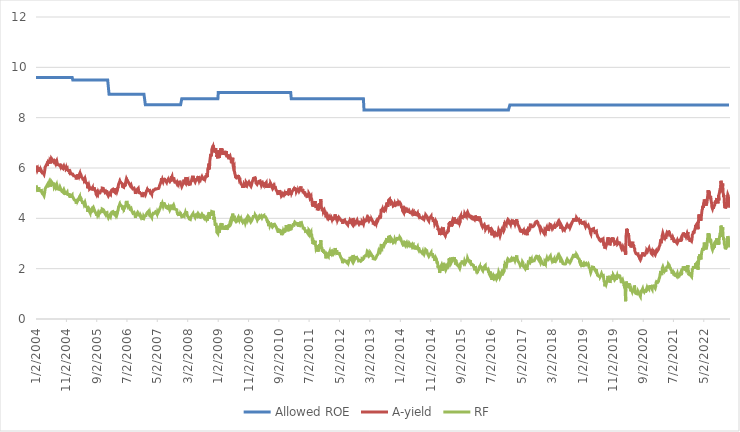
| Category | Allowed ROE | A-yield | RF |
|---|---|---|---|
| 1/2/04 | 9.6 | 6.096 | 5.309 |
| 1/5/04 | 9.6 | 6.115 | 5.33 |
| 1/6/04 | 9.6 | 6.053 | 5.27 |
| 1/7/04 | 9.6 | 6.03 | 5.258 |
| 1/8/04 | 9.6 | 6.066 | 5.287 |
| 1/9/04 | 9.6 | 5.976 | 5.2 |
| 1/12/04 | 9.6 | 5.974 | 5.194 |
| 1/13/04 | 9.6 | 5.954 | 5.166 |
| 1/14/04 | 9.6 | 5.903 | 5.14 |
| 1/15/04 | 9.6 | 5.89 | 5.121 |
| 1/16/04 | 9.6 | 5.939 | 5.148 |
| 1/19/04 | 9.6 | 5.949 | 5.153 |
| 1/20/04 | 9.6 | 5.943 | 5.155 |
| 1/21/04 | 9.6 | 5.906 | 5.117 |
| 1/22/04 | 9.6 | 5.849 | 5.056 |
| 1/23/04 | 9.6 | 5.945 | 5.149 |
| 1/26/04 | 9.6 | 5.986 | 5.186 |
| 1/27/04 | 9.6 | 5.961 | 5.16 |
| 1/28/04 | 9.6 | 6.03 | 5.234 |
| 1/29/04 | 9.6 | 6.031 | 5.229 |
| 1/30/04 | 9.6 | 5.971 | 5.172 |
| 2/2/04 | 9.6 | 5.996 | 5.189 |
| 2/3/04 | 9.6 | 5.988 | 5.175 |
| 2/4/04 | 9.6 | 5.97 | 5.173 |
| 2/5/04 | 9.6 | 5.977 | 5.179 |
| 2/6/04 | 9.6 | 5.908 | 5.105 |
| 2/9/04 | 9.6 | 5.897 | 5.094 |
| 2/10/04 | 9.6 | 5.929 | 5.125 |
| 2/11/04 | 9.6 | 5.883 | 5.082 |
| 2/12/04 | 9.6 | 5.909 | 5.103 |
| 2/13/04 | 9.6 | 5.896 | 5.088 |
| 2/16/04 | 9.6 | 5.896 | 5.088 |
| 2/17/04 | 9.6 | 5.896 | 5.088 |
| 2/18/04 | 9.6 | 5.921 | 5.11 |
| 2/19/04 | 9.6 | 5.941 | 5.121 |
| 2/20/04 | 9.6 | 5.966 | 5.156 |
| 2/23/04 | 9.6 | 5.938 | 5.132 |
| 2/24/04 | 9.6 | 5.909 | 5.106 |
| 2/25/04 | 9.6 | 5.893 | 5.092 |
| 2/26/04 | 9.6 | 5.906 | 5.102 |
| 2/27/04 | 9.6 | 5.862 | 5.06 |
| 3/1/04 | 9.6 | 5.814 | 5.023 |
| 3/2/04 | 9.6 | 5.846 | 5.025 |
| 3/3/04 | 9.6 | 5.86 | 5.047 |
| 3/4/04 | 9.6 | 5.856 | 5.046 |
| 3/5/04 | 9.6 | 5.8 | 4.984 |
| 3/8/04 | 9.6 | 5.779 | 4.96 |
| 3/9/04 | 9.6 | 5.769 | 4.956 |
| 3/10/04 | 9.6 | 5.785 | 4.966 |
| 3/11/04 | 9.6 | 5.798 | 4.977 |
| 3/12/04 | 9.6 | 5.817 | 4.99 |
| 3/15/04 | 9.6 | 5.814 | 4.966 |
| 3/16/04 | 9.6 | 5.789 | 4.941 |
| 3/17/04 | 9.6 | 5.753 | 4.912 |
| 3/18/04 | 9.6 | 5.771 | 4.918 |
| 3/19/04 | 9.6 | 5.784 | 4.926 |
| 3/22/04 | 9.6 | 5.746 | 4.897 |
| 3/23/04 | 9.6 | 5.744 | 4.898 |
| 3/24/04 | 9.6 | 5.74 | 4.895 |
| 3/25/04 | 9.6 | 5.75 | 4.898 |
| 3/26/04 | 9.6 | 5.83 | 4.978 |
| 3/29/04 | 9.6 | 5.897 | 5.035 |
| 3/30/04 | 9.6 | 5.896 | 5.04 |
| 3/31/04 | 9.6 | 5.9 | 5.035 |
| 4/1/04 | 9.6 | 5.909 | 5.05 |
| 4/2/04 | 9.6 | 6.032 | 5.174 |
| 4/5/04 | 9.6 | 6.058 | 5.207 |
| 4/6/04 | 9.6 | 6.047 | 5.198 |
| 4/7/04 | 9.6 | 6.01 | 5.161 |
| 4/8/04 | 9.6 | 6.014 | 5.163 |
| 4/12/04 | 9.6 | 6.048 | 5.191 |
| 4/13/04 | 9.6 | 6.111 | 5.255 |
| 4/14/04 | 9.6 | 6.128 | 5.279 |
| 4/15/04 | 9.6 | 6.135 | 5.276 |
| 4/16/04 | 9.6 | 6.09 | 5.232 |
| 4/19/04 | 9.6 | 6.121 | 5.264 |
| 4/20/04 | 9.6 | 6.165 | 5.304 |
| 4/21/04 | 9.6 | 6.133 | 5.276 |
| 4/22/04 | 9.6 | 6.09 | 5.236 |
| 4/23/04 | 9.6 | 6.128 | 5.274 |
| 4/26/04 | 9.6 | 6.133 | 5.276 |
| 4/27/04 | 9.6 | 6.116 | 5.264 |
| 4/28/04 | 9.6 | 6.207 | 5.301 |
| 4/29/04 | 9.6 | 6.247 | 5.329 |
| 4/30/04 | 9.6 | 6.168 | 5.25 |
| 5/3/04 | 9.6 | 6.143 | 5.22 |
| 5/4/04 | 9.6 | 6.185 | 5.257 |
| 5/5/04 | 9.6 | 6.199 | 5.273 |
| 5/6/04 | 9.6 | 6.194 | 5.267 |
| 5/7/04 | 9.6 | 6.313 | 5.367 |
| 5/10/04 | 9.6 | 6.259 | 5.353 |
| 5/11/04 | 9.6 | 6.254 | 5.342 |
| 5/12/04 | 9.6 | 6.324 | 5.422 |
| 5/13/04 | 9.6 | 6.343 | 5.446 |
| 5/14/04 | 9.6 | 6.296 | 5.395 |
| 5/17/04 | 9.6 | 6.225 | 5.325 |
| 5/18/04 | 9.6 | 6.25 | 5.353 |
| 5/19/04 | 9.6 | 6.287 | 5.392 |
| 5/20/04 | 9.6 | 6.267 | 5.36 |
| 5/21/04 | 9.6 | 6.299 | 5.38 |
| 5/25/04 | 9.6 | 6.314 | 5.392 |
| 5/26/04 | 9.6 | 6.238 | 5.323 |
| 5/27/04 | 9.6 | 6.182 | 5.261 |
| 5/28/04 | 9.6 | 6.232 | 5.3 |
| 5/31/04 | 9.6 | 6.24 | 5.306 |
| 6/1/04 | 9.6 | 6.26 | 5.33 |
| 6/2/04 | 9.6 | 6.322 | 5.392 |
| 6/3/04 | 9.6 | 6.317 | 5.388 |
| 6/4/04 | 9.6 | 6.381 | 5.461 |
| 6/7/04 | 9.6 | 6.381 | 5.46 |
| 6/8/04 | 9.6 | 6.352 | 5.434 |
| 6/9/04 | 9.6 | 6.349 | 5.441 |
| 6/10/04 | 9.6 | 6.363 | 5.443 |
| 6/11/04 | 9.6 | 6.394 | 5.473 |
| 6/14/04 | 9.6 | 6.419 | 5.493 |
| 6/15/04 | 9.6 | 6.323 | 5.4 |
| 6/16/04 | 9.6 | 6.333 | 5.428 |
| 6/17/04 | 9.6 | 6.326 | 5.419 |
| 6/18/04 | 9.6 | 6.354 | 5.419 |
| 6/21/04 | 9.6 | 6.337 | 5.424 |
| 6/22/04 | 9.6 | 6.337 | 5.431 |
| 6/23/04 | 9.6 | 6.288 | 5.381 |
| 6/24/04 | 9.6 | 6.266 | 5.35 |
| 6/25/04 | 9.6 | 6.29 | 5.361 |
| 6/28/04 | 9.6 | 6.343 | 5.416 |
| 6/29/04 | 9.6 | 6.33 | 5.397 |
| 6/30/04 | 9.6 | 6.264 | 5.335 |
| 7/2/04 | 9.6 | 6.196 | 5.261 |
| 7/5/04 | 9.6 | 6.204 | 5.271 |
| 7/6/04 | 9.6 | 6.23 | 5.294 |
| 7/7/04 | 9.6 | 6.249 | 5.303 |
| 7/8/04 | 9.6 | 6.238 | 5.29 |
| 7/9/04 | 9.6 | 6.226 | 5.277 |
| 7/12/04 | 9.6 | 6.219 | 5.273 |
| 7/13/04 | 9.6 | 6.236 | 5.29 |
| 7/14/04 | 9.6 | 6.236 | 5.292 |
| 7/15/04 | 9.6 | 6.24 | 5.289 |
| 7/16/04 | 9.6 | 6.171 | 5.223 |
| 7/19/04 | 9.6 | 6.166 | 5.225 |
| 7/20/04 | 9.6 | 6.206 | 5.267 |
| 7/21/04 | 9.6 | 6.242 | 5.294 |
| 7/22/04 | 9.6 | 6.226 | 5.276 |
| 7/23/04 | 9.6 | 6.212 | 5.261 |
| 7/26/04 | 9.6 | 6.21 | 5.262 |
| 7/27/04 | 9.6 | 6.288 | 5.337 |
| 7/28/04 | 9.6 | 6.287 | 5.33 |
| 7/29/04 | 9.6 | 6.275 | 5.327 |
| 7/30/04 | 9.6 | 6.23 | 5.28 |
| 8/3/04 | 9.6 | 6.17 | 5.218 |
| 8/4/04 | 9.6 | 6.162 | 5.219 |
| 8/5/04 | 9.6 | 6.172 | 5.219 |
| 8/6/04 | 9.6 | 6.079 | 5.12 |
| 8/9/04 | 9.6 | 6.13 | 5.168 |
| 8/10/04 | 9.6 | 6.163 | 5.206 |
| 8/11/04 | 9.6 | 6.158 | 5.172 |
| 8/12/04 | 9.6 | 6.12 | 5.154 |
| 8/13/04 | 9.6 | 6.105 | 5.138 |
| 8/16/04 | 9.6 | 6.143 | 5.17 |
| 8/17/04 | 9.6 | 6.107 | 5.142 |
| 8/18/04 | 9.6 | 6.142 | 5.18 |
| 8/19/04 | 9.6 | 6.122 | 5.154 |
| 8/20/04 | 9.6 | 6.115 | 5.152 |
| 8/23/04 | 9.6 | 6.168 | 5.201 |
| 8/24/04 | 9.6 | 6.172 | 5.211 |
| 8/25/04 | 9.6 | 6.134 | 5.182 |
| 8/26/04 | 9.6 | 6.121 | 5.167 |
| 8/27/04 | 9.6 | 6.117 | 5.16 |
| 8/30/04 | 9.6 | 6.099 | 5.141 |
| 8/31/04 | 9.6 | 6.078 | 5.117 |
| 9/1/04 | 9.6 | 6.064 | 5.11 |
| 9/2/04 | 9.6 | 6.093 | 5.138 |
| 9/3/04 | 9.6 | 6.156 | 5.19 |
| 9/7/04 | 9.6 | 6.149 | 5.182 |
| 9/8/04 | 9.6 | 6.091 | 5.141 |
| 9/9/04 | 9.6 | 6.108 | 5.157 |
| 9/10/04 | 9.6 | 6.087 | 5.133 |
| 9/13/04 | 9.6 | 6.081 | 5.13 |
| 9/14/04 | 9.6 | 6.068 | 5.126 |
| 9/15/04 | 9.6 | 6.066 | 5.13 |
| 9/16/04 | 9.6 | 6.012 | 5.077 |
| 9/17/04 | 9.6 | 6.02 | 5.091 |
| 9/20/04 | 9.6 | 5.993 | 5.053 |
| 9/21/04 | 9.6 | 6.001 | 5.061 |
| 9/22/04 | 9.6 | 5.997 | 5.05 |
| 9/23/04 | 9.6 | 6.014 | 5.058 |
| 9/24/04 | 9.6 | 6.004 | 5.054 |
| 9/27/04 | 9.6 | 5.978 | 5.037 |
| 9/28/04 | 9.6 | 5.962 | 5.026 |
| 9/29/04 | 9.6 | 6.002 | 5.067 |
| 9/30/04 | 9.6 | 6.044 | 5.102 |
| 10/1/04 | 9.6 | 6.078 | 5.137 |
| 10/4/04 | 9.6 | 6.066 | 5.133 |
| 10/5/04 | 9.6 | 6.055 | 5.119 |
| 10/6/04 | 9.6 | 6.087 | 5.146 |
| 10/7/04 | 9.6 | 6.121 | 5.174 |
| 10/8/04 | 9.6 | 6.06 | 5.112 |
| 10/12/04 | 9.6 | 6.021 | 5.081 |
| 10/13/04 | 9.6 | 6.017 | 5.077 |
| 10/14/04 | 9.6 | 5.985 | 5.042 |
| 10/15/04 | 9.6 | 6.01 | 5.062 |
| 10/18/04 | 9.6 | 5.991 | 5.042 |
| 10/19/04 | 9.6 | 5.98 | 5.023 |
| 10/20/04 | 9.6 | 5.94 | 4.989 |
| 10/21/04 | 9.6 | 5.938 | 4.983 |
| 10/22/04 | 9.6 | 5.937 | 4.965 |
| 10/25/04 | 9.6 | 5.935 | 4.956 |
| 10/26/04 | 9.6 | 5.947 | 4.967 |
| 10/27/04 | 9.6 | 6.005 | 5.017 |
| 10/28/04 | 9.6 | 5.986 | 4.991 |
| 10/29/04 | 9.6 | 5.947 | 4.965 |
| 11/1/04 | 9.6 | 5.973 | 4.986 |
| 11/2/04 | 9.6 | 5.96 | 4.975 |
| 11/3/04 | 9.6 | 5.931 | 4.962 |
| 11/4/04 | 9.6 | 5.926 | 4.965 |
| 11/5/04 | 9.6 | 5.977 | 5.018 |
| 11/8/04 | 9.6 | 5.981 | 5.02 |
| 11/9/04 | 9.6 | 5.993 | 5.035 |
| 11/10/04 | 9.6 | 5.989 | 5.025 |
| 11/12/04 | 9.6 | 5.911 | 4.957 |
| 11/15/04 | 9.6 | 5.927 | 4.976 |
| 11/16/04 | 9.6 | 5.953 | 4.992 |
| 11/17/04 | 9.6 | 5.888 | 4.941 |
| 11/18/04 | 9.6 | 5.883 | 4.945 |
| 11/19/04 | 9.6 | 5.938 | 4.991 |
| 11/22/04 | 9.6 | 5.936 | 4.979 |
| 11/23/04 | 9.6 | 5.896 | 4.948 |
| 11/24/04 | 9.6 | 5.861 | 4.918 |
| 11/25/04 | 9.6 | 5.841 | 4.896 |
| 11/26/04 | 9.6 | 5.874 | 4.918 |
| 11/29/04 | 9.6 | 5.936 | 4.981 |
| 11/30/04 | 9.6 | 5.952 | 4.993 |
| 12/1/04 | 9.6 | 5.902 | 4.965 |
| 12/2/04 | 9.6 | 5.925 | 4.98 |
| 12/3/04 | 9.6 | 5.851 | 4.897 |
| 12/6/04 | 9.6 | 5.807 | 4.876 |
| 12/7/04 | 9.6 | 5.808 | 4.874 |
| 12/8/04 | 9.6 | 5.757 | 4.834 |
| 12/9/04 | 9.6 | 5.814 | 4.886 |
| 12/10/04 | 9.6 | 5.804 | 4.872 |
| 12/13/04 | 9.6 | 5.775 | 4.854 |
| 12/14/04 | 9.6 | 5.721 | 4.82 |
| 12/15/04 | 9.6 | 5.685 | 4.795 |
| 12/16/04 | 9.6 | 5.74 | 4.844 |
| 12/17/04 | 9.6 | 5.772 | 4.873 |
| 12/20/04 | 9.6 | 5.746 | 4.863 |
| 12/21/04 | 9.6 | 5.728 | 4.855 |
| 12/22/04 | 9.6 | 5.768 | 4.892 |
| 12/23/04 | 9.6 | 5.743 | 4.872 |
| 12/24/04 | 9.6 | 5.753 | 4.872 |
| 12/29/04 | 9.6 | 5.804 | 4.926 |
| 12/30/04 | 9.6 | 5.773 | 4.88 |
| 12/31/04 | 9.6 | 5.735 | 4.841 |
| 1/4/05 | 9.5 | 5.759 | 4.864 |
| 1/5/05 | 9.5 | 5.747 | 4.847 |
| 1/6/05 | 9.5 | 5.737 | 4.839 |
| 1/7/05 | 9.5 | 5.773 | 4.862 |
| 1/10/05 | 9.5 | 5.792 | 4.877 |
| 1/11/05 | 9.5 | 5.749 | 4.846 |
| 1/12/05 | 9.5 | 5.726 | 4.831 |
| 1/13/05 | 9.5 | 5.688 | 4.778 |
| 1/14/05 | 9.5 | 5.684 | 4.784 |
| 1/17/05 | 9.5 | 5.686 | 4.763 |
| 1/18/05 | 9.5 | 5.695 | 4.758 |
| 1/19/05 | 9.5 | 5.67 | 4.738 |
| 1/20/05 | 9.5 | 5.695 | 4.749 |
| 1/21/05 | 9.5 | 5.692 | 4.738 |
| 1/24/05 | 9.5 | 5.686 | 4.728 |
| 1/25/05 | 9.5 | 5.7 | 4.744 |
| 1/26/05 | 9.5 | 5.696 | 4.737 |
| 1/27/05 | 9.5 | 5.689 | 4.739 |
| 1/28/05 | 9.5 | 5.669 | 4.708 |
| 1/31/05 | 9.5 | 5.676 | 4.714 |
| 2/1/05 | 9.5 | 5.682 | 4.721 |
| 2/2/05 | 9.5 | 5.697 | 4.732 |
| 2/3/05 | 9.5 | 5.714 | 4.752 |
| 2/4/05 | 9.5 | 5.638 | 4.671 |
| 2/7/05 | 9.5 | 5.594 | 4.63 |
| 2/8/05 | 9.5 | 5.576 | 4.613 |
| 2/9/05 | 9.5 | 5.546 | 4.583 |
| 2/10/05 | 9.5 | 5.589 | 4.629 |
| 2/11/05 | 9.5 | 5.604 | 4.637 |
| 2/14/05 | 9.5 | 5.577 | 4.612 |
| 2/15/05 | 9.5 | 5.574 | 4.624 |
| 2/16/05 | 9.5 | 5.602 | 4.646 |
| 2/17/05 | 9.5 | 5.626 | 4.66 |
| 2/18/05 | 9.5 | 5.678 | 4.715 |
| 2/21/05 | 9.5 | 5.68 | 4.722 |
| 2/22/05 | 9.5 | 5.686 | 4.732 |
| 2/23/05 | 9.5 | 5.697 | 4.753 |
| 2/24/05 | 9.5 | 5.748 | 4.771 |
| 2/25/05 | 9.5 | 5.682 | 4.721 |
| 2/28/05 | 9.5 | 5.695 | 4.751 |
| 3/1/05 | 9.5 | 5.697 | 4.751 |
| 3/2/05 | 9.5 | 5.698 | 4.761 |
| 3/3/05 | 9.5 | 5.683 | 4.746 |
| 3/4/05 | 9.5 | 5.639 | 4.703 |
| 3/7/05 | 9.5 | 5.623 | 4.684 |
| 3/8/05 | 9.5 | 5.644 | 4.706 |
| 3/9/05 | 9.5 | 5.728 | 4.793 |
| 3/10/05 | 9.5 | 5.727 | 4.79 |
| 3/11/05 | 9.5 | 5.765 | 4.827 |
| 3/14/05 | 9.5 | 5.752 | 4.816 |
| 3/15/05 | 9.5 | 5.783 | 4.848 |
| 3/16/05 | 9.5 | 5.75 | 4.809 |
| 3/17/05 | 9.5 | 5.725 | 4.78 |
| 3/18/05 | 9.5 | 5.705 | 4.773 |
| 3/21/05 | 9.5 | 5.716 | 4.79 |
| 3/22/05 | 9.5 | 5.773 | 4.835 |
| 3/23/05 | 9.5 | 5.773 | 4.825 |
| 3/24/05 | 9.5 | 5.759 | 4.823 |
| 3/28/05 | 9.5 | 5.775 | 4.841 |
| 3/29/05 | 9.5 | 5.738 | 4.809 |
| 3/30/05 | 9.5 | 5.704 | 4.78 |
| 3/31/05 | 9.5 | 5.651 | 4.714 |
| 4/1/05 | 9.5 | 5.632 | 4.688 |
| 4/4/05 | 9.5 | 5.639 | 4.697 |
| 4/5/05 | 9.5 | 5.665 | 4.722 |
| 4/6/05 | 9.5 | 5.646 | 4.707 |
| 4/7/05 | 9.5 | 5.674 | 4.735 |
| 4/8/05 | 9.5 | 5.658 | 4.714 |
| 4/11/05 | 9.5 | 5.6 | 4.661 |
| 4/12/05 | 9.5 | 5.561 | 4.621 |
| 4/13/05 | 9.5 | 5.584 | 4.645 |
| 4/14/05 | 9.5 | 5.595 | 4.653 |
| 4/15/05 | 9.5 | 5.56 | 4.616 |
| 4/18/05 | 9.5 | 5.579 | 4.628 |
| 4/19/05 | 9.5 | 5.547 | 4.593 |
| 4/20/05 | 9.5 | 5.55 | 4.593 |
| 4/21/05 | 9.5 | 5.591 | 4.628 |
| 4/22/05 | 9.5 | 5.575 | 4.61 |
| 4/25/05 | 9.5 | 5.575 | 4.606 |
| 4/26/05 | 9.5 | 5.572 | 4.604 |
| 4/27/05 | 9.5 | 5.559 | 4.59 |
| 4/28/05 | 9.5 | 5.527 | 4.558 |
| 4/29/05 | 9.5 | 5.548 | 4.578 |
| 5/2/05 | 9.5 | 5.543 | 4.569 |
| 5/3/05 | 9.5 | 5.51 | 4.557 |
| 5/4/05 | 9.5 | 5.526 | 4.575 |
| 5/5/05 | 9.5 | 5.524 | 4.576 |
| 5/6/05 | 9.5 | 5.593 | 4.634 |
| 5/9/05 | 9.5 | 5.573 | 4.617 |
| 5/10/05 | 9.5 | 5.533 | 4.573 |
| 5/11/05 | 9.5 | 5.492 | 4.54 |
| 5/12/05 | 9.5 | 5.483 | 4.522 |
| 5/13/05 | 9.5 | 5.429 | 4.476 |
| 5/16/05 | 9.5 | 5.447 | 4.484 |
| 5/17/05 | 9.5 | 5.43 | 4.477 |
| 5/18/05 | 9.5 | 5.405 | 4.458 |
| 5/19/05 | 9.5 | 5.454 | 4.5 |
| 5/20/05 | 9.5 | 5.454 | 4.505 |
| 5/24/05 | 9.5 | 5.403 | 4.452 |
| 5/25/05 | 9.5 | 5.41 | 4.463 |
| 5/26/05 | 9.5 | 5.405 | 4.456 |
| 5/27/05 | 9.5 | 5.364 | 4.42 |
| 5/30/05 | 9.5 | 5.351 | 4.41 |
| 5/31/05 | 9.5 | 5.31 | 4.369 |
| 6/1/05 | 9.5 | 5.204 | 4.273 |
| 6/2/05 | 9.5 | 5.221 | 4.29 |
| 6/3/05 | 9.5 | 5.272 | 4.339 |
| 6/6/05 | 9.5 | 5.252 | 4.318 |
| 6/7/05 | 9.5 | 5.194 | 4.27 |
| 6/8/05 | 9.5 | 5.207 | 4.286 |
| 6/9/05 | 9.5 | 5.207 | 4.29 |
| 6/10/05 | 9.5 | 5.27 | 4.354 |
| 6/13/05 | 9.5 | 5.292 | 4.369 |
| 6/14/05 | 9.5 | 5.315 | 4.394 |
| 6/15/05 | 9.5 | 5.313 | 4.393 |
| 6/16/05 | 9.5 | 5.285 | 4.363 |
| 6/17/05 | 9.5 | 5.268 | 4.357 |
| 6/20/05 | 9.5 | 5.255 | 4.353 |
| 6/21/05 | 9.5 | 5.21 | 4.309 |
| 6/22/05 | 9.5 | 5.162 | 4.262 |
| 6/23/05 | 9.5 | 5.152 | 4.25 |
| 6/24/05 | 9.5 | 5.126 | 4.228 |
| 6/27/05 | 9.5 | 5.123 | 4.219 |
| 6/28/05 | 9.5 | 5.16 | 4.254 |
| 6/29/05 | 9.5 | 5.2 | 4.289 |
| 6/30/05 | 9.5 | 5.129 | 4.214 |
| 7/4/05 | 9.5 | 5.204 | 4.306 |
| 7/5/05 | 9.5 | 5.241 | 4.344 |
| 7/6/05 | 9.5 | 5.227 | 4.326 |
| 7/7/05 | 9.5 | 5.201 | 4.319 |
| 7/8/05 | 9.5 | 5.214 | 4.319 |
| 7/11/05 | 9.5 | 5.202 | 4.336 |
| 7/12/05 | 9.5 | 5.226 | 4.359 |
| 7/13/05 | 9.5 | 5.212 | 4.353 |
| 7/14/05 | 9.5 | 5.196 | 4.333 |
| 7/15/05 | 9.5 | 5.17 | 4.314 |
| 7/18/05 | 9.5 | 5.2 | 4.343 |
| 7/19/05 | 9.5 | 5.178 | 4.318 |
| 7/20/05 | 9.5 | 5.173 | 4.318 |
| 7/21/05 | 9.5 | 5.213 | 4.357 |
| 7/22/05 | 9.5 | 5.157 | 4.297 |
| 7/25/05 | 9.5 | 5.153 | 4.285 |
| 7/26/05 | 9.5 | 5.157 | 4.304 |
| 7/27/05 | 9.5 | 5.16 | 4.313 |
| 7/28/05 | 9.5 | 5.136 | 4.27 |
| 7/29/05 | 9.5 | 5.127 | 4.274 |
| 8/2/05 | 9.5 | 5.162 | 4.332 |
| 8/3/05 | 9.5 | 5.173 | 4.32 |
| 8/4/05 | 9.5 | 5.169 | 4.316 |
| 8/5/05 | 9.5 | 5.229 | 4.372 |
| 8/8/05 | 9.5 | 5.236 | 4.378 |
| 8/9/05 | 9.5 | 5.228 | 4.372 |
| 8/10/05 | 9.5 | 5.242 | 4.4 |
| 8/11/05 | 9.5 | 5.21 | 4.363 |
| 8/12/05 | 9.5 | 5.133 | 4.302 |
| 8/15/05 | 9.5 | 5.15 | 4.318 |
| 8/16/05 | 9.5 | 5.094 | 4.254 |
| 8/17/05 | 9.5 | 5.126 | 4.29 |
| 8/18/05 | 9.5 | 5.088 | 4.25 |
| 8/19/05 | 9.5 | 5.066 | 4.238 |
| 8/22/05 | 9.5 | 5.066 | 4.245 |
| 8/23/05 | 9.5 | 5.051 | 4.23 |
| 8/24/05 | 9.5 | 5.026 | 4.203 |
| 8/25/05 | 9.5 | 4.971 | 4.169 |
| 8/26/05 | 9.5 | 4.962 | 4.167 |
| 8/29/05 | 9.5 | 4.946 | 4.154 |
| 8/30/05 | 9.5 | 4.942 | 4.137 |
| 8/31/05 | 9.5 | 4.928 | 4.122 |
| 9/1/05 | 9.5 | 4.918 | 4.105 |
| 9/2/05 | 9.5 | 4.931 | 4.105 |
| 9/6/05 | 9.5 | 4.955 | 4.138 |
| 9/7/05 | 9.5 | 5.015 | 4.198 |
| 9/8/05 | 9.5 | 5.015 | 4.187 |
| 9/9/05 | 9.5 | 4.982 | 4.156 |
| 9/12/05 | 9.5 | 4.99 | 4.185 |
| 9/13/05 | 9.5 | 4.965 | 4.16 |
| 9/14/05 | 9.5 | 4.98 | 4.173 |
| 9/15/05 | 9.5 | 4.998 | 4.193 |
| 9/16/05 | 9.5 | 5.024 | 4.229 |
| 9/19/05 | 9.5 | 5.02 | 4.212 |
| 9/20/05 | 9.5 | 5.003 | 4.21 |
| 9/21/05 | 9.5 | 4.968 | 4.175 |
| 9/22/05 | 9.5 | 4.974 | 4.175 |
| 9/23/05 | 9.5 | 5.015 | 4.216 |
| 9/26/05 | 9.5 | 5.046 | 4.244 |
| 9/27/05 | 9.5 | 5.029 | 4.23 |
| 9/28/05 | 9.5 | 5.01 | 4.217 |
| 9/29/05 | 9.5 | 5.034 | 4.24 |
| 9/30/05 | 9.5 | 5.024 | 4.221 |
| 10/3/05 | 9.5 | 5.037 | 4.242 |
| 10/4/05 | 9.5 | 5.012 | 4.212 |
| 10/5/05 | 9.5 | 4.988 | 4.192 |
| 10/6/05 | 9.5 | 5.003 | 4.199 |
| 10/7/05 | 9.5 | 4.993 | 4.192 |
| 10/11/05 | 9.5 | 5.034 | 4.229 |
| 10/12/05 | 9.5 | 5.097 | 4.291 |
| 10/13/05 | 9.5 | 5.113 | 4.306 |
| 10/14/05 | 9.5 | 5.111 | 4.3 |
| 10/17/05 | 9.5 | 5.119 | 4.307 |
| 10/18/05 | 9.5 | 5.117 | 4.304 |
| 10/19/05 | 9.5 | 5.132 | 4.327 |
| 10/20/05 | 9.5 | 5.121 | 4.305 |
| 10/21/05 | 9.5 | 5.08 | 4.265 |
| 10/24/05 | 9.5 | 5.092 | 4.276 |
| 10/25/05 | 9.5 | 5.141 | 4.322 |
| 10/26/05 | 9.5 | 5.202 | 4.369 |
| 10/27/05 | 9.5 | 5.196 | 4.359 |
| 10/28/05 | 9.5 | 5.193 | 4.351 |
| 10/31/05 | 9.5 | 5.19 | 4.348 |
| 11/1/05 | 9.5 | 5.194 | 4.352 |
| 11/2/05 | 9.5 | 5.188 | 4.356 |
| 11/3/05 | 9.5 | 5.208 | 4.362 |
| 11/4/05 | 9.5 | 5.211 | 4.365 |
| 11/7/05 | 9.5 | 5.189 | 4.342 |
| 11/8/05 | 9.5 | 5.144 | 4.303 |
| 11/9/05 | 9.5 | 5.181 | 4.337 |
| 11/10/05 | 9.5 | 5.161 | 4.314 |
| 11/14/05 | 9.5 | 5.174 | 4.327 |
| 11/15/05 | 9.5 | 5.135 | 4.287 |
| 11/16/05 | 9.5 | 5.085 | 4.238 |
| 11/17/05 | 9.5 | 5.078 | 4.232 |
| 11/18/05 | 9.5 | 5.096 | 4.248 |
| 11/21/05 | 9.5 | 5.08 | 4.233 |
| 11/22/05 | 9.5 | 5.049 | 4.198 |
| 11/23/05 | 9.5 | 5.032 | 4.18 |
| 11/24/05 | 9.5 | 5.029 | 4.178 |
| 11/25/05 | 9.5 | 5.023 | 4.17 |
| 11/28/05 | 9.5 | 5.022 | 4.158 |
| 11/29/05 | 9.5 | 5.048 | 4.184 |
| 11/30/05 | 9.5 | 5.044 | 4.185 |
| 12/1/05 | 9.5 | 5.043 | 4.179 |
| 12/2/05 | 9.5 | 5.079 | 4.213 |
| 12/5/05 | 9.5 | 5.106 | 4.24 |
| 12/6/05 | 9.5 | 5.048 | 4.185 |
| 12/7/05 | 9.5 | 5.062 | 4.2 |
| 12/8/05 | 9.5 | 5.034 | 4.175 |
| 12/9/05 | 9.5 | 5.098 | 4.224 |
| 12/12/05 | 9.5 | 5.117 | 4.243 |
| 12/13/05 | 9.5 | 5.105 | 4.23 |
| 12/14/05 | 9.5 | 5.062 | 4.186 |
| 12/15/05 | 9.5 | 5.049 | 4.173 |
| 12/16/05 | 9.5 | 4.998 | 4.122 |
| 12/19/05 | 9.5 | 4.992 | 4.11 |
| 12/20/05 | 9.5 | 5.003 | 4.123 |
| 12/21/05 | 9.5 | 4.993 | 4.118 |
| 12/22/05 | 9.5 | 4.968 | 4.09 |
| 12/23/05 | 9.5 | 4.949 | 4.073 |
| 12/28/05 | 9.5 | 4.897 | 4.02 |
| 12/29/05 | 9.5 | 4.925 | 4.043 |
| 12/30/05 | 9.5 | 4.925 | 4.045 |
| 1/3/06 | 8.93 | 4.944 | 4.068 |
| 1/4/06 | 8.93 | 4.937 | 4.056 |
| 1/5/06 | 8.93 | 4.956 | 4.075 |
| 1/6/06 | 8.93 | 4.982 | 4.097 |
| 1/9/06 | 8.93 | 4.989 | 4.114 |
| 1/10/06 | 8.93 | 5.024 | 4.15 |
| 1/11/06 | 8.93 | 5.024 | 4.15 |
| 1/12/06 | 8.93 | 5.022 | 4.14 |
| 1/13/06 | 8.93 | 4.99 | 4.104 |
| 1/16/06 | 8.93 | 4.983 | 4.093 |
| 1/17/06 | 8.93 | 4.954 | 4.064 |
| 1/18/06 | 8.93 | 4.949 | 4.061 |
| 1/19/06 | 8.93 | 4.992 | 4.104 |
| 1/20/06 | 8.93 | 4.996 | 4.108 |
| 1/23/06 | 8.93 | 5.025 | 4.137 |
| 1/24/06 | 8.93 | 5.042 | 4.154 |
| 1/25/06 | 8.93 | 5.087 | 4.204 |
| 1/26/06 | 8.93 | 5.114 | 4.23 |
| 1/27/06 | 8.93 | 5.116 | 4.234 |
| 1/30/06 | 8.93 | 5.128 | 4.249 |
| 1/31/06 | 8.93 | 5.124 | 4.244 |
| 2/1/06 | 8.93 | 5.14 | 4.261 |
| 2/2/06 | 8.93 | 5.13 | 4.249 |
| 2/3/06 | 8.93 | 5.099 | 4.218 |
| 2/6/06 | 8.93 | 5.114 | 4.232 |
| 2/7/06 | 8.93 | 5.124 | 4.243 |
| 2/8/06 | 8.93 | 5.128 | 4.252 |
| 2/9/06 | 8.93 | 5.13 | 4.247 |
| 2/10/06 | 8.93 | 5.156 | 4.267 |
| 2/13/06 | 8.93 | 5.148 | 4.261 |
| 2/14/06 | 8.93 | 5.16 | 4.272 |
| 2/15/06 | 8.93 | 5.157 | 4.272 |
| 2/16/06 | 8.93 | 5.134 | 4.245 |
| 2/17/06 | 8.93 | 5.076 | 4.185 |
| 2/20/06 | 8.93 | 5.068 | 4.175 |
| 2/21/06 | 8.93 | 5.083 | 4.193 |
| 2/22/06 | 8.93 | 5.037 | 4.152 |
| 2/23/06 | 8.93 | 5.067 | 4.172 |
| 2/24/06 | 8.93 | 5.065 | 4.175 |
| 2/27/06 | 8.93 | 5.067 | 4.176 |
| 2/28/06 | 8.93 | 5.037 | 4.145 |
| 3/1/06 | 8.93 | 5.074 | 4.175 |
| 3/2/06 | 8.93 | 5.108 | 4.205 |
| 3/3/06 | 8.93 | 5.132 | 4.233 |
| 3/6/06 | 8.93 | 5.194 | 4.293 |
| 3/7/06 | 8.93 | 5.148 | 4.25 |
| 3/8/06 | 8.93 | 5.151 | 4.242 |
| 3/9/06 | 8.93 | 5.161 | 4.245 |
| 3/10/06 | 8.93 | 5.171 | 4.256 |
| 3/13/06 | 8.93 | 5.176 | 4.26 |
| 3/14/06 | 8.93 | 5.119 | 4.201 |
| 3/15/06 | 8.93 | 5.144 | 4.223 |
| 3/16/06 | 8.93 | 5.077 | 4.156 |
| 3/17/06 | 8.93 | 5.101 | 4.178 |
| 3/20/06 | 8.93 | 5.101 | 4.183 |
| 3/21/06 | 8.93 | 5.124 | 4.204 |
| 3/22/06 | 8.93 | 5.106 | 4.191 |
| 3/23/06 | 8.93 | 5.124 | 4.204 |
| 3/24/06 | 8.93 | 5.077 | 4.16 |
| 3/27/06 | 8.93 | 5.099 | 4.179 |
| 3/28/06 | 8.93 | 5.125 | 4.213 |
| 3/29/06 | 8.93 | 5.144 | 4.235 |
| 3/30/06 | 8.93 | 5.192 | 4.277 |
| 3/31/06 | 8.93 | 5.175 | 4.26 |
| 4/3/06 | 8.93 | 5.205 | 4.29 |
| 4/4/06 | 8.93 | 5.229 | 4.317 |
| 4/5/06 | 8.93 | 5.232 | 4.324 |
| 4/6/06 | 8.93 | 5.281 | 4.366 |
| 4/7/06 | 8.93 | 5.347 | 4.441 |
| 4/10/06 | 8.93 | 5.338 | 4.432 |
| 4/11/06 | 8.93 | 5.32 | 4.415 |
| 4/12/06 | 8.93 | 5.353 | 4.443 |
| 4/13/06 | 8.93 | 5.398 | 4.491 |
| 4/17/06 | 8.93 | 5.386 | 4.479 |
| 4/18/06 | 8.93 | 5.376 | 4.468 |
| 4/19/06 | 8.93 | 5.418 | 4.512 |
| 4/20/06 | 8.93 | 5.459 | 4.552 |
| 4/21/06 | 8.93 | 5.437 | 4.527 |
| 4/24/06 | 8.93 | 5.397 | 4.484 |
| 4/25/06 | 8.93 | 5.462 | 4.548 |
| 4/26/06 | 8.93 | 5.473 | 4.568 |
| 4/27/06 | 8.93 | 5.461 | 4.555 |
| 4/28/06 | 8.93 | 5.43 | 4.518 |
| 5/1/06 | 8.93 | 5.451 | 4.551 |
| 5/2/06 | 8.93 | 5.421 | 4.523 |
| 5/3/06 | 8.93 | 5.409 | 4.51 |
| 5/4/06 | 8.93 | 5.406 | 4.502 |
| 5/5/06 | 8.93 | 5.396 | 4.493 |
| 5/8/06 | 8.93 | 5.384 | 4.488 |
| 5/9/06 | 8.93 | 5.41 | 4.513 |
| 5/10/06 | 8.93 | 5.403 | 4.513 |
| 5/11/06 | 8.93 | 5.416 | 4.518 |
| 5/12/06 | 8.93 | 5.41 | 4.517 |
| 5/15/06 | 8.93 | 5.371 | 4.476 |
| 5/16/06 | 8.93 | 5.324 | 4.433 |
| 5/17/06 | 8.93 | 5.319 | 4.45 |
| 5/18/06 | 8.93 | 5.261 | 4.386 |
| 5/19/06 | 8.93 | 5.277 | 4.386 |
| 5/23/06 | 8.93 | 5.272 | 4.368 |
| 5/24/06 | 8.93 | 5.232 | 4.353 |
| 5/25/06 | 8.93 | 5.225 | 4.348 |
| 5/26/06 | 8.93 | 5.243 | 4.359 |
| 5/29/06 | 8.93 | 5.237 | 4.354 |
| 5/30/06 | 8.93 | 5.288 | 4.405 |
| 5/31/06 | 8.93 | 5.374 | 4.497 |
| 6/1/06 | 8.93 | 5.326 | 4.44 |
| 6/2/06 | 8.93 | 5.26 | 4.375 |
| 6/5/06 | 8.93 | 5.266 | 4.38 |
| 6/6/06 | 8.93 | 5.243 | 4.36 |
| 6/7/06 | 8.93 | 5.264 | 4.384 |
| 6/8/06 | 8.93 | 5.279 | 4.393 |
| 6/9/06 | 8.93 | 5.322 | 4.424 |
| 6/12/06 | 8.93 | 5.306 | 4.415 |
| 6/13/06 | 8.93 | 5.276 | 4.385 |
| 6/14/06 | 8.93 | 5.309 | 4.416 |
| 6/15/06 | 8.93 | 5.355 | 4.453 |
| 6/16/06 | 8.93 | 5.345 | 4.443 |
| 6/19/06 | 8.93 | 5.37 | 4.463 |
| 6/20/06 | 8.93 | 5.426 | 4.524 |
| 6/21/06 | 8.93 | 5.462 | 4.561 |
| 6/22/06 | 8.93 | 5.506 | 4.598 |
| 6/23/06 | 8.93 | 5.546 | 4.638 |
| 6/26/06 | 8.93 | 5.571 | 4.663 |
| 6/27/06 | 8.93 | 5.545 | 4.636 |
| 6/28/06 | 8.93 | 5.581 | 4.663 |
| 6/29/06 | 8.93 | 5.552 | 4.631 |
| 6/30/06 | 8.93 | 5.535 | 4.614 |
| 7/4/06 | 8.93 | 5.564 | 4.642 |
| 7/5/06 | 8.93 | 5.566 | 4.651 |
| 7/6/06 | 8.93 | 5.543 | 4.623 |
| 7/7/06 | 8.93 | 5.469 | 4.54 |
| 7/10/06 | 8.93 | 5.443 | 4.517 |
| 7/11/06 | 8.93 | 5.416 | 4.49 |
| 7/12/06 | 8.93 | 5.458 | 4.52 |
| 7/13/06 | 8.93 | 5.448 | 4.518 |
| 7/14/06 | 8.93 | 5.444 | 4.512 |
| 7/17/06 | 8.93 | 5.44 | 4.505 |
| 7/18/06 | 8.93 | 5.48 | 4.551 |
| 7/19/06 | 8.93 | 5.424 | 4.496 |
| 7/20/06 | 8.93 | 5.425 | 4.489 |
| 7/21/06 | 8.93 | 5.393 | 4.459 |
| 7/24/06 | 8.93 | 5.385 | 4.448 |
| 7/25/06 | 8.93 | 5.397 | 4.473 |
| 7/26/06 | 8.93 | 5.379 | 4.452 |
| 7/27/06 | 8.93 | 5.374 | 4.441 |
| 7/28/06 | 8.93 | 5.346 | 4.41 |
| 7/31/06 | 8.93 | 5.313 | 4.377 |
| 8/1/06 | 8.93 | 5.311 | 4.379 |
| 8/2/06 | 8.93 | 5.314 | 4.393 |
| 8/3/06 | 8.93 | 5.319 | 4.392 |
| 8/4/06 | 8.93 | 5.296 | 4.367 |
| 8/8/06 | 8.93 | 5.278 | 4.352 |
| 8/9/06 | 8.93 | 5.277 | 4.359 |
| 8/10/06 | 8.93 | 5.306 | 4.381 |
| 8/11/06 | 8.93 | 5.336 | 4.407 |
| 8/14/06 | 8.93 | 5.351 | 4.426 |
| 8/15/06 | 8.93 | 5.304 | 4.376 |
| 8/16/06 | 8.93 | 5.266 | 4.338 |
| 8/17/06 | 8.93 | 5.261 | 4.326 |
| 8/18/06 | 8.93 | 5.23 | 4.295 |
| 8/21/06 | 8.93 | 5.213 | 4.277 |
| 8/22/06 | 8.93 | 5.201 | 4.263 |
| 8/23/06 | 8.93 | 5.195 | 4.265 |
| 8/24/06 | 8.93 | 5.196 | 4.264 |
| 8/25/06 | 8.93 | 5.18 | 4.252 |
| 8/28/06 | 8.93 | 5.178 | 4.249 |
| 8/29/06 | 8.93 | 5.17 | 4.241 |
| 8/30/06 | 8.93 | 5.159 | 4.205 |
| 8/31/06 | 8.93 | 5.147 | 4.193 |
| 9/1/06 | 8.93 | 5.133 | 4.169 |
| 9/5/06 | 8.93 | 5.183 | 4.223 |
| 9/6/06 | 8.93 | 5.193 | 4.238 |
| 9/7/06 | 8.93 | 5.182 | 4.224 |
| 9/8/06 | 8.93 | 5.161 | 4.198 |
| 9/11/06 | 8.93 | 5.198 | 4.235 |
| 9/12/06 | 8.93 | 5.164 | 4.201 |
| 9/13/06 | 8.93 | 5.168 | 4.209 |
| 9/14/06 | 8.93 | 5.177 | 4.215 |
| 9/15/06 | 8.93 | 5.155 | 4.193 |
| 9/18/06 | 8.93 | 5.161 | 4.201 |
| 9/19/06 | 8.93 | 5.115 | 4.165 |
| 9/20/06 | 8.93 | 5.119 | 4.167 |
| 9/21/06 | 8.93 | 5.066 | 4.11 |
| 9/22/06 | 8.93 | 5.04 | 4.087 |
| 9/25/06 | 8.93 | 4.97 | 4.015 |
| 9/26/06 | 8.93 | 5.005 | 4.05 |
| 9/27/06 | 8.93 | 5.024 | 4.069 |
| 9/28/06 | 8.93 | 5.034 | 4.081 |
| 9/29/06 | 8.93 | 5.036 | 4.085 |
| 10/2/06 | 8.93 | 5.022 | 4.068 |
| 10/3/06 | 8.93 | 5.015 | 4.069 |
| 10/4/06 | 8.93 | 4.993 | 4.052 |
| 10/5/06 | 8.93 | 5.035 | 4.092 |
| 10/6/06 | 8.93 | 5.096 | 4.157 |
| 10/10/06 | 8.93 | 5.122 | 4.182 |
| 10/11/06 | 8.93 | 5.143 | 4.197 |
| 10/12/06 | 8.93 | 5.152 | 4.206 |
| 10/13/06 | 8.93 | 5.174 | 4.232 |
| 10/16/06 | 8.93 | 5.167 | 4.227 |
| 10/17/06 | 8.93 | 5.168 | 4.238 |
| 10/18/06 | 8.93 | 5.153 | 4.224 |
| 10/19/06 | 8.93 | 5.171 | 4.245 |
| 10/20/06 | 8.93 | 5.174 | 4.246 |
| 10/23/06 | 8.93 | 5.196 | 4.268 |
| 10/24/06 | 8.93 | 5.183 | 4.267 |
| 10/25/06 | 8.93 | 5.147 | 4.242 |
| 10/26/06 | 8.93 | 5.075 | 4.179 |
| 10/27/06 | 8.93 | 5.042 | 4.142 |
| 10/30/06 | 8.93 | 5.033 | 4.136 |
| 10/31/06 | 8.93 | 4.981 | 4.085 |
| 11/1/06 | 8.93 | 4.954 | 4.066 |
| 11/2/06 | 8.93 | 4.985 | 4.095 |
| 11/3/06 | 8.93 | 5.066 | 4.173 |
| 11/6/06 | 8.93 | 5.06 | 4.164 |
| 11/7/06 | 8.93 | 5.007 | 4.115 |
| 11/8/06 | 8.93 | 4.999 | 4.107 |
| 11/9/06 | 8.93 | 4.997 | 4.105 |
| 11/10/06 | 8.93 | 4.977 | 4.08 |
| 11/14/06 | 8.93 | 4.969 | 4.064 |
| 11/15/06 | 8.93 | 4.992 | 4.093 |
| 11/16/06 | 8.93 | 5.006 | 4.108 |
| 11/17/06 | 8.93 | 4.98 | 4.081 |
| 11/20/06 | 8.93 | 4.984 | 4.087 |
| 11/21/06 | 8.93 | 4.974 | 4.077 |
| 11/22/06 | 8.93 | 4.958 | 4.061 |
| 11/23/06 | 8.93 | 4.963 | 4.067 |
| 11/24/06 | 8.93 | 4.945 | 4.048 |
| 11/27/06 | 8.93 | 4.939 | 4.038 |
| 11/28/06 | 8.93 | 4.898 | 4.002 |
| 11/29/06 | 8.93 | 4.922 | 4.02 |
| 11/30/06 | 8.93 | 4.896 | 3.992 |
| 12/1/06 | 8.93 | 4.863 | 3.963 |
| 12/4/06 | 8.93 | 4.873 | 3.972 |
| 12/5/06 | 8.93 | 4.874 | 3.975 |
| 12/6/06 | 8.93 | 4.887 | 3.986 |
| 12/7/06 | 8.93 | 4.889 | 3.981 |
| 12/8/06 | 8.93 | 4.92 | 4.015 |
| 12/11/06 | 8.93 | 4.894 | 3.988 |
| 12/12/06 | 8.93 | 4.879 | 3.973 |
| 12/13/06 | 8.93 | 4.94 | 4.037 |
| 12/14/06 | 8.93 | 4.958 | 4.053 |
| 12/15/06 | 8.93 | 4.986 | 4.081 |
| 12/18/06 | 8.93 | 5.013 | 4.109 |
| 12/19/06 | 8.93 | 4.999 | 4.095 |
| 12/20/06 | 8.93 | 4.991 | 4.085 |
| 12/21/06 | 8.93 | 4.948 | 4.036 |
| 12/22/06 | 8.93 | 4.969 | 4.062 |
| 12/27/06 | 8.93 | 4.971 | 4.099 |
| 12/28/06 | 8.93 | 5.032 | 4.133 |
| 12/29/06 | 8.93 | 5.035 | 4.138 |
| 1/2/07 | 8.51 | 5.013 | 4.116 |
| 1/3/07 | 8.51 | 5 | 4.103 |
| 1/4/07 | 8.51 | 4.958 | 4.06 |
| 1/5/07 | 8.51 | 4.989 | 4.093 |
| 1/8/07 | 8.51 | 5.005 | 4.107 |
| 1/9/07 | 8.51 | 5.009 | 4.109 |
| 1/10/07 | 8.51 | 5.029 | 4.13 |
| 1/11/07 | 8.51 | 5.06 | 4.16 |
| 1/12/07 | 8.51 | 5.082 | 4.182 |
| 1/15/07 | 8.51 | 5.093 | 4.186 |
| 1/16/07 | 8.51 | 5.093 | 4.191 |
| 1/17/07 | 8.51 | 5.108 | 4.21 |
| 1/18/07 | 8.51 | 5.113 | 4.178 |
| 1/19/07 | 8.51 | 5.055 | 4.183 |
| 1/22/07 | 8.51 | 5.075 | 4.176 |
| 1/23/07 | 8.51 | 5.105 | 4.205 |
| 1/24/07 | 8.51 | 5.118 | 4.218 |
| 1/25/07 | 8.51 | 5.148 | 4.247 |
| 1/26/07 | 8.51 | 5.144 | 4.24 |
| 1/29/07 | 8.51 | 5.163 | 4.263 |
| 1/30/07 | 8.51 | 5.172 | 4.272 |
| 1/31/07 | 8.51 | 5.116 | 4.219 |
| 2/1/07 | 8.51 | 5.123 | 4.233 |
| 2/2/07 | 8.51 | 5.121 | 4.222 |
| 2/5/07 | 8.51 | 5.108 | 4.206 |
| 2/6/07 | 8.51 | 5.087 | 4.174 |
| 2/7/07 | 8.51 | 5.068 | 4.16 |
| 2/8/07 | 8.51 | 5.066 | 4.157 |
| 2/9/07 | 8.51 | 5.113 | 4.206 |
| 2/12/07 | 8.51 | 5.143 | 4.235 |
| 2/13/07 | 8.51 | 5.168 | 4.258 |
| 2/14/07 | 8.51 | 5.092 | 4.187 |
| 2/15/07 | 8.51 | 5.071 | 4.162 |
| 2/16/07 | 8.51 | 5.056 | 4.148 |
| 2/19/07 | 8.51 | 5.048 | 4.142 |
| 2/20/07 | 8.51 | 5.03 | 4.126 |
| 2/21/07 | 8.51 | 5.039 | 4.14 |
| 2/22/07 | 8.51 | 5.077 | 4.173 |
| 2/23/07 | 8.51 | 5.053 | 4.147 |
| 2/26/07 | 8.51 | 5.011 | 4.104 |
| 2/27/07 | 8.51 | 4.957 | 4.049 |
| 2/28/07 | 8.51 | 5.001 | 4.093 |
| 3/1/07 | 8.51 | 4.997 | 4.094 |
| 3/2/07 | 8.51 | 4.986 | 4.08 |
| 3/5/07 | 8.51 | 4.985 | 4.076 |
| 3/6/07 | 8.51 | 4.99 | 4.081 |
| 3/7/07 | 8.51 | 4.952 | 4.042 |
| 3/8/07 | 8.51 | 4.974 | 4.064 |
| 3/9/07 | 8.51 | 5.022 | 4.113 |
| 3/12/07 | 8.51 | 5.005 | 4.096 |
| 3/13/07 | 8.51 | 4.991 | 4.079 |
| 3/14/07 | 8.51 | 5.026 | 4.108 |
| 3/15/07 | 8.51 | 5.031 | 4.108 |
| 3/16/07 | 8.51 | 5.046 | 4.119 |
| 3/19/07 | 8.51 | 5.073 | 4.148 |
| 3/20/07 | 8.51 | 5.09 | 4.164 |
| 3/21/07 | 8.51 | 5.093 | 4.175 |
| 3/22/07 | 8.51 | 5.122 | 4.205 |
| 3/23/07 | 8.51 | 5.125 | 4.206 |
| 3/26/07 | 8.51 | 5.129 | 4.21 |
| 3/27/07 | 8.51 | 5.121 | 4.196 |
| 3/28/07 | 8.51 | 5.128 | 4.209 |
| 3/29/07 | 8.51 | 5.139 | 4.213 |
| 3/30/07 | 8.51 | 5.126 | 4.2 |
| 4/2/07 | 8.51 | 5.127 | 4.203 |
| 4/3/07 | 8.51 | 5.142 | 4.219 |
| 4/4/07 | 8.51 | 5.113 | 4.189 |
| 4/5/07 | 8.51 | 5.133 | 4.206 |
| 4/9/07 | 8.51 | 5.156 | 4.241 |
| 4/10/07 | 8.51 | 5.144 | 4.219 |
| 4/11/07 | 8.51 | 5.162 | 4.226 |
| 4/12/07 | 8.51 | 5.172 | 4.236 |
| 4/13/07 | 8.51 | 5.192 | 4.254 |
| 4/16/07 | 8.51 | 5.194 | 4.255 |
| 4/17/07 | 8.51 | 5.158 | 4.222 |
| 4/18/07 | 8.51 | 5.155 | 4.224 |
| 4/19/07 | 8.51 | 5.162 | 4.227 |
| 4/20/07 | 8.51 | 5.195 | 4.256 |
| 4/23/07 | 8.51 | 5.166 | 4.224 |
| 4/24/07 | 8.51 | 5.133 | 4.197 |
| 4/25/07 | 8.51 | 5.133 | 4.198 |
| 4/26/07 | 8.51 | 5.179 | 4.24 |
| 4/27/07 | 8.51 | 5.204 | 4.267 |
| 4/30/07 | 8.51 | 5.131 | 4.194 |
| 5/1/07 | 8.51 | 5.142 | 4.201 |
| 5/2/07 | 8.51 | 5.167 | 4.226 |
| 5/3/07 | 8.51 | 5.199 | 4.253 |
| 5/4/07 | 8.51 | 5.181 | 4.235 |
| 5/7/07 | 8.51 | 5.164 | 4.215 |
| 5/8/07 | 8.51 | 5.162 | 4.21 |
| 5/9/07 | 8.51 | 5.167 | 4.22 |
| 5/10/07 | 8.51 | 5.161 | 4.213 |
| 5/11/07 | 8.51 | 5.152 | 4.208 |
| 5/14/07 | 8.51 | 5.194 | 4.245 |
| 5/15/07 | 8.51 | 5.188 | 4.243 |
| 5/16/07 | 8.51 | 5.183 | 4.242 |
| 5/17/07 | 8.51 | 5.224 | 4.281 |
| 5/18/07 | 8.51 | 5.225 | 4.283 |
| 5/22/07 | 8.51 | 5.252 | 4.303 |
| 5/23/07 | 8.51 | 5.295 | 4.348 |
| 5/24/07 | 8.51 | 5.312 | 4.367 |
| 5/25/07 | 8.51 | 5.321 | 4.376 |
| 5/28/07 | 8.51 | 5.338 | 4.392 |
| 5/29/07 | 8.51 | 5.364 | 4.42 |
| 5/30/07 | 8.51 | 5.33 | 4.394 |
| 5/31/07 | 8.51 | 5.328 | 4.387 |
| 6/1/07 | 8.51 | 5.33 | 4.391 |
| 6/4/07 | 8.51 | 5.298 | 4.358 |
| 6/5/07 | 8.51 | 5.329 | 4.388 |
| 6/6/07 | 8.51 | 5.327 | 4.387 |
| 6/7/07 | 8.51 | 5.447 | 4.498 |
| 6/8/07 | 8.51 | 5.48 | 4.525 |
| 6/11/07 | 8.51 | 5.495 | 4.561 |
| 6/12/07 | 8.51 | 5.597 | 4.651 |
| 6/13/07 | 8.51 | 5.526 | 4.6 |
| 6/14/07 | 8.51 | 5.534 | 4.599 |
| 6/15/07 | 8.51 | 5.462 | 4.527 |
| 6/18/07 | 8.51 | 5.481 | 4.549 |
| 6/19/07 | 8.51 | 5.466 | 4.53 |
| 6/20/07 | 8.51 | 5.484 | 4.55 |
| 6/21/07 | 8.51 | 5.542 | 4.597 |
| 6/22/07 | 8.51 | 5.525 | 4.58 |
| 6/25/07 | 8.51 | 5.491 | 4.546 |
| 6/26/07 | 8.51 | 5.51 | 4.555 |
| 6/27/07 | 8.51 | 5.515 | 4.56 |
| 6/28/07 | 8.51 | 5.527 | 4.56 |
| 6/29/07 | 8.51 | 5.451 | 4.489 |
| 7/3/07 | 8.51 | 5.453 | 4.485 |
| 7/4/07 | 8.51 | 5.474 | 4.511 |
| 7/5/07 | 8.51 | 5.53 | 4.568 |
| 7/6/07 | 8.51 | 5.606 | 4.633 |
| 7/9/07 | 8.51 | 5.579 | 4.595 |
| 7/10/07 | 8.51 | 5.49 | 4.51 |
| 7/11/07 | 8.51 | 5.533 | 4.551 |
| 7/12/07 | 8.51 | 5.591 | 4.603 |
| 7/13/07 | 8.51 | 5.569 | 4.576 |
| 7/16/07 | 8.51 | 5.525 | 4.532 |
| 7/17/07 | 8.51 | 5.55 | 4.559 |
| 7/18/07 | 8.51 | 5.507 | 4.54 |
| 7/19/07 | 8.51 | 5.512 | 4.54 |
| 7/20/07 | 8.51 | 5.489 | 4.5 |
| 7/23/07 | 8.51 | 5.5 | 4.503 |
| 7/24/07 | 8.51 | 5.512 | 4.508 |
| 7/25/07 | 8.51 | 5.483 | 4.488 |
| 7/26/07 | 8.51 | 5.458 | 4.453 |
| 7/27/07 | 8.51 | 5.463 | 4.434 |
| 7/30/07 | 8.51 | 5.49 | 4.472 |
| 7/31/07 | 8.51 | 5.475 | 4.461 |
| 8/1/07 | 8.51 | 5.457 | 4.454 |
| 8/2/07 | 8.51 | 5.454 | 4.429 |
| 8/3/07 | 8.51 | 5.424 | 4.401 |
| 8/7/07 | 8.51 | 5.439 | 4.41 |
| 8/8/07 | 8.51 | 5.489 | 4.467 |
| 8/9/07 | 8.51 | 5.497 | 4.469 |
| 8/10/07 | 8.51 | 5.512 | 4.479 |
| 8/13/07 | 8.51 | 5.504 | 4.462 |
| 8/14/07 | 8.51 | 5.464 | 4.437 |
| 8/15/07 | 8.51 | 5.524 | 4.47 |
| 8/16/07 | 8.51 | 5.527 | 4.465 |
| 8/17/07 | 8.51 | 5.545 | 4.471 |
| 8/20/07 | 8.51 | 5.524 | 4.465 |
| 8/21/07 | 8.51 | 5.531 | 4.454 |
| 8/22/07 | 8.51 | 5.558 | 4.482 |
| 8/23/07 | 8.51 | 5.536 | 4.467 |
| 8/24/07 | 8.51 | 5.502 | 4.434 |
| 8/27/07 | 8.51 | 5.47 | 4.396 |
| 8/28/07 | 8.51 | 5.439 | 4.375 |
| 8/29/07 | 8.51 | 5.512 | 4.446 |
| 8/30/07 | 8.51 | 5.508 | 4.424 |
| 8/31/07 | 8.51 | 5.532 | 4.461 |
| 9/4/07 | 8.51 | 5.51 | 4.442 |
| 9/5/07 | 8.51 | 5.463 | 4.397 |
| 9/6/07 | 8.51 | 5.471 | 4.394 |
| 9/7/07 | 8.51 | 5.454 | 4.355 |
| 9/10/07 | 8.51 | 5.457 | 4.343 |
| 9/11/07 | 8.51 | 5.501 | 4.389 |
| 9/12/07 | 8.51 | 5.502 | 4.392 |
| 9/13/07 | 8.51 | 5.514 | 4.403 |
| 9/14/07 | 8.51 | 5.491 | 4.385 |
| 9/17/07 | 8.51 | 5.461 | 4.354 |
| 9/18/07 | 8.51 | 5.496 | 4.377 |
| 9/19/07 | 8.51 | 5.596 | 4.453 |
| 9/20/07 | 8.51 | 5.684 | 4.542 |
| 9/21/07 | 8.51 | 5.616 | 4.47 |
| 9/24/07 | 8.51 | 5.622 | 4.479 |
| 9/25/07 | 8.51 | 5.626 | 4.48 |
| 9/26/07 | 8.51 | 5.66 | 4.505 |
| 9/27/07 | 8.51 | 5.647 | 4.487 |
| 9/28/07 | 8.51 | 5.598 | 4.444 |
| 10/1/07 | 8.51 | 5.574 | 4.422 |
| 10/2/07 | 8.51 | 5.564 | 4.421 |
| 10/3/07 | 8.51 | 5.583 | 4.449 |
| 10/4/07 | 8.51 | 5.532 | 4.408 |
| 10/5/07 | 8.51 | 5.593 | 4.484 |
| 10/9/07 | 8.51 | 5.595 | 4.504 |
| 10/10/07 | 8.51 | 5.572 | 4.48 |
| 10/11/07 | 8.51 | 5.576 | 4.491 |
| 10/12/07 | 8.51 | 5.613 | 4.532 |
| 10/15/07 | 8.51 | 5.608 | 4.522 |
| 10/16/07 | 8.51 | 5.584 | 4.503 |
| 10/17/07 | 8.51 | 5.555 | 4.47 |
| 10/18/07 | 8.51 | 5.538 | 4.438 |
| 10/19/07 | 8.51 | 5.487 | 4.382 |
| 10/22/07 | 8.51 | 5.463 | 4.382 |
| 10/23/07 | 8.51 | 5.461 | 4.391 |
| 10/24/07 | 8.51 | 5.439 | 4.376 |
| 10/25/07 | 8.51 | 5.457 | 4.388 |
| 10/26/07 | 8.51 | 5.435 | 4.367 |
| 10/29/07 | 8.51 | 5.426 | 4.361 |
| 10/30/07 | 8.51 | 5.427 | 4.36 |
| 10/31/07 | 8.51 | 5.445 | 4.379 |
| 11/1/07 | 8.51 | 5.423 | 4.342 |
| 11/2/07 | 8.51 | 5.458 | 4.381 |
| 11/5/07 | 8.51 | 5.452 | 4.362 |
| 11/6/07 | 8.51 | 5.472 | 4.384 |
| 11/7/07 | 8.51 | 5.458 | 4.373 |
| 11/8/07 | 8.51 | 5.467 | 4.378 |
| 11/9/07 | 8.51 | 5.442 | 4.337 |
| 11/13/07 | 8.51 | 5.458 | 4.341 |
| 11/14/07 | 8.51 | 5.429 | 4.316 |
| 11/15/07 | 8.51 | 5.37 | 4.248 |
| 11/16/07 | 8.51 | 5.403 | 4.256 |
| 11/19/07 | 8.51 | 5.389 | 4.224 |
| 11/20/07 | 8.51 | 5.431 | 4.257 |
| 11/21/07 | 8.51 | 5.427 | 4.231 |
| 11/22/07 | 8.51 | 5.432 | 4.223 |
| 11/23/07 | 8.51 | 5.448 | 4.215 |
| 11/26/07 | 8.51 | 5.384 | 4.144 |
| 11/27/07 | 8.51 | 5.444 | 4.206 |
| 11/28/07 | 8.51 | 5.483 | 4.232 |
| 11/29/07 | 8.51 | 5.391 | 4.157 |
| 11/30/07 | 8.51 | 5.404 | 4.167 |
| 12/3/07 | 8.51 | 5.351 | 4.095 |
| 12/4/07 | 8.51 | 5.341 | 4.101 |
| 12/5/07 | 8.51 | 5.405 | 4.153 |
| 12/6/07 | 8.51 | 5.428 | 4.164 |
| 12/7/07 | 8.51 | 5.446 | 4.201 |
| 12/10/07 | 8.51 | 5.466 | 4.221 |
| 12/11/07 | 8.51 | 5.368 | 4.114 |
| 12/12/07 | 8.51 | 5.412 | 4.167 |
| 12/13/07 | 8.51 | 5.493 | 4.255 |
| 12/14/07 | 8.51 | 5.507 | 4.248 |
| 12/17/07 | 8.51 | 5.406 | 4.167 |
| 12/18/07 | 8.51 | 5.365 | 4.144 |
| 12/19/07 | 8.51 | 5.319 | 4.096 |
| 12/20/07 | 8.51 | 5.326 | 4.105 |
| 12/21/07 | 8.51 | 5.401 | 4.168 |
| 12/24/07 | 8.51 | 5.394 | 4.18 |
| 12/27/07 | 8.51 | 5.405 | 4.186 |
| 12/28/07 | 8.51 | 5.33 | 4.121 |
| 12/31/07 | 8.51 | 5.312 | 4.104 |
| 1/2/08 | 8.75 | 5.264 | 4.059 |
| 1/3/08 | 8.75 | 5.28 | 4.083 |
| 1/4/08 | 8.75 | 5.272 | 4.077 |
| 1/7/08 | 8.75 | 5.264 | 4.063 |
| 1/8/08 | 8.75 | 5.254 | 4.057 |
| 1/9/08 | 8.75 | 5.289 | 4.068 |
| 1/10/08 | 8.75 | 5.336 | 4.091 |
| 1/11/08 | 8.75 | 5.351 | 4.066 |
| 1/14/08 | 8.75 | 5.359 | 4.074 |
| 1/15/08 | 8.75 | 5.33 | 4.044 |
| 1/16/08 | 8.75 | 5.367 | 4.083 |
| 1/17/08 | 8.75 | 5.347 | 4.061 |
| 1/18/08 | 8.75 | 5.388 | 4.08 |
| 1/21/08 | 8.75 | 5.362 | 4.064 |
| 1/22/08 | 8.75 | 5.441 | 4.127 |
| 1/23/08 | 8.75 | 5.494 | 4.182 |
| 1/24/08 | 8.75 | 5.536 | 4.212 |
| 1/25/08 | 8.75 | 5.462 | 4.145 |
| 1/28/08 | 8.75 | 5.438 | 4.141 |
| 1/29/08 | 8.75 | 5.47 | 4.174 |
| 1/30/08 | 8.75 | 5.5 | 4.195 |
| 1/31/08 | 8.75 | 5.476 | 4.18 |
| 2/1/08 | 8.75 | 5.438 | 4.137 |
| 2/4/08 | 8.75 | 5.456 | 4.156 |
| 2/5/08 | 8.75 | 5.408 | 4.11 |
| 2/6/08 | 8.75 | 5.453 | 4.15 |
| 2/7/08 | 8.75 | 5.542 | 4.223 |
| 2/8/08 | 8.75 | 5.529 | 4.194 |
| 2/11/08 | 8.75 | 5.503 | 4.165 |
| 2/12/08 | 8.75 | 5.568 | 4.209 |
| 2/13/08 | 8.75 | 5.578 | 4.249 |
| 2/14/08 | 8.75 | 5.63 | 4.27 |
| 2/15/08 | 8.75 | 5.543 | 4.204 |
| 2/18/08 | 8.75 | 5.543 | 4.204 |
| 2/19/08 | 8.75 | 5.628 | 4.276 |
| 2/20/08 | 8.75 | 5.612 | 4.258 |
| 2/21/08 | 8.75 | 5.584 | 4.219 |
| 2/22/08 | 8.75 | 5.595 | 4.232 |
| 2/25/08 | 8.75 | 5.618 | 4.25 |
| 2/26/08 | 8.75 | 5.561 | 4.209 |
| 2/27/08 | 8.75 | 5.513 | 4.184 |
| 2/28/08 | 8.75 | 5.442 | 4.099 |
| 2/29/08 | 8.75 | 5.432 | 4.09 |
| 3/3/08 | 8.75 | 5.444 | 4.084 |
| 3/4/08 | 8.75 | 5.464 | 4.114 |
| 3/5/08 | 8.75 | 5.487 | 4.129 |
| 3/6/08 | 8.75 | 5.442 | 4.084 |
| 3/7/08 | 8.75 | 5.429 | 4.068 |
| 3/10/08 | 8.75 | 5.413 | 4.038 |
| 3/11/08 | 8.75 | 5.445 | 4.063 |
| 3/12/08 | 8.75 | 5.399 | 4.025 |
| 3/13/08 | 8.75 | 5.396 | 4.032 |
| 3/14/08 | 8.75 | 5.382 | 4.017 |
| 3/17/08 | 8.75 | 5.347 | 3.976 |
| 3/18/08 | 8.75 | 5.369 | 3.992 |
| 3/19/08 | 8.75 | 5.326 | 3.943 |
| 3/20/08 | 8.75 | 5.321 | 3.943 |
| 3/24/08 | 8.75 | 5.323 | 3.973 |
| 3/25/08 | 8.75 | 5.325 | 3.947 |
| 3/26/08 | 8.75 | 5.345 | 3.963 |
| 3/27/08 | 8.75 | 5.377 | 3.975 |
| 3/28/08 | 8.75 | 5.357 | 3.953 |
| 3/31/08 | 8.75 | 5.343 | 3.939 |
| 4/1/08 | 8.75 | 5.438 | 4.026 |
| 4/2/08 | 8.75 | 5.451 | 4.049 |
| 4/3/08 | 8.75 | 5.459 | 4.033 |
| 4/4/08 | 8.75 | 5.419 | 4 |
| 4/7/08 | 8.75 | 5.472 | 4.054 |
| 4/8/08 | 8.75 | 5.507 | 4.086 |
| 4/9/08 | 8.75 | 5.465 | 4.049 |
| 4/10/08 | 8.75 | 5.531 | 4.103 |
| 4/11/08 | 8.75 | 5.495 | 4.06 |
| 4/14/08 | 8.75 | 5.556 | 4.083 |
| 4/15/08 | 8.75 | 5.599 | 4.136 |
| 4/16/08 | 8.75 | 5.638 | 4.155 |
| 4/17/08 | 8.75 | 5.642 | 4.148 |
| 4/18/08 | 8.75 | 5.644 | 4.143 |
| 4/21/08 | 8.75 | 5.637 | 4.123 |
| 4/22/08 | 8.75 | 5.623 | 4.124 |
| 4/23/08 | 8.75 | 5.627 | 4.156 |
| 4/24/08 | 8.75 | 5.652 | 4.191 |
| 4/25/08 | 8.75 | 5.678 | 4.215 |
| 4/28/08 | 8.75 | 5.644 | 4.197 |
| 4/29/08 | 8.75 | 5.597 | 4.168 |
| 4/30/08 | 8.75 | 5.514 | 4.085 |
| 5/1/08 | 8.75 | 5.494 | 4.062 |
| 5/2/08 | 8.75 | 5.527 | 4.095 |
| 5/5/08 | 8.75 | 5.516 | 4.108 |
| 5/6/08 | 8.75 | 5.584 | 4.175 |
| 5/7/08 | 8.75 | 5.565 | 4.161 |
| 5/8/08 | 8.75 | 5.533 | 4.137 |
| 5/9/08 | 8.75 | 5.486 | 4.084 |
| 5/12/08 | 8.75 | 5.456 | 4.053 |
| 5/13/08 | 8.75 | 5.471 | 4.071 |
| 5/14/08 | 8.75 | 5.458 | 4.057 |
| 5/15/08 | 8.75 | 5.443 | 4.036 |
| 5/16/08 | 8.75 | 5.45 | 4.041 |
| 5/20/08 | 8.75 | 5.432 | 4.023 |
| 5/21/08 | 8.75 | 5.454 | 4.058 |
| 5/22/08 | 8.75 | 5.526 | 4.117 |
| 5/23/08 | 8.75 | 5.48 | 4.079 |
| 5/26/08 | 8.75 | 5.491 | 4.085 |
| 5/27/08 | 8.75 | 5.511 | 4.103 |
| 5/28/08 | 8.75 | 5.531 | 4.117 |
| 5/29/08 | 8.75 | 5.558 | 4.144 |
| 5/30/08 | 8.75 | 5.546 | 4.129 |
| 6/2/08 | 8.75 | 5.508 | 4.084 |
| 6/3/08 | 8.75 | 5.501 | 4.091 |
| 6/4/08 | 8.75 | 5.515 | 4.106 |
| 6/5/08 | 8.75 | 5.579 | 4.155 |
| 6/6/08 | 8.75 | 5.541 | 4.118 |
| 6/9/08 | 8.75 | 5.527 | 4.119 |
| 6/10/08 | 8.75 | 5.588 | 4.166 |
| 6/11/08 | 8.75 | 5.607 | 4.163 |
| 6/12/08 | 8.75 | 5.635 | 4.202 |
| 6/13/08 | 8.75 | 5.676 | 4.219 |
| 6/16/08 | 8.75 | 5.671 | 4.202 |
| 6/17/08 | 8.75 | 5.622 | 4.186 |
| 6/18/08 | 8.75 | 5.606 | 4.163 |
| 6/19/08 | 8.75 | 5.635 | 4.184 |
| 6/20/08 | 8.75 | 5.612 | 4.152 |
| 6/23/08 | 8.75 | 5.586 | 4.132 |
| 6/24/08 | 8.75 | 5.505 | 4.058 |
| 6/25/08 | 8.75 | 5.505 | 4.058 |
| 6/26/08 | 8.75 | 5.538 | 4.079 |
| 6/27/08 | 8.75 | 5.541 | 4.064 |
| 6/30/08 | 8.75 | 5.571 | 4.081 |
| 7/2/08 | 8.75 | 5.566 | 4.073 |
| 7/3/08 | 8.75 | 5.56 | 4.068 |
| 7/4/08 | 8.75 | 5.544 | 4.055 |
| 7/7/08 | 8.75 | 5.529 | 4.04 |
| 7/8/08 | 8.75 | 5.529 | 4.046 |
| 7/9/08 | 8.75 | 5.546 | 4.056 |
| 7/10/08 | 8.75 | 5.554 | 4.06 |
| 7/11/08 | 8.75 | 5.576 | 4.083 |
| 7/14/08 | 8.75 | 5.561 | 4.054 |
| 7/15/08 | 8.75 | 5.547 | 4.064 |
| 7/16/08 | 8.75 | 5.617 | 4.127 |
| 7/17/08 | 8.75 | 5.64 | 4.144 |
| 7/18/08 | 8.75 | 5.65 | 4.155 |
| 7/21/08 | 8.75 | 5.652 | 4.151 |
| 7/22/08 | 8.75 | 5.663 | 4.167 |
| 7/23/08 | 8.75 | 5.657 | 4.166 |
| 7/24/08 | 8.75 | 5.63 | 4.131 |
| 7/25/08 | 8.75 | 5.642 | 4.161 |
| 7/28/08 | 8.75 | 5.611 | 4.126 |
| 7/29/08 | 8.75 | 5.611 | 4.139 |
| 7/30/08 | 8.75 | 5.63 | 4.168 |
| 7/31/08 | 8.75 | 5.581 | 4.097 |
| 8/1/08 | 8.75 | 5.567 | 4.072 |
| 8/5/08 | 8.75 | 5.585 | 4.103 |
| 8/6/08 | 8.75 | 5.598 | 4.116 |
| 8/7/08 | 8.75 | 5.553 | 4.072 |
| 8/8/08 | 8.75 | 5.542 | 4.053 |
| 8/11/08 | 8.75 | 5.556 | 4.052 |
| 8/12/08 | 8.75 | 5.54 | 4.031 |
| 8/13/08 | 8.75 | 5.548 | 4.032 |
| 8/14/08 | 8.75 | 5.536 | 4.017 |
| 8/15/08 | 8.75 | 5.531 | 4.003 |
| 8/18/08 | 8.75 | 5.514 | 3.988 |
| 8/19/08 | 8.75 | 5.542 | 4.019 |
| 8/20/08 | 8.75 | 5.598 | 4.034 |
| 8/21/08 | 8.75 | 5.632 | 4.045 |
| 8/22/08 | 8.75 | 5.655 | 4.054 |
| 8/25/08 | 8.75 | 5.61 | 4.028 |
| 8/26/08 | 8.75 | 5.606 | 4.008 |
| 8/27/08 | 8.75 | 5.645 | 4.01 |
| 8/28/08 | 8.75 | 5.633 | 4.001 |
| 8/29/08 | 8.75 | 5.666 | 4.017 |
| 9/2/08 | 8.75 | 5.649 | 3.995 |
| 9/3/08 | 8.75 | 5.679 | 3.988 |
| 9/4/08 | 8.75 | 5.666 | 3.954 |
| 9/5/08 | 8.75 | 5.662 | 3.944 |
| 9/8/08 | 8.75 | 5.678 | 3.944 |
| 9/9/08 | 8.75 | 5.672 | 3.933 |
| 9/10/08 | 8.75 | 5.662 | 3.938 |
| 9/11/08 | 8.75 | 5.703 | 3.961 |
| 9/12/08 | 8.75 | 5.795 | 4.052 |
| 9/15/08 | 8.75 | 5.644 | 3.915 |
| 9/16/08 | 8.75 | 5.718 | 3.952 |
| 9/17/08 | 8.75 | 5.75 | 3.948 |
| 9/18/08 | 8.75 | 5.867 | 4.034 |
| 9/19/08 | 8.75 | 5.96 | 4.137 |
| 9/22/08 | 8.75 | 5.932 | 4.105 |
| 9/23/08 | 8.75 | 5.982 | 4.105 |
| 9/24/08 | 8.75 | 5.991 | 4.121 |
| 9/25/08 | 8.75 | 5.995 | 4.125 |
| 9/26/08 | 8.75 | 6.042 | 4.137 |
| 9/29/08 | 8.75 | 5.929 | 4.024 |
| 9/30/08 | 8.75 | 6.177 | 4.233 |
| 10/1/08 | 8.75 | 6.133 | 4.186 |
| 10/2/08 | 8.75 | 6.093 | 4.145 |
| 10/3/08 | 8.75 | 6.055 | 4.096 |
| 10/6/08 | 8.75 | 5.967 | 3.988 |
| 10/7/08 | 8.75 | 6.06 | 4.067 |
| 10/8/08 | 8.75 | 6.139 | 4.134 |
| 10/9/08 | 8.75 | 6.224 | 4.16 |
| 10/10/08 | 8.75 | 6.318 | 4.254 |
| 10/14/08 | 8.75 | 6.417 | 4.277 |
| 10/15/08 | 8.75 | 6.383 | 4.191 |
| 10/16/08 | 8.75 | 6.423 | 4.206 |
| 10/17/08 | 8.75 | 6.51 | 4.233 |
| 10/20/08 | 8.75 | 6.56 | 4.224 |
| 10/21/08 | 8.75 | 6.532 | 4.183 |
| 10/22/08 | 8.75 | 6.474 | 4.098 |
| 10/23/08 | 8.75 | 6.463 | 4.104 |
| 10/24/08 | 8.75 | 6.496 | 4.127 |
| 10/27/08 | 8.75 | 6.527 | 4.126 |
| 10/28/08 | 8.75 | 6.64 | 4.201 |
| 10/29/08 | 8.75 | 6.72 | 4.265 |
| 10/30/08 | 8.75 | 6.717 | 4.243 |
| 10/31/08 | 8.75 | 6.763 | 4.279 |
| 11/3/08 | 8.75 | 6.751 | 4.292 |
| 11/4/08 | 8.75 | 6.736 | 4.25 |
| 11/5/08 | 8.75 | 6.758 | 4.231 |
| 11/6/08 | 8.75 | 6.772 | 4.235 |
| 11/7/08 | 8.75 | 6.771 | 4.229 |
| 11/10/08 | 8.75 | 6.851 | 4.237 |
| 11/12/08 | 8.75 | 6.789 | 4.229 |
| 11/13/08 | 8.75 | 6.894 | 4.3 |
| 11/14/08 | 8.75 | 6.823 | 4.219 |
| 11/17/08 | 8.75 | 6.82 | 4.153 |
| 11/18/08 | 8.75 | 6.804 | 4.132 |
| 11/19/08 | 8.75 | 6.761 | 4.088 |
| 11/20/08 | 8.75 | 6.636 | 3.94 |
| 11/21/08 | 8.75 | 6.792 | 4.046 |
| 11/24/08 | 8.75 | 6.8 | 4.067 |
| 11/25/08 | 8.75 | 6.698 | 3.974 |
| 11/26/08 | 8.75 | 6.717 | 3.94 |
| 11/27/08 | 8.75 | 6.746 | 3.928 |
| 11/28/08 | 8.75 | 6.746 | 3.902 |
| 12/1/08 | 8.75 | 6.618 | 3.758 |
| 12/2/08 | 8.75 | 6.615 | 3.772 |
| 12/3/08 | 8.75 | 6.718 | 3.796 |
| 12/4/08 | 8.75 | 6.712 | 3.744 |
| 12/5/08 | 8.75 | 6.74 | 3.765 |
| 12/8/08 | 8.75 | 6.792 | 3.763 |
| 12/9/08 | 8.75 | 6.723 | 3.745 |
| 12/10/08 | 8.75 | 6.699 | 3.752 |
| 12/11/08 | 8.75 | 6.673 | 3.736 |
| 12/12/08 | 8.75 | 6.684 | 3.762 |
| 12/15/08 | 8.75 | 6.692 | 3.748 |
| 12/16/08 | 8.75 | 6.615 | 3.664 |
| 12/17/08 | 8.75 | 6.491 | 3.544 |
| 12/18/08 | 8.75 | 6.442 | 3.454 |
| 12/19/08 | 8.75 | 6.508 | 3.455 |
| 12/22/08 | 8.75 | 6.497 | 3.471 |
| 12/23/08 | 8.75 | 6.493 | 3.487 |
| 12/24/08 | 8.75 | 6.486 | 3.489 |
| 12/29/08 | 8.75 | 6.386 | 3.394 |
| 12/30/08 | 8.75 | 6.425 | 3.417 |
| 12/31/08 | 8.75 | 6.471 | 3.455 |
| 1/2/09 | 9 | 6.544 | 3.548 |
| 1/5/09 | 9 | 6.636 | 3.636 |
| 1/6/09 | 9 | 6.656 | 3.649 |
| 1/7/09 | 9 | 6.708 | 3.702 |
| 1/8/09 | 9 | 6.678 | 3.672 |
| 1/9/09 | 9 | 6.649 | 3.631 |
| 1/12/09 | 9 | 6.63 | 3.601 |
| 1/13/09 | 9 | 6.58 | 3.564 |
| 1/14/09 | 9 | 6.406 | 3.432 |
| 1/15/09 | 9 | 6.444 | 3.48 |
| 1/16/09 | 9 | 6.527 | 3.547 |
| 1/19/09 | 9 | 6.608 | 3.608 |
| 1/20/09 | 9 | 6.551 | 3.556 |
| 1/21/09 | 9 | 6.632 | 3.619 |
| 1/22/09 | 9 | 6.651 | 3.622 |
| 1/23/09 | 9 | 6.668 | 3.649 |
| 1/26/09 | 9 | 6.753 | 3.716 |
| 1/27/09 | 9 | 6.698 | 3.681 |
| 1/28/09 | 9 | 6.722 | 3.714 |
| 1/29/09 | 9 | 6.791 | 3.803 |
| 1/30/09 | 9 | 6.736 | 3.768 |
| 2/2/09 | 9 | 6.654 | 3.689 |
| 2/3/09 | 9 | 6.692 | 3.754 |
| 2/4/09 | 9 | 6.692 | 3.789 |
| 2/5/09 | 9 | 6.619 | 3.726 |
| 2/6/09 | 9 | 6.705 | 3.768 |
| 2/9/09 | 9 | 6.769 | 3.802 |
| 2/10/09 | 9 | 6.713 | 3.729 |
| 2/11/09 | 9 | 6.681 | 3.69 |
| 2/12/09 | 9 | 6.623 | 3.652 |
| 2/13/09 | 9 | 6.65 | 3.672 |
| 2/17/09 | 9 | 6.529 | 3.561 |
| 2/18/09 | 9 | 6.574 | 3.583 |
| 2/19/09 | 9 | 6.65 | 3.629 |
| 2/20/09 | 9 | 6.574 | 3.594 |
| 2/23/09 | 9 | 6.562 | 3.577 |
| 2/24/09 | 9 | 6.575 | 3.601 |
| 2/25/09 | 9 | 6.664 | 3.689 |
| 2/26/09 | 9 | 6.682 | 3.707 |
| 2/27/09 | 9 | 6.672 | 3.704 |
| 3/2/09 | 9 | 6.572 | 3.618 |
| 3/3/09 | 9 | 6.604 | 3.632 |
| 3/4/09 | 9 | 6.636 | 3.672 |
| 3/5/09 | 9 | 6.524 | 3.566 |
| 3/6/09 | 9 | 6.582 | 3.613 |
| 3/9/09 | 9 | 6.612 | 3.641 |
| 3/10/09 | 9 | 6.682 | 3.703 |
| 3/11/09 | 9 | 6.631 | 3.662 |
| 3/12/09 | 9 | 6.622 | 3.638 |
| 3/13/09 | 9 | 6.578 | 3.597 |
| 3/16/09 | 9 | 6.595 | 3.609 |
| 3/17/09 | 9 | 6.6 | 3.638 |
| 3/18/09 | 9 | 6.514 | 3.538 |
| 3/19/09 | 9 | 6.544 | 3.561 |
| 3/20/09 | 9 | 6.561 | 3.599 |
| 3/23/09 | 9 | 6.563 | 3.612 |
| 3/24/09 | 9 | 6.622 | 3.686 |
| 3/25/09 | 9 | 6.671 | 3.736 |
| 3/26/09 | 9 | 6.506 | 3.647 |
| 3/27/09 | 9 | 6.522 | 3.652 |
| 3/30/09 | 9 | 6.47 | 3.594 |
| 3/31/09 | 9 | 6.429 | 3.561 |
| 4/1/09 | 9 | 6.438 | 3.554 |
| 4/2/09 | 9 | 6.475 | 3.608 |
| 4/3/09 | 9 | 6.498 | 3.666 |
| 4/6/09 | 9 | 6.54 | 3.712 |
| 4/7/09 | 9 | 6.504 | 3.67 |
| 4/8/09 | 9 | 6.467 | 3.629 |
| 4/9/09 | 9 | 6.476 | 3.649 |
| 4/13/09 | 9 | 6.468 | 3.647 |
| 4/14/09 | 9 | 6.433 | 3.637 |
| 4/15/09 | 9 | 6.433 | 3.667 |
| 4/16/09 | 9 | 6.44 | 3.702 |
| 4/17/09 | 9 | 6.474 | 3.754 |
| 4/20/09 | 9 | 6.35 | 3.655 |
| 4/21/09 | 9 | 6.372 | 3.694 |
| 4/22/09 | 9 | 6.429 | 3.731 |
| 4/23/09 | 9 | 6.453 | 3.757 |
| 4/24/09 | 9 | 6.449 | 3.763 |
| 4/27/09 | 9 | 6.436 | 3.758 |
| 4/28/09 | 9 | 6.447 | 3.793 |
| 4/29/09 | 9 | 6.467 | 3.822 |
| 4/30/09 | 9 | 6.476 | 3.841 |
| 5/1/09 | 9 | 6.44 | 3.84 |
| 5/4/09 | 9 | 6.41 | 3.854 |
| 5/5/09 | 9 | 6.389 | 3.841 |
| 5/6/09 | 9 | 6.357 | 3.866 |
| 5/7/09 | 9 | 6.398 | 3.929 |
| 5/8/09 | 9 | 6.407 | 3.927 |
| 5/11/09 | 9 | 6.322 | 3.89 |
| 5/12/09 | 9 | 6.35 | 3.906 |
| 5/13/09 | 9 | 6.227 | 3.865 |
| 5/14/09 | 9 | 6.186 | 3.855 |
| 5/15/09 | 9 | 6.188 | 3.857 |
| 5/19/09 | 9 | 6.239 | 3.9 |
| 5/20/09 | 9 | 6.201 | 3.899 |
| 5/21/09 | 9 | 6.266 | 3.982 |
| 5/22/09 | 9 | 6.238 | 3.971 |
| 5/25/09 | 9 | 6.238 | 3.976 |
| 5/26/09 | 9 | 6.355 | 4.086 |
| 5/27/09 | 9 | 6.41 | 4.187 |
| 5/28/09 | 9 | 6.256 | 4.069 |
| 5/29/09 | 9 | 6.155 | 3.994 |
| 6/1/09 | 9 | 6.184 | 4.042 |
| 6/2/09 | 9 | 6.13 | 4.012 |
| 6/3/09 | 9 | 6.029 | 3.963 |
| 6/4/09 | 9 | 6.054 | 3.997 |
| 6/5/09 | 9 | 6.026 | 3.98 |
| 6/8/09 | 9 | 5.997 | 4.002 |
| 6/9/09 | 9 | 6.026 | 4.03 |
| 6/10/09 | 9 | 6.072 | 4.105 |
| 6/11/09 | 9 | 5.944 | 4.006 |
| 6/12/09 | 9 | 5.875 | 3.946 |
| 6/15/09 | 9 | 5.833 | 3.934 |
| 6/16/09 | 9 | 5.787 | 3.9 |
| 6/17/09 | 9 | 5.772 | 3.903 |
| 6/18/09 | 9 | 5.788 | 3.97 |
| 6/19/09 | 9 | 5.791 | 3.969 |
| 6/22/09 | 9 | 5.724 | 3.907 |
| 6/23/09 | 9 | 5.648 | 3.887 |
| 6/24/09 | 9 | 5.674 | 3.909 |
| 6/25/09 | 9 | 5.671 | 3.904 |
| 6/26/09 | 9 | 5.655 | 3.896 |
| 6/29/09 | 9 | 5.641 | 3.892 |
| 6/30/09 | 9 | 5.612 | 3.862 |
| 7/2/09 | 9 | 5.608 | 3.846 |
| 7/3/09 | 9 | 5.609 | 3.848 |
| 7/6/09 | 9 | 5.617 | 3.865 |
| 7/7/09 | 9 | 5.604 | 3.857 |
| 7/8/09 | 9 | 5.576 | 3.834 |
| 7/9/09 | 9 | 5.62 | 3.873 |
| 7/10/09 | 9 | 5.596 | 3.864 |
| 7/13/09 | 9 | 5.642 | 3.904 |
| 7/14/09 | 9 | 5.725 | 3.986 |
| 7/15/09 | 9 | 5.759 | 4.025 |
| 7/16/09 | 9 | 5.684 | 3.961 |
| 7/17/09 | 9 | 5.712 | 4.013 |
| 7/20/09 | 9 | 5.619 | 3.963 |
| 7/21/09 | 9 | 5.652 | 3.973 |
| 7/22/09 | 9 | 5.667 | 4.012 |
| 7/23/09 | 9 | 5.71 | 4.05 |
| 7/24/09 | 9 | 5.71 | 4.057 |
| 7/27/09 | 9 | 5.725 | 4.071 |
| 7/28/09 | 9 | 5.682 | 4.048 |
| 7/29/09 | 9 | 5.677 | 4.049 |
| 7/30/09 | 9 | 5.673 | 4.051 |
| 7/31/09 | 9 | 5.557 | 3.954 |
| 8/4/09 | 9 | 5.572 | 4.015 |
| 8/5/09 | 9 | 5.607 | 4.062 |
| 8/6/09 | 9 | 5.543 | 4.025 |
| 8/7/09 | 9 | 5.572 | 4.074 |
| 8/10/09 | 9 | 5.542 | 4.037 |
| 8/11/09 | 9 | 5.455 | 3.982 |
| 8/12/09 | 9 | 5.468 | 3.998 |
| 8/13/09 | 9 | 5.449 | 3.979 |
| 8/14/09 | 9 | 5.414 | 3.945 |
| 8/17/09 | 9 | 5.374 | 3.89 |
| 8/18/09 | 9 | 5.342 | 3.902 |
| 8/19/09 | 9 | 5.346 | 3.899 |
| 8/20/09 | 9 | 5.341 | 3.892 |
| 8/21/09 | 9 | 5.39 | 3.952 |
| 8/24/09 | 9 | 5.355 | 3.912 |
| 8/25/09 | 9 | 5.338 | 3.902 |
| 8/26/09 | 9 | 5.337 | 3.901 |
| 8/27/09 | 9 | 5.331 | 3.895 |
| 8/28/09 | 9 | 5.329 | 3.907 |
| 8/31/09 | 9 | 5.31 | 3.891 |
| 9/1/09 | 9 | 5.287 | 3.88 |
| 9/2/09 | 9 | 5.22 | 3.859 |
| 9/3/09 | 9 | 5.245 | 3.874 |
| 9/4/09 | 9 | 5.252 | 3.893 |
| 9/8/09 | 9 | 5.343 | 3.929 |
| 9/9/09 | 9 | 5.357 | 3.944 |
| 9/10/09 | 9 | 5.291 | 3.87 |
| 9/11/09 | 9 | 5.226 | 3.862 |
| 9/14/09 | 9 | 5.264 | 3.9 |
| 9/15/09 | 9 | 5.278 | 3.897 |
| 9/16/09 | 9 | 5.306 | 3.884 |
| 9/17/09 | 9 | 5.308 | 3.875 |
| 9/18/09 | 9 | 5.368 | 3.91 |
| 9/21/09 | 9 | 5.368 | 3.929 |
| 9/22/09 | 9 | 5.373 | 3.937 |
| 9/23/09 | 9 | 5.366 | 3.931 |
| 9/24/09 | 9 | 5.345 | 3.907 |
| 9/25/09 | 9 | 5.324 | 3.884 |
| 9/28/09 | 9 | 5.304 | 3.864 |
| 9/29/09 | 9 | 5.298 | 3.862 |
| 9/30/09 | 9 | 5.279 | 3.843 |
| 10/1/09 | 9 | 5.236 | 3.813 |
| 10/2/09 | 9 | 5.262 | 3.824 |
| 10/5/09 | 9 | 5.246 | 3.807 |
| 10/6/09 | 9 | 5.286 | 3.842 |
| 10/7/09 | 9 | 5.288 | 3.841 |
| 10/8/09 | 9 | 5.337 | 3.893 |
| 10/9/09 | 9 | 5.422 | 3.965 |
| 10/13/09 | 9 | 5.403 | 3.946 |
| 10/14/09 | 9 | 5.42 | 3.982 |
| 10/15/09 | 9 | 5.436 | 4.008 |
| 10/16/09 | 9 | 5.375 | 3.952 |
| 10/19/09 | 9 | 5.395 | 3.971 |
| 10/20/09 | 9 | 5.33 | 3.929 |
| 10/21/09 | 9 | 5.327 | 3.941 |
| 10/22/09 | 9 | 5.343 | 3.948 |
| 10/23/09 | 9 | 5.358 | 3.976 |
| 10/26/09 | 9 | 5.392 | 4.016 |
| 10/27/09 | 9 | 5.378 | 3.987 |
| 10/28/09 | 9 | 5.353 | 3.961 |
| 10/29/09 | 9 | 5.394 | 3.979 |
| 10/30/09 | 9 | 5.353 | 3.924 |
| 11/2/09 | 9 | 5.372 | 3.941 |
| 11/3/09 | 9 | 5.364 | 3.941 |
| 11/4/09 | 9 | 5.386 | 3.996 |
| 11/5/09 | 9 | 5.448 | 4.039 |
| 11/6/09 | 9 | 5.442 | 4.037 |
| 11/9/09 | 9 | 5.418 | 4.022 |
| 11/10/09 | 9 | 5.405 | 4.017 |
| 11/12/09 | 9 | 5.431 | 4.032 |
| 11/13/09 | 9 | 5.394 | 3.994 |
| 11/16/09 | 9 | 5.332 | 3.93 |
| 11/17/09 | 9 | 5.324 | 3.913 |
| 11/18/09 | 9 | 5.353 | 3.951 |
| 11/19/09 | 9 | 5.34 | 3.924 |
| 11/20/09 | 9 | 5.334 | 3.93 |
| 11/23/09 | 9 | 5.365 | 3.93 |
| 11/24/09 | 9 | 5.306 | 3.856 |
| 11/25/09 | 9 | 5.297 | 3.848 |
| 11/26/09 | 9 | 5.269 | 3.82 |
| 11/27/09 | 9 | 5.299 | 3.838 |
| 11/30/09 | 9 | 5.314 | 3.841 |
| 12/1/09 | 9 | 5.339 | 3.868 |
| 12/2/09 | 9 | 5.35 | 3.882 |
| 12/3/09 | 9 | 5.338 | 3.868 |
| 12/4/09 | 9 | 5.382 | 3.917 |
| 12/7/09 | 9 | 5.373 | 3.902 |
| 12/8/09 | 9 | 5.402 | 3.928 |
| 12/9/09 | 9 | 5.457 | 3.961 |
| 12/10/09 | 9 | 5.494 | 3.997 |
| 12/11/09 | 9 | 5.493 | 4.001 |
| 12/14/09 | 9 | 5.503 | 4.01 |
| 12/15/09 | 9 | 5.502 | 4.008 |
| 12/16/09 | 9 | 5.473 | 3.992 |
| 12/17/09 | 9 | 5.476 | 3.971 |
| 12/18/09 | 9 | 5.507 | 4.009 |
| 12/21/09 | 9 | 5.592 | 4.084 |
| 12/22/09 | 9 | 5.598 | 4.128 |
| 12/23/09 | 9 | 5.59 | 4.073 |
| 12/24/09 | 9 | 5.59 | 4.084 |
| 12/29/09 | 9 | 5.605 | 4.101 |
| 12/30/09 | 9 | 5.619 | 4.079 |
| 12/31/09 | 9 | 5.594 | 4.079 |
| 1/4/10 | 9 | 5.61 | 4.098 |
| 1/5/10 | 9 | 5.568 | 4.08 |
| 1/6/10 | 9 | 5.597 | 4.139 |
| 1/7/10 | 9 | 5.616 | 4.153 |
| 1/8/10 | 9 | 5.565 | 4.121 |
| 1/11/10 | 9 | 5.55 | 4.136 |
| 1/12/10 | 9 | 5.503 | 4.097 |
| 1/13/10 | 9 | 5.531 | 4.142 |
| 1/14/10 | 9 | 5.474 | 4.094 |
| 1/15/10 | 9 | 5.407 | 4.056 |
| 1/18/10 | 9 | 5.39 | 4.039 |
| 1/19/10 | 9 | 5.41 | 4.046 |
| 1/20/10 | 9 | 5.406 | 4.015 |
| 1/21/10 | 9 | 5.372 | 4 |
| 1/22/10 | 9 | 5.376 | 3.998 |
| 1/25/10 | 9 | 5.374 | 4.004 |
| 1/26/10 | 9 | 5.351 | 3.973 |
| 1/27/10 | 9 | 5.34 | 3.96 |
| 1/28/10 | 9 | 5.317 | 3.941 |
| 1/29/10 | 9 | 5.337 | 3.948 |
| 2/1/10 | 9 | 5.371 | 3.981 |
| 2/2/10 | 9 | 5.38 | 3.99 |
| 2/3/10 | 9 | 5.419 | 4.042 |
| 2/4/10 | 9 | 5.366 | 3.996 |
| 2/5/10 | 9 | 5.367 | 4.001 |
| 2/8/10 | 9 | 5.394 | 3.991 |
| 2/9/10 | 9 | 5.422 | 4.01 |
| 2/10/10 | 9 | 5.43 | 4.04 |
| 2/11/10 | 9 | 5.464 | 4.06 |
| 2/12/10 | 9 | 5.472 | 4.065 |
| 2/16/10 | 9 | 5.473 | 4.065 |
| 2/17/10 | 9 | 5.478 | 4.083 |
| 2/18/10 | 9 | 5.464 | 4.08 |
| 2/19/10 | 9 | 5.47 | 4.078 |
| 2/22/10 | 9 | 5.483 | 4.09 |
| 2/23/10 | 9 | 5.429 | 4.032 |
| 2/24/10 | 9 | 5.421 | 4.051 |
| 2/25/10 | 9 | 5.414 | 4.028 |
| 2/26/10 | 9 | 5.391 | 4.017 |
| 3/1/10 | 9 | 5.393 | 4.021 |
| 3/2/10 | 9 | 5.378 | 4.002 |
| 3/3/10 | 9 | 5.387 | 4.012 |
| 3/4/10 | 9 | 5.392 | 4.012 |
| 3/5/10 | 9 | 5.443 | 4.061 |
| 3/8/10 | 9 | 5.469 | 4.097 |
| 3/9/10 | 9 | 5.48 | 4.113 |
| 3/10/10 | 9 | 5.491 | 4.125 |
| 3/11/10 | 9 | 5.419 | 4.082 |
| 3/12/10 | 9 | 5.46 | 4.091 |
| 3/15/10 | 9 | 5.401 | 4.067 |
| 3/16/10 | 9 | 5.333 | 4.023 |
| 3/17/10 | 9 | 5.355 | 4.045 |
| 3/18/10 | 9 | 5.33 | 4.022 |
| 3/19/10 | 9 | 5.369 | 4.05 |
| 3/22/10 | 9 | 5.319 | 4.033 |
| 3/23/10 | 9 | 5.332 | 4.031 |
| 3/24/10 | 9 | 5.392 | 4.091 |
| 3/25/10 | 9 | 5.369 | 4.092 |
| 3/26/10 | 9 | 5.359 | 4.089 |
| 3/29/10 | 9 | 5.393 | 4.102 |
| 3/30/10 | 9 | 5.388 | 4.1 |
| 3/31/10 | 9 | 5.367 | 4.067 |
| 4/1/10 | 9 | 5.306 | 4.053 |
| 4/5/10 | 9 | 5.414 | 4.119 |
| 4/6/10 | 9 | 5.404 | 4.117 |
| 4/7/10 | 9 | 5.349 | 4.068 |
| 4/8/10 | 9 | 5.391 | 4.1 |
| 4/9/10 | 9 | 5.343 | 4.065 |
| 4/12/10 | 9 | 5.335 | 4.062 |
| 4/13/10 | 9 | 5.36 | 4.079 |
| 4/14/10 | 9 | 5.36 | 4.107 |
| 4/15/10 | 9 | 5.372 | 4.105 |
| 4/16/10 | 9 | 5.333 | 4.088 |
| 4/19/10 | 9 | 5.361 | 4.067 |
| 4/20/10 | 9 | 5.392 | 4.075 |
| 4/21/10 | 9 | 5.345 | 4.068 |
| 4/22/10 | 9 | 5.344 | 4.084 |
| 4/23/10 | 9 | 5.339 | 4.073 |
| 4/26/10 | 9 | 5.349 | 4.065 |
| 4/27/10 | 9 | 5.317 | 4.017 |
| 4/28/10 | 9 | 5.394 | 4.048 |
| 4/29/10 | 9 | 5.362 | 4.049 |
| 4/30/10 | 9 | 5.285 | 4.011 |
| 5/3/10 | 9 | 5.295 | 4.001 |
| 5/4/10 | 9 | 5.274 | 3.95 |
| 5/5/10 | 9 | 5.254 | 3.935 |
| 5/6/10 | 9 | 5.222 | 3.882 |
| 5/7/10 | 9 | 5.268 | 3.885 |
| 5/10/10 | 9 | 5.354 | 3.935 |
| 5/11/10 | 9 | 5.363 | 3.934 |
| 5/12/10 | 9 | 5.364 | 3.945 |
| 5/13/10 | 9 | 5.3 | 3.867 |
| 5/14/10 | 9 | 5.291 | 3.818 |
| 5/17/10 | 9 | 5.324 | 3.891 |
| 5/18/10 | 9 | 5.235 | 3.818 |
| 5/19/10 | 9 | 5.305 | 3.817 |
| 5/20/10 | 9 | 5.237 | 3.746 |
| 5/21/10 | 9 | 5.288 | 3.768 |
| 5/25/10 | 9 | 5.219 | 3.694 |
| 5/26/10 | 9 | 5.278 | 3.686 |
| 5/27/10 | 9 | 5.374 | 3.755 |
| 5/28/10 | 9 | 5.296 | 3.711 |
| 5/31/10 | 9 | 5.358 | 3.725 |
| 6/1/10 | 9 | 5.314 | 3.698 |
| 6/2/10 | 9 | 5.37 | 3.779 |
| 6/3/10 | 9 | 5.374 | 3.783 |
| 6/4/10 | 9 | 5.3 | 3.717 |
| 6/7/10 | 9 | 5.304 | 3.719 |
| 6/8/10 | 9 | 5.312 | 3.729 |
| 6/9/10 | 9 | 5.348 | 3.761 |
| 6/10/10 | 9 | 5.398 | 3.825 |
| 6/11/10 | 9 | 5.386 | 3.81 |
| 6/14/10 | 9 | 5.424 | 3.839 |
| 6/15/10 | 9 | 5.404 | 3.828 |
| 6/16/10 | 9 | 5.352 | 3.793 |
| 6/17/10 | 9 | 5.322 | 3.747 |
| 6/18/10 | 9 | 5.326 | 3.761 |
| 6/21/10 | 9 | 5.333 | 3.767 |
| 6/22/10 | 9 | 5.279 | 3.709 |
| 6/23/10 | 9 | 5.267 | 3.698 |
| 6/24/10 | 9 | 5.236 | 3.698 |
| 6/25/10 | 9 | 5.198 | 3.686 |
| 6/28/10 | 9 | 5.212 | 3.683 |
| 6/29/10 | 9 | 5.192 | 3.655 |
| 6/30/10 | 9 | 5.184 | 3.647 |
| 7/2/10 | 9 | 5.19 | 3.647 |
| 7/5/10 | 9 | 5.169 | 3.63 |
| 7/6/10 | 9 | 5.182 | 3.64 |
| 7/7/10 | 9 | 5.257 | 3.697 |
| 7/8/10 | 9 | 5.215 | 3.727 |
| 7/9/10 | 9 | 5.244 | 3.752 |
| 7/12/10 | 9 | 5.218 | 3.744 |
| 7/13/10 | 9 | 5.254 | 3.78 |
| 7/14/10 | 9 | 5.254 | 3.788 |
| 7/15/10 | 9 | 5.258 | 3.772 |
| 7/16/10 | 9 | 5.185 | 3.725 |
| 7/19/10 | 9 | 5.202 | 3.737 |
| 7/20/10 | 9 | 5.241 | 3.767 |
| 7/21/10 | 9 | 5.193 | 3.733 |
| 7/22/10 | 9 | 5.278 | 3.771 |
| 7/23/10 | 9 | 5.273 | 3.781 |
| 7/26/10 | 9 | 5.264 | 3.775 |
| 7/27/10 | 9 | 5.298 | 3.798 |
| 7/28/10 | 9 | 5.257 | 3.778 |
| 7/29/10 | 9 | 5.258 | 3.757 |
| 7/30/10 | 9 | 5.19 | 3.698 |
| 8/3/10 | 9 | 5.191 | 3.689 |
| 8/4/10 | 9 | 5.188 | 3.718 |
| 8/5/10 | 9 | 5.129 | 3.67 |
| 8/6/10 | 9 | 5.136 | 3.651 |
| 8/9/10 | 9 | 5.123 | 3.653 |
| 8/10/10 | 9 | 5.11 | 3.636 |
| 8/11/10 | 9 | 5.092 | 3.606 |
| 8/12/10 | 9 | 5.118 | 3.632 |
| 8/13/10 | 9 | 5.074 | 3.602 |
| 8/16/10 | 9 | 5.035 | 3.549 |
| 8/17/10 | 9 | 5.063 | 3.569 |
| 8/18/10 | 9 | 5.04 | 3.546 |
| 8/19/10 | 9 | 5.013 | 3.52 |
| 8/20/10 | 9 | 5.011 | 3.525 |
| 8/23/10 | 9 | 5.009 | 3.532 |
| 8/24/10 | 9 | 5.012 | 3.506 |
| 8/25/10 | 9 | 4.98 | 3.474 |
| 8/26/10 | 9 | 4.931 | 3.432 |
| 8/27/10 | 9 | 5.023 | 3.494 |
| 8/30/10 | 9 | 4.945 | 3.435 |
| 8/31/10 | 9 | 4.983 | 3.433 |
| 9/1/10 | 9 | 5.058 | 3.502 |
| 9/2/10 | 9 | 5.093 | 3.518 |
| 9/3/10 | 9 | 5.113 | 3.569 |
| 9/7/10 | 9 | 4.999 | 3.467 |
| 9/8/10 | 9 | 5.107 | 3.53 |
| 9/9/10 | 9 | 5.075 | 3.552 |
| 9/10/10 | 9 | 5.08 | 3.556 |
| 9/13/10 | 9 | 5.072 | 3.536 |
| 9/14/10 | 9 | 5.09 | 3.529 |
| 9/15/10 | 9 | 5.073 | 3.54 |
| 9/16/10 | 9 | 5.072 | 3.549 |
| 9/17/10 | 9 | 5.039 | 3.506 |
| 9/20/10 | 9 | 5.053 | 3.505 |
| 9/21/10 | 9 | 5.029 | 3.481 |
| 9/22/10 | 9 | 4.962 | 3.433 |
| 9/23/10 | 9 | 4.952 | 3.414 |
| 9/24/10 | 9 | 4.948 | 3.427 |
| 9/27/10 | 9 | 4.878 | 3.386 |
| 9/28/10 | 9 | 4.883 | 3.333 |
| 9/29/10 | 9 | 4.871 | 3.332 |
| 9/30/10 | 9 | 4.861 | 3.357 |
| 10/1/10 | 9 | 4.864 | 3.39 |
| 10/4/10 | 9 | 4.845 | 3.368 |
| 10/5/10 | 9 | 4.906 | 3.386 |
| 10/6/10 | 9 | 4.855 | 3.377 |
| 10/7/10 | 9 | 4.922 | 3.42 |
| 10/8/10 | 9 | 4.887 | 3.403 |
| 10/12/10 | 9 | 4.972 | 3.433 |
| 10/13/10 | 9 | 4.963 | 3.44 |
| 10/14/10 | 9 | 4.982 | 3.453 |
| 10/15/10 | 9 | 5.001 | 3.492 |
| 10/18/10 | 9 | 4.967 | 3.483 |
| 10/19/10 | 9 | 4.962 | 3.449 |
| 10/20/10 | 9 | 4.976 | 3.464 |
| 10/21/10 | 9 | 4.921 | 3.449 |
| 10/22/10 | 9 | 4.93 | 3.442 |
| 10/25/10 | 9 | 4.922 | 3.426 |
| 10/26/10 | 9 | 4.945 | 3.458 |
| 10/27/10 | 9 | 4.975 | 3.5 |
| 10/28/10 | 9 | 4.95 | 3.485 |
| 10/29/10 | 9 | 4.933 | 3.446 |
| 11/1/10 | 9 | 4.97 | 3.474 |
| 11/2/10 | 9 | 4.916 | 3.484 |
| 11/3/10 | 9 | 4.941 | 3.497 |
| 11/4/10 | 9 | 4.916 | 3.476 |
| 11/5/10 | 9 | 4.953 | 3.487 |
| 11/8/10 | 9 | 4.936 | 3.505 |
| 11/9/10 | 9 | 4.97 | 3.573 |
| 11/10/10 | 9 | 4.939 | 3.592 |
| 11/12/10 | 9 | 4.971 | 3.627 |
| 11/15/10 | 9 | 5.082 | 3.727 |
| 11/16/10 | 9 | 5.02 | 3.679 |
| 11/17/10 | 9 | 5.024 | 3.672 |
| 11/18/10 | 9 | 5.042 | 3.666 |
| 11/19/10 | 9 | 5.032 | 3.616 |
| 11/22/10 | 9 | 5.001 | 3.586 |
| 11/23/10 | 9 | 5.044 | 3.597 |
| 11/24/10 | 9 | 5.048 | 3.647 |
| 11/25/10 | 9 | 5.035 | 3.635 |
| 11/26/10 | 9 | 5.019 | 3.572 |
| 11/29/10 | 9 | 4.98 | 3.523 |
| 11/30/10 | 9 | 4.952 | 3.483 |
| 12/1/10 | 9 | 5.029 | 3.578 |
| 12/2/10 | 9 | 5.026 | 3.607 |
| 12/3/10 | 9 | 5.049 | 3.636 |
| 12/6/10 | 9 | 5.016 | 3.602 |
| 12/7/10 | 9 | 5.081 | 3.677 |
| 12/8/10 | 9 | 5.083 | 3.681 |
| 12/9/10 | 9 | 5.101 | 3.689 |
| 12/10/10 | 9 | 5.128 | 3.717 |
| 12/13/10 | 9 | 5.075 | 3.662 |
| 12/14/10 | 9 | 5.182 | 3.758 |
| 12/15/10 | 9 | 5.146 | 3.745 |
| 12/16/10 | 9 | 5.108 | 3.68 |
| 12/17/10 | 9 | 5.038 | 3.607 |
| 12/20/10 | 9 | 5.016 | 3.585 |
| 12/21/10 | 9 | 4.979 | 3.556 |
| 12/22/10 | 9 | 4.992 | 3.567 |
| 12/23/10 | 9 | 4.985 | 3.568 |
| 12/24/10 | 9 | 4.976 | 3.559 |
| 12/29/10 | 9 | 4.961 | 3.544 |
| 12/30/10 | 9 | 4.97 | 3.548 |
| 12/31/10 | 9 | 4.961 | 3.528 |
| 1/4/11 | 8.75 | 4.992 | 3.576 |
| 1/5/11 | 8.75 | 5.054 | 3.662 |
| 1/6/11 | 8.75 | 5.035 | 3.642 |
| 1/7/11 | 8.75 | 5.008 | 3.616 |
| 1/10/11 | 8.75 | 4.994 | 3.601 |
| 1/11/11 | 8.75 | 5.037 | 3.645 |
| 1/12/11 | 8.75 | 5.056 | 3.682 |
| 1/13/11 | 8.75 | 5.054 | 3.668 |
| 1/14/11 | 8.75 | 5.086 | 3.692 |
| 1/17/11 | 8.75 | 5.074 | 3.687 |
| 1/18/11 | 8.75 | 5.1 | 3.708 |
| 1/19/11 | 8.75 | 5.071 | 3.69 |
| 1/20/11 | 8.75 | 5.138 | 3.743 |
| 1/21/11 | 8.75 | 5.12 | 3.745 |
| 1/24/11 | 8.75 | 5.137 | 3.752 |
| 1/25/11 | 8.75 | 5.122 | 3.729 |
| 1/26/11 | 8.75 | 5.145 | 3.757 |
| 1/27/11 | 8.75 | 5.105 | 3.726 |
| 1/28/11 | 8.75 | 5.105 | 3.709 |
| 1/31/11 | 8.75 | 5.125 | 3.729 |
| 2/1/11 | 8.75 | 5.163 | 3.768 |
| 2/2/11 | 8.75 | 5.166 | 3.788 |
| 2/3/11 | 8.75 | 5.188 | 3.804 |
| 2/4/11 | 8.75 | 5.202 | 3.821 |
| 2/7/11 | 8.75 | 5.175 | 3.804 |
| 2/8/11 | 8.75 | 5.238 | 3.848 |
| 2/9/11 | 8.75 | 5.161 | 3.812 |
| 2/10/11 | 8.75 | 5.19 | 3.836 |
| 2/11/11 | 8.75 | 5.173 | 3.829 |
| 2/14/11 | 8.75 | 5.188 | 3.844 |
| 2/15/11 | 8.75 | 5.178 | 3.839 |
| 2/16/11 | 8.75 | 5.196 | 3.856 |
| 2/17/11 | 8.75 | 5.19 | 3.859 |
| 2/18/11 | 8.75 | 5.18 | 3.856 |
| 2/22/11 | 8.75 | 5.116 | 3.787 |
| 2/23/11 | 8.75 | 5.079 | 3.752 |
| 2/24/11 | 8.75 | 5.058 | 3.728 |
| 2/25/11 | 8.75 | 5.038 | 3.704 |
| 2/28/11 | 8.75 | 5.031 | 3.699 |
| 3/1/11 | 8.75 | 5.023 | 3.704 |
| 3/2/11 | 8.75 | 5.074 | 3.748 |
| 3/3/11 | 8.75 | 5.115 | 3.8 |
| 3/4/11 | 8.75 | 5.085 | 3.773 |
| 3/7/11 | 8.75 | 5.134 | 3.795 |
| 3/8/11 | 8.75 | 5.198 | 3.846 |
| 3/9/11 | 8.75 | 5.131 | 3.79 |
| 3/10/11 | 8.75 | 5.1 | 3.741 |
| 3/11/11 | 8.75 | 5.134 | 3.754 |
| 3/14/11 | 8.75 | 5.107 | 3.738 |
| 3/15/11 | 8.75 | 5.095 | 3.719 |
| 3/16/11 | 8.75 | 5.057 | 3.677 |
| 3/17/11 | 8.75 | 5.103 | 3.718 |
| 3/18/11 | 8.75 | 5.084 | 3.711 |
| 3/21/11 | 8.75 | 5.108 | 3.734 |
| 3/22/11 | 8.75 | 5.062 | 3.699 |
| 3/23/11 | 8.75 | 5.077 | 3.699 |
| 3/24/11 | 8.75 | 5.086 | 3.699 |
| 3/25/11 | 8.75 | 5.087 | 3.703 |
| 3/28/11 | 8.75 | 5.106 | 3.708 |
| 3/29/11 | 8.75 | 5.133 | 3.749 |
| 3/30/11 | 8.75 | 5.109 | 3.721 |
| 3/31/11 | 8.75 | 5.158 | 3.756 |
| 4/1/11 | 8.75 | 5.153 | 3.774 |
| 4/4/11 | 8.75 | 5.159 | 3.767 |
| 4/5/11 | 8.75 | 5.152 | 3.77 |
| 4/6/11 | 8.75 | 5.203 | 3.82 |
| 4/7/11 | 8.75 | 5.231 | 3.845 |
| 4/8/11 | 8.75 | 5.242 | 3.844 |
| 4/11/11 | 8.75 | 5.266 | 3.87 |
| 4/12/11 | 8.75 | 5.212 | 3.82 |
| 4/13/11 | 8.75 | 5.196 | 3.787 |
| 4/14/11 | 8.75 | 5.186 | 3.779 |
| 4/15/11 | 8.75 | 5.13 | 3.726 |
| 4/18/11 | 8.75 | 5.096 | 3.688 |
| 4/19/11 | 8.75 | 5.109 | 3.713 |
| 4/20/11 | 8.75 | 5.169 | 3.768 |
| 4/21/11 | 8.75 | 5.146 | 3.738 |
| 4/25/11 | 8.75 | 5.12 | 3.708 |
| 4/26/11 | 8.75 | 5.087 | 3.679 |
| 4/27/11 | 8.75 | 5.155 | 3.741 |
| 4/28/11 | 8.75 | 5.124 | 3.708 |
| 4/29/11 | 8.75 | 5.116 | 3.689 |
| 5/2/11 | 8.75 | 5.115 | 3.689 |
| 5/3/11 | 8.75 | 5.05 | 3.636 |
| 5/4/11 | 8.75 | 5.021 | 3.598 |
| 5/5/11 | 8.75 | 4.997 | 3.565 |
| 5/6/11 | 8.75 | 5.027 | 3.583 |
| 5/9/11 | 8.75 | 5.035 | 3.589 |
| 5/10/11 | 8.75 | 5.081 | 3.645 |
| 5/11/11 | 8.75 | 5.031 | 3.619 |
| 5/12/11 | 8.75 | 5.048 | 3.626 |
| 5/13/11 | 8.75 | 5.016 | 3.589 |
| 5/16/11 | 8.75 | 5.017 | 3.579 |
| 5/17/11 | 8.75 | 4.99 | 3.563 |
| 5/18/11 | 8.75 | 5.045 | 3.609 |
| 5/19/11 | 8.75 | 5.027 | 3.595 |
| 5/20/11 | 8.75 | 5.002 | 3.564 |
| 5/24/11 | 8.75 | 4.994 | 3.525 |
| 5/25/11 | 8.75 | 4.943 | 3.504 |
| 5/26/11 | 8.75 | 4.916 | 3.483 |
| 5/27/11 | 8.75 | 4.924 | 3.501 |
| 5/30/11 | 8.75 | 4.92 | 3.496 |
| 5/31/11 | 8.75 | 4.935 | 3.494 |
| 6/1/11 | 8.75 | 4.884 | 3.457 |
| 6/2/11 | 8.75 | 4.934 | 3.496 |
| 6/3/11 | 8.75 | 4.924 | 3.476 |
| 6/6/11 | 8.75 | 4.947 | 3.495 |
| 6/7/11 | 8.75 | 4.978 | 3.52 |
| 6/8/11 | 8.75 | 4.933 | 3.492 |
| 6/9/11 | 8.75 | 4.976 | 3.518 |
| 6/10/11 | 8.75 | 4.942 | 3.479 |
| 6/13/11 | 8.75 | 4.925 | 3.462 |
| 6/14/11 | 8.75 | 4.962 | 3.509 |
| 6/15/11 | 8.75 | 4.87 | 3.423 |
| 6/16/11 | 8.75 | 4.847 | 3.391 |
| 6/17/11 | 8.75 | 4.854 | 3.398 |
| 6/20/11 | 8.75 | 4.873 | 3.418 |
| 6/21/11 | 8.75 | 4.885 | 3.424 |
| 6/22/11 | 8.75 | 4.874 | 3.418 |
| 6/23/11 | 8.75 | 4.833 | 3.375 |
| 6/24/11 | 8.75 | 4.832 | 3.366 |
| 6/27/11 | 8.75 | 4.886 | 3.419 |
| 6/28/11 | 8.75 | 4.905 | 3.468 |
| 6/29/11 | 8.75 | 4.993 | 3.534 |
| 6/30/11 | 8.75 | 4.992 | 3.547 |
| 7/4/11 | 8.75 | 4.962 | 3.529 |
| 7/5/11 | 8.75 | 4.976 | 3.518 |
| 7/6/11 | 8.75 | 4.944 | 3.502 |
| 7/7/11 | 8.75 | 4.928 | 3.493 |
| 7/8/11 | 8.75 | 4.866 | 3.416 |
| 7/11/11 | 8.75 | 4.804 | 3.363 |
| 7/12/11 | 8.75 | 4.801 | 3.357 |
| 7/13/11 | 8.75 | 4.821 | 3.38 |
| 7/14/11 | 8.75 | 4.841 | 3.401 |
| 7/15/11 | 8.75 | 4.792 | 3.347 |
| 7/18/11 | 8.75 | 4.798 | 3.359 |
| 7/19/11 | 8.75 | 4.783 | 3.348 |
| 7/20/11 | 8.75 | 4.818 | 3.391 |
| 7/21/11 | 8.75 | 4.87 | 3.441 |
| 7/22/11 | 8.75 | 4.821 | 3.39 |
| 7/25/11 | 8.75 | 4.83 | 3.397 |
| 7/26/11 | 8.75 | 4.801 | 3.369 |
| 7/27/11 | 8.75 | 4.774 | 3.352 |
| 7/28/11 | 8.75 | 4.774 | 3.347 |
| 7/29/11 | 8.75 | 4.703 | 3.289 |
| 8/2/11 | 8.75 | 4.594 | 3.168 |
| 8/3/11 | 8.75 | 4.6 | 3.189 |
| 8/4/11 | 8.75 | 4.504 | 3.091 |
| 8/5/11 | 8.75 | 4.664 | 3.221 |
| 8/8/11 | 8.75 | 4.573 | 3.128 |
| 8/9/11 | 8.75 | 4.546 | 3.08 |
| 8/10/11 | 8.75 | 4.465 | 2.982 |
| 8/11/11 | 8.75 | 4.566 | 3.076 |
| 8/12/11 | 8.75 | 4.607 | 3.093 |
| 8/15/11 | 8.75 | 4.653 | 3.137 |
| 8/16/11 | 8.75 | 4.634 | 3.115 |
| 8/17/11 | 8.75 | 4.578 | 3.05 |
| 8/18/11 | 8.75 | 4.493 | 2.959 |
| 8/19/11 | 8.75 | 4.501 | 2.96 |
| 8/22/11 | 8.75 | 4.498 | 2.952 |
| 8/23/11 | 8.75 | 4.554 | 3.018 |
| 8/24/11 | 8.75 | 4.614 | 3.084 |
| 8/25/11 | 8.75 | 4.593 | 3.041 |
| 8/26/11 | 8.75 | 4.565 | 3.011 |
| 8/29/11 | 8.75 | 4.628 | 3.061 |
| 8/30/11 | 8.75 | 4.592 | 3.019 |
| 8/31/11 | 8.75 | 4.689 | 3.106 |
| 9/1/11 | 8.75 | 4.616 | 3.039 |
| 9/2/11 | 8.75 | 4.554 | 2.963 |
| 9/6/11 | 8.75 | 4.51 | 2.917 |
| 9/7/11 | 8.75 | 4.54 | 2.947 |
| 9/8/11 | 8.75 | 4.5 | 2.891 |
| 9/9/11 | 8.75 | 4.411 | 2.809 |
| 9/12/11 | 8.75 | 4.395 | 2.813 |
| 9/13/11 | 8.75 | 4.428 | 2.84 |
| 9/14/11 | 8.75 | 4.436 | 2.852 |
| 9/15/11 | 8.75 | 4.546 | 2.919 |
| 9/16/11 | 8.75 | 4.536 | 2.928 |
| 9/19/11 | 8.75 | 4.458 | 2.869 |
| 9/20/11 | 8.75 | 4.444 | 2.862 |
| 9/21/11 | 8.75 | 4.373 | 2.766 |
| 9/22/11 | 8.75 | 4.319 | 2.681 |
| 9/23/11 | 8.75 | 4.282 | 2.706 |
| 9/26/11 | 8.75 | 4.374 | 2.771 |
| 9/27/11 | 8.75 | 4.432 | 2.825 |
| 9/28/11 | 8.75 | 4.475 | 2.829 |
| 9/29/11 | 8.75 | 4.509 | 2.842 |
| 9/30/11 | 8.75 | 4.414 | 2.772 |
| 10/3/11 | 8.75 | 4.323 | 2.691 |
| 10/4/11 | 8.75 | 4.341 | 2.706 |
| 10/5/11 | 8.75 | 4.371 | 2.734 |
| 10/6/11 | 8.75 | 4.467 | 2.801 |
| 10/7/11 | 8.75 | 4.48 | 2.82 |
| 10/11/11 | 8.75 | 4.534 | 2.872 |
| 10/12/11 | 8.75 | 4.609 | 2.946 |
| 10/13/11 | 8.75 | 4.571 | 2.892 |
| 10/14/11 | 8.75 | 4.604 | 2.972 |
| 10/17/11 | 8.75 | 4.469 | 2.883 |
| 10/18/11 | 8.75 | 4.504 | 2.909 |
| 10/19/11 | 8.75 | 4.538 | 2.939 |
| 10/20/11 | 8.75 | 4.529 | 2.937 |
| 10/21/11 | 8.75 | 4.576 | 2.984 |
| 10/24/11 | 8.75 | 4.586 | 2.994 |
| 10/25/11 | 8.75 | 4.533 | 2.924 |
| 10/26/11 | 8.75 | 4.644 | 3.029 |
| 10/27/11 | 8.75 | 4.769 | 3.138 |
| 10/28/11 | 8.75 | 4.655 | 3.059 |
| 10/31/11 | 8.75 | 4.506 | 2.926 |
| 11/1/11 | 8.75 | 4.389 | 2.793 |
| 11/2/11 | 8.75 | 4.382 | 2.812 |
| 11/3/11 | 8.75 | 4.446 | 2.858 |
| 11/4/11 | 8.75 | 4.418 | 2.827 |
| 11/7/11 | 8.75 | 4.404 | 2.814 |
| 11/8/11 | 8.75 | 4.393 | 2.809 |
| 11/9/11 | 8.75 | 4.326 | 2.723 |
| 11/10/11 | 8.75 | 4.336 | 2.75 |
| 11/14/11 | 8.75 | 4.333 | 2.746 |
| 11/15/11 | 8.75 | 4.317 | 2.754 |
| 11/16/11 | 8.75 | 4.302 | 2.722 |
| 11/17/11 | 8.75 | 4.295 | 2.713 |
| 11/18/11 | 8.75 | 4.317 | 2.741 |
| 11/21/11 | 8.75 | 4.304 | 2.718 |
| 11/22/11 | 8.75 | 4.262 | 2.676 |
| 11/23/11 | 8.75 | 4.228 | 2.629 |
| 11/24/11 | 8.75 | 4.229 | 2.63 |
| 11/25/11 | 8.75 | 4.261 | 2.644 |
| 11/28/11 | 8.75 | 4.296 | 2.673 |
| 11/29/11 | 8.75 | 4.294 | 2.671 |
| 11/30/11 | 8.75 | 4.294 | 2.692 |
| 12/1/11 | 8.75 | 4.327 | 2.696 |
| 12/2/11 | 8.75 | 4.294 | 2.677 |
| 12/5/11 | 8.75 | 4.273 | 2.653 |
| 12/6/11 | 8.75 | 4.298 | 2.683 |
| 12/7/11 | 8.75 | 4.223 | 2.624 |
| 12/8/11 | 8.75 | 4.177 | 2.582 |
| 12/9/11 | 8.75 | 4.239 | 2.658 |
| 12/12/11 | 8.75 | 4.206 | 2.618 |
| 12/13/11 | 8.75 | 4.159 | 2.567 |
| 12/14/11 | 8.75 | 4.136 | 2.537 |
| 12/15/11 | 8.75 | 4.127 | 2.528 |
| 12/16/11 | 8.75 | 4.103 | 2.454 |
| 12/19/11 | 8.75 | 4.037 | 2.413 |
| 12/20/11 | 8.75 | 4.007 | 2.465 |
| 12/21/11 | 8.75 | 4.072 | 2.494 |
| 12/22/11 | 8.75 | 4.054 | 2.498 |
| 12/23/11 | 8.75 | 4.117 | 2.546 |
| 12/28/11 | 8.75 | 4.106 | 2.503 |
| 12/29/11 | 8.75 | 4.053 | 2.497 |
| 12/30/11 | 8.75 | 4.052 | 2.494 |
| 1/3/12 | 8.75 | 4.107 | 2.553 |
| 1/4/12 | 8.75 | 4.125 | 2.574 |
| 1/5/12 | 8.75 | 4.098 | 2.547 |
| 1/6/12 | 8.75 | 4.09 | 2.52 |
| 1/9/12 | 8.75 | 4.04 | 2.52 |
| 1/10/12 | 8.75 | 4.035 | 2.546 |
| 1/11/12 | 8.75 | 4.017 | 2.503 |
| 1/12/12 | 8.75 | 4.008 | 2.55 |
| 1/13/12 | 8.75 | 3.997 | 2.507 |
| 1/16/12 | 8.75 | 3.994 | 2.511 |
| 1/17/12 | 8.75 | 3.979 | 2.502 |
| 1/18/12 | 8.75 | 4.008 | 2.529 |
| 1/19/12 | 8.75 | 4.035 | 2.572 |
| 1/20/12 | 8.75 | 4.006 | 2.627 |
| 1/23/12 | 8.75 | 4.061 | 2.665 |
| 1/24/12 | 8.75 | 4.094 | 2.669 |
| 1/25/12 | 8.75 | 4.052 | 2.651 |
| 1/26/12 | 8.75 | 4.057 | 2.626 |
| 1/27/12 | 8.75 | 4.032 | 2.602 |
| 1/30/12 | 8.75 | 4.029 | 2.548 |
| 1/31/12 | 8.75 | 3.94 | 2.504 |
| 2/1/12 | 8.75 | 3.95 | 2.515 |
| 2/2/12 | 8.75 | 3.987 | 2.553 |
| 2/3/12 | 8.75 | 4.022 | 2.61 |
| 2/6/12 | 8.75 | 4.022 | 2.576 |
| 2/7/12 | 8.75 | 3.972 | 2.622 |
| 2/8/12 | 8.75 | 4.032 | 2.642 |
| 2/9/12 | 8.75 | 4.023 | 2.651 |
| 2/10/12 | 8.75 | 4 | 2.616 |
| 2/13/12 | 8.75 | 4.007 | 2.638 |
| 2/14/12 | 8.75 | 3.967 | 2.6 |
| 2/15/12 | 8.75 | 3.959 | 2.598 |
| 2/16/12 | 8.75 | 3.982 | 2.616 |
| 2/17/12 | 8.75 | 4.02 | 2.631 |
| 2/21/12 | 8.75 | 4.059 | 2.668 |
| 2/22/12 | 8.75 | 4.03 | 2.642 |
| 2/23/12 | 8.75 | 4.029 | 2.643 |
| 2/24/12 | 8.75 | 4.019 | 2.636 |
| 2/27/12 | 8.75 | 4.015 | 2.625 |
| 2/28/12 | 8.75 | 4.016 | 2.596 |
| 2/29/12 | 8.75 | 3.979 | 2.598 |
| 3/1/12 | 8.75 | 3.999 | 2.614 |
| 3/2/12 | 8.75 | 3.972 | 2.58 |
| 3/5/12 | 8.75 | 3.963 | 2.586 |
| 3/6/12 | 8.75 | 3.968 | 2.551 |
| 3/7/12 | 8.75 | 3.96 | 2.572 |
| 3/8/12 | 8.75 | 4.008 | 2.596 |
| 3/9/12 | 8.75 | 3.994 | 2.595 |
| 3/12/12 | 8.75 | 3.978 | 2.579 |
| 3/13/12 | 8.75 | 4.013 | 2.638 |
| 3/14/12 | 8.75 | 4.001 | 2.7 |
| 3/15/12 | 8.75 | 4.104 | 2.734 |
| 3/16/12 | 8.75 | 4.142 | 2.768 |
| 3/19/12 | 8.75 | 4.13 | 2.818 |
| 3/20/12 | 8.75 | 4.156 | 2.806 |
| 3/21/12 | 8.75 | 4.118 | 2.765 |
| 3/22/12 | 8.75 | 4.088 | 2.73 |
| 3/23/12 | 8.75 | 4.082 | 2.717 |
| 3/26/12 | 8.75 | 4.073 | 2.721 |
| 3/27/12 | 8.75 | 4.072 | 2.671 |
| 3/28/12 | 8.75 | 4.02 | 2.667 |
| 3/29/12 | 8.75 | 3.995 | 2.636 |
| 3/30/12 | 8.75 | 4.006 | 2.656 |
| 4/2/12 | 8.75 | 4.013 | 2.665 |
| 4/3/12 | 8.75 | 4.011 | 2.736 |
| 4/4/12 | 8.75 | 4.082 | 2.683 |
| 4/5/12 | 8.75 | 4.032 | 2.679 |
| 4/9/12 | 8.75 | 3.972 | 2.63 |
| 4/10/12 | 8.75 | 3.967 | 2.556 |
| 4/11/12 | 8.75 | 3.922 | 2.584 |
| 4/12/12 | 8.75 | 3.938 | 2.598 |
| 4/13/12 | 8.75 | 3.96 | 2.552 |
| 4/16/12 | 8.75 | 3.916 | 2.573 |
| 4/17/12 | 8.75 | 3.98 | 2.612 |
| 4/18/12 | 8.75 | 3.99 | 2.588 |
| 4/19/12 | 8.75 | 3.991 | 2.593 |
| 4/20/12 | 8.75 | 3.984 | 2.613 |
| 4/23/12 | 8.75 | 4.008 | 2.595 |
| 4/24/12 | 8.75 | 4.045 | 2.625 |
| 4/25/12 | 8.75 | 4.038 | 2.646 |
| 4/26/12 | 8.75 | 4.077 | 2.622 |
| 4/27/12 | 8.75 | 4.062 | 2.633 |
| 4/30/12 | 8.75 | 4.075 | 2.608 |
| 5/1/12 | 8.75 | 4.06 | 2.614 |
| 5/2/12 | 8.75 | 4.061 | 2.594 |
| 5/3/12 | 8.75 | 4.027 | 2.591 |
| 5/4/12 | 8.75 | 4.02 | 2.543 |
| 5/7/12 | 8.75 | 3.98 | 2.542 |
| 5/8/12 | 8.75 | 3.983 | 2.504 |
| 5/9/12 | 8.75 | 3.953 | 2.511 |
| 5/10/12 | 8.75 | 3.967 | 2.497 |
| 5/11/12 | 8.75 | 3.972 | 2.465 |
| 5/14/12 | 8.75 | 3.927 | 2.445 |
| 5/15/12 | 8.75 | 3.901 | 2.458 |
| 5/16/12 | 8.75 | 3.92 | 2.454 |
| 5/17/12 | 8.75 | 3.929 | 2.417 |
| 5/18/12 | 8.75 | 3.91 | 2.429 |
| 5/22/12 | 8.75 | 3.954 | 2.446 |
| 5/23/12 | 8.75 | 3.948 | 2.402 |
| 5/24/12 | 8.75 | 3.915 | 2.399 |
| 5/25/12 | 8.75 | 3.907 | 2.358 |
| 5/28/12 | 8.75 | 3.86 | 2.372 |
| 5/29/12 | 8.75 | 3.929 | 2.389 |
| 5/30/12 | 8.75 | 3.93 | 2.334 |
| 5/31/12 | 8.75 | 3.875 | 2.292 |
| 6/1/12 | 8.75 | 3.849 | 2.219 |
| 6/4/12 | 8.75 | 3.785 | 2.229 |
| 6/5/12 | 8.75 | 3.836 | 2.285 |
| 6/6/12 | 8.75 | 3.893 | 2.35 |
| 6/7/12 | 8.75 | 3.956 | 2.371 |
| 6/8/12 | 8.75 | 3.988 | 2.364 |
| 6/11/12 | 8.75 | 3.912 | 2.335 |
| 6/12/12 | 8.75 | 3.94 | 2.374 |
| 6/13/12 | 8.75 | 3.94 | 2.347 |
| 6/14/12 | 8.75 | 3.917 | 2.377 |
| 6/15/12 | 8.75 | 3.938 | 2.333 |
| 6/18/12 | 8.75 | 3.906 | 2.339 |
| 6/19/12 | 8.75 | 3.926 | 2.362 |
| 6/20/12 | 8.75 | 3.941 | 2.361 |
| 6/21/12 | 8.75 | 3.898 | 2.318 |
| 6/22/12 | 8.75 | 3.936 | 2.358 |
| 6/25/12 | 8.75 | 3.881 | 2.299 |
| 6/26/12 | 8.75 | 3.909 | 2.325 |
| 6/27/12 | 8.75 | 3.908 | 2.324 |
| 6/28/12 | 8.75 | 3.86 | 2.29 |
| 6/29/12 | 8.75 | 3.917 | 2.329 |
| 7/3/12 | 8.75 | 3.91 | 2.328 |
| 7/4/12 | 8.75 | 3.866 | 2.301 |
| 7/5/12 | 8.75 | 3.874 | 2.309 |
| 7/6/12 | 8.75 | 3.855 | 2.295 |
| 7/9/12 | 8.75 | 3.839 | 2.274 |
| 7/10/12 | 8.75 | 3.823 | 2.264 |
| 7/11/12 | 8.75 | 3.845 | 2.279 |
| 7/12/12 | 8.75 | 3.792 | 2.248 |
| 7/13/12 | 8.75 | 3.81 | 2.253 |
| 7/16/12 | 8.75 | 3.785 | 2.245 |
| 7/17/12 | 8.75 | 3.789 | 2.262 |
| 7/18/12 | 8.75 | 3.774 | 2.248 |
| 7/19/12 | 8.75 | 3.799 | 2.275 |
| 7/20/12 | 8.75 | 3.762 | 2.236 |
| 7/23/12 | 8.75 | 3.738 | 2.208 |
| 7/24/12 | 8.75 | 3.74 | 2.198 |
| 7/25/12 | 8.75 | 3.752 | 2.221 |
| 7/26/12 | 8.75 | 3.807 | 2.274 |
| 7/27/12 | 8.75 | 3.865 | 2.33 |
| 7/30/12 | 8.75 | 3.837 | 2.295 |
| 7/31/12 | 8.75 | 3.786 | 2.269 |
| 8/1/12 | 8.75 | 3.806 | 2.295 |
| 8/2/12 | 8.75 | 3.757 | 2.249 |
| 8/3/12 | 8.75 | 3.813 | 2.309 |
| 8/7/12 | 8.75 | 3.889 | 2.37 |
| 8/8/12 | 8.75 | 3.856 | 2.351 |
| 8/9/12 | 8.75 | 3.841 | 2.338 |
| 8/10/12 | 8.75 | 3.821 | 2.319 |
| 8/13/12 | 8.75 | 3.825 | 2.335 |
| 8/14/12 | 8.75 | 3.857 | 2.382 |
| 8/15/12 | 8.75 | 3.931 | 2.469 |
| 8/16/12 | 8.75 | 3.951 | 2.489 |
| 8/17/12 | 8.75 | 3.952 | 2.477 |
| 8/20/12 | 8.75 | 3.959 | 2.48 |
| 8/21/12 | 8.75 | 3.947 | 2.48 |
| 8/22/12 | 8.75 | 3.89 | 2.409 |
| 8/23/12 | 8.75 | 3.876 | 2.402 |
| 8/24/12 | 8.75 | 3.878 | 2.411 |
| 8/27/12 | 8.75 | 3.858 | 2.386 |
| 8/28/12 | 8.75 | 3.823 | 2.364 |
| 8/29/12 | 8.75 | 3.836 | 2.369 |
| 8/30/12 | 8.75 | 3.815 | 2.341 |
| 8/31/12 | 8.75 | 3.792 | 2.336 |
| 9/4/12 | 8.75 | 3.782 | 2.313 |
| 9/5/12 | 8.75 | 3.795 | 2.326 |
| 9/6/12 | 8.75 | 3.874 | 2.398 |
| 9/7/12 | 8.75 | 3.895 | 2.43 |
| 9/10/12 | 8.75 | 3.877 | 2.421 |
| 9/11/12 | 8.75 | 3.91 | 2.444 |
| 9/12/12 | 8.75 | 3.952 | 2.495 |
| 9/13/12 | 8.75 | 3.934 | 2.473 |
| 9/14/12 | 8.75 | 4.014 | 2.539 |
| 9/17/12 | 8.75 | 3.981 | 2.517 |
| 9/18/12 | 8.75 | 3.941 | 2.494 |
| 9/19/12 | 8.75 | 3.905 | 2.456 |
| 9/20/12 | 8.75 | 3.881 | 2.424 |
| 9/21/12 | 8.75 | 3.858 | 2.418 |
| 9/24/12 | 8.75 | 3.828 | 2.39 |
| 9/25/12 | 8.75 | 3.823 | 2.381 |
| 9/26/12 | 8.75 | 3.763 | 2.331 |
| 9/27/12 | 8.75 | 3.776 | 2.348 |
| 9/28/12 | 8.75 | 3.769 | 2.319 |
| 10/1/12 | 8.75 | 3.766 | 2.317 |
| 10/2/12 | 8.75 | 3.763 | 2.321 |
| 10/3/12 | 8.75 | 3.763 | 2.32 |
| 10/4/12 | 8.75 | 3.811 | 2.368 |
| 10/5/12 | 8.75 | 3.837 | 2.404 |
| 10/9/12 | 8.75 | 3.832 | 2.407 |
| 10/10/12 | 8.75 | 3.822 | 2.397 |
| 10/11/12 | 8.75 | 3.828 | 2.4 |
| 10/12/12 | 8.75 | 3.83 | 2.393 |
| 10/15/12 | 8.75 | 3.842 | 2.41 |
| 10/16/12 | 8.75 | 3.884 | 2.442 |
| 10/17/12 | 8.75 | 3.942 | 2.506 |
| 10/18/12 | 8.75 | 3.929 | 2.488 |
| 10/19/12 | 8.75 | 3.877 | 2.432 |
| 10/22/12 | 8.75 | 3.906 | 2.449 |
| 10/23/12 | 8.75 | 3.885 | 2.418 |
| 10/24/12 | 8.75 | 3.891 | 2.427 |
| 10/25/12 | 8.75 | 3.927 | 2.461 |
| 10/26/12 | 8.75 | 3.893 | 2.416 |
| 10/29/12 | 8.75 | 3.873 | 2.4 |
| 10/30/12 | 8.75 | 3.863 | 2.398 |
| 10/31/12 | 8.75 | 3.855 | 2.38 |
| 11/1/12 | 8.75 | 3.868 | 2.38 |
| 11/2/12 | 8.75 | 3.835 | 2.363 |
| 11/5/12 | 8.75 | 3.827 | 2.351 |
| 11/6/12 | 8.75 | 3.872 | 2.385 |
| 11/7/12 | 8.75 | 3.827 | 2.343 |
| 11/8/12 | 8.75 | 3.794 | 2.31 |
| 11/9/12 | 8.75 | 3.806 | 2.309 |
| 11/13/12 | 8.75 | 3.784 | 2.29 |
| 11/14/12 | 8.75 | 3.752 | 2.3 |
| 11/15/12 | 8.75 | 3.766 | 2.31 |
| 11/16/12 | 8.75 | 3.757 | 2.293 |
| 11/19/12 | 8.75 | 3.811 | 2.328 |
| 11/20/12 | 8.75 | 3.826 | 2.347 |
| 11/21/12 | 8.75 | 3.834 | 2.35 |
| 11/22/12 | 8.75 | 3.841 | 2.356 |
| 11/23/12 | 8.75 | 3.838 | 2.361 |
| 11/26/12 | 8.75 | 3.826 | 2.343 |
| 11/27/12 | 8.75 | 3.783 | 2.309 |
| 11/28/12 | 8.75 | 3.775 | 2.302 |
| 11/29/12 | 8.75 | 3.762 | 2.297 |
| 11/30/12 | 8.75 | 3.761 | 2.294 |
| 12/3/12 | 8.75 | 3.763 | 2.303 |
| 12/4/12 | 8.75 | 3.766 | 2.301 |
| 12/5/12 | 8.75 | 3.756 | 2.295 |
| 12/6/12 | 8.75 | 3.767 | 2.302 |
| 12/7/12 | 8.75 | 3.772 | 2.312 |
| 12/10/12 | 8.75 | 3.782 | 2.307 |
| 12/11/12 | 8.75 | 3.806 | 2.336 |
| 12/12/12 | 8.75 | 3.832 | 2.367 |
| 12/13/12 | 8.75 | 3.874 | 2.399 |
| 12/14/12 | 8.75 | 3.858 | 2.381 |
| 12/17/12 | 8.75 | 3.88 | 2.404 |
| 12/18/12 | 8.75 | 3.882 | 2.416 |
| 12/19/12 | 8.75 | 3.882 | 2.419 |
| 12/20/12 | 8.75 | 3.859 | 2.409 |
| 12/21/12 | 8.75 | 3.83 | 2.371 |
| 12/24/12 | 8.75 | 3.819 | 2.377 |
| 12/27/12 | 8.75 | 3.792 | 2.355 |
| 12/28/12 | 8.75 | 3.77 | 2.338 |
| 12/31/12 | 8.75 | 3.807 | 2.365 |
| 1/2/13 | 8.3 | 3.86 | 2.426 |
| 1/3/13 | 8.3 | 3.915 | 2.481 |
| 1/4/13 | 8.3 | 3.905 | 2.484 |
| 1/7/13 | 8.3 | 3.91 | 2.501 |
| 1/8/13 | 8.3 | 3.884 | 2.475 |
| 1/9/13 | 8.3 | 3.872 | 2.475 |
| 1/10/13 | 8.3 | 3.904 | 2.517 |
| 1/11/13 | 8.3 | 3.901 | 2.506 |
| 1/14/13 | 8.3 | 3.898 | 2.505 |
| 1/15/13 | 8.3 | 3.874 | 2.48 |
| 1/16/13 | 8.3 | 3.842 | 2.461 |
| 1/17/13 | 8.3 | 3.908 | 2.512 |
| 1/18/13 | 8.3 | 3.891 | 2.495 |
| 1/21/13 | 8.3 | 3.898 | 2.508 |
| 1/22/13 | 8.3 | 3.891 | 2.499 |
| 1/23/13 | 8.3 | 3.866 | 2.474 |
| 1/24/13 | 8.3 | 3.885 | 2.487 |
| 1/25/13 | 8.3 | 3.939 | 2.537 |
| 1/28/13 | 8.3 | 3.937 | 2.539 |
| 1/29/13 | 8.3 | 3.973 | 2.569 |
| 1/30/13 | 8.3 | 3.966 | 2.572 |
| 1/31/13 | 8.3 | 3.964 | 2.57 |
| 2/1/13 | 8.3 | 4.02 | 2.631 |
| 2/4/13 | 8.3 | 3.988 | 2.597 |
| 2/5/13 | 8.3 | 4.004 | 2.62 |
| 2/6/13 | 8.3 | 3.99 | 2.599 |
| 2/7/13 | 8.3 | 3.994 | 2.6 |
| 2/8/13 | 8.3 | 3.971 | 2.574 |
| 2/11/13 | 8.3 | 3.992 | 2.586 |
| 2/12/13 | 8.3 | 4.009 | 2.612 |
| 2/13/13 | 8.3 | 4.039 | 2.645 |
| 2/14/13 | 8.3 | 4.006 | 2.613 |
| 2/15/13 | 8.3 | 4.034 | 2.629 |
| 2/19/13 | 8.3 | 4.04 | 2.642 |
| 2/20/13 | 8.3 | 4.039 | 2.636 |
| 2/21/13 | 8.3 | 4.009 | 2.607 |
| 2/22/13 | 8.3 | 3.982 | 2.585 |
| 2/25/13 | 8.3 | 3.924 | 2.527 |
| 2/26/13 | 8.3 | 3.933 | 2.527 |
| 2/27/13 | 8.3 | 3.926 | 2.53 |
| 2/28/13 | 8.3 | 3.928 | 2.524 |
| 3/1/13 | 8.3 | 3.903 | 2.495 |
| 3/4/13 | 8.3 | 3.916 | 2.506 |
| 3/5/13 | 8.3 | 3.92 | 2.51 |
| 3/6/13 | 8.3 | 3.952 | 2.548 |
| 3/7/13 | 8.3 | 3.993 | 2.58 |
| 3/8/13 | 8.3 | 4.028 | 2.622 |
| 3/11/13 | 8.3 | 4.03 | 2.631 |
| 3/12/13 | 8.3 | 4.005 | 2.609 |
| 3/13/13 | 8.3 | 3.993 | 2.605 |
| 3/14/13 | 8.3 | 4.026 | 2.625 |
| 3/15/13 | 8.3 | 3.98 | 2.595 |
| 3/18/13 | 8.3 | 3.95 | 2.56 |
| 3/19/13 | 8.3 | 3.906 | 2.519 |
| 3/20/13 | 8.3 | 3.952 | 2.558 |
| 3/21/13 | 8.3 | 3.917 | 2.522 |
| 3/22/13 | 8.3 | 3.938 | 2.529 |
| 3/25/13 | 8.3 | 3.92 | 2.531 |
| 3/26/13 | 8.3 | 3.927 | 2.537 |
| 3/27/13 | 8.3 | 3.894 | 2.49 |
| 3/28/13 | 8.3 | 3.91 | 2.5 |
| 4/1/13 | 8.3 | 3.896 | 2.495 |
| 4/2/13 | 8.3 | 3.899 | 2.503 |
| 4/3/13 | 8.3 | 3.855 | 2.454 |
| 4/4/13 | 8.3 | 3.83 | 2.427 |
| 4/5/13 | 8.3 | 3.755 | 2.362 |
| 4/8/13 | 8.3 | 3.776 | 2.371 |
| 4/9/13 | 8.3 | 3.817 | 2.395 |
| 4/10/13 | 8.3 | 3.854 | 2.442 |
| 4/11/13 | 8.3 | 3.852 | 2.431 |
| 4/12/13 | 8.3 | 3.791 | 2.389 |
| 4/15/13 | 8.3 | 3.788 | 2.359 |
| 4/16/13 | 8.3 | 3.804 | 2.382 |
| 4/17/13 | 8.3 | 3.774 | 2.36 |
| 4/18/13 | 8.3 | 3.77 | 2.352 |
| 4/19/13 | 8.3 | 3.777 | 2.358 |
| 4/22/13 | 8.3 | 3.782 | 2.366 |
| 4/23/13 | 8.3 | 3.799 | 2.378 |
| 4/24/13 | 8.3 | 3.793 | 2.379 |
| 4/25/13 | 8.3 | 3.818 | 2.405 |
| 4/26/13 | 8.3 | 3.795 | 2.375 |
| 4/29/13 | 8.3 | 3.804 | 2.367 |
| 4/30/13 | 8.3 | 3.805 | 2.371 |
| 5/1/13 | 8.3 | 3.778 | 2.352 |
| 5/2/13 | 8.3 | 3.781 | 2.351 |
| 5/3/13 | 8.3 | 3.873 | 2.438 |
| 5/6/13 | 8.3 | 3.902 | 2.468 |
| 5/7/13 | 8.3 | 3.91 | 2.48 |
| 5/8/13 | 8.3 | 3.882 | 2.465 |
| 5/9/13 | 8.3 | 3.85 | 2.448 |
| 5/10/13 | 8.3 | 3.919 | 2.513 |
| 5/13/13 | 8.3 | 3.928 | 2.532 |
| 5/14/13 | 8.3 | 3.952 | 2.563 |
| 5/15/13 | 8.3 | 3.907 | 2.533 |
| 5/16/13 | 8.3 | 3.868 | 2.494 |
| 5/17/13 | 8.3 | 3.898 | 2.527 |
| 5/21/13 | 8.3 | 3.885 | 2.527 |
| 5/22/13 | 8.3 | 3.92 | 2.57 |
| 5/23/13 | 8.3 | 3.923 | 2.573 |
| 5/24/13 | 8.3 | 3.915 | 2.567 |
| 5/27/13 | 8.3 | 3.937 | 2.588 |
| 5/28/13 | 8.3 | 4.017 | 2.665 |
| 5/29/13 | 8.3 | 3.987 | 2.645 |
| 5/30/13 | 8.3 | 3.974 | 2.64 |
| 5/31/13 | 8.3 | 3.967 | 2.631 |
| 6/3/13 | 8.3 | 3.945 | 2.605 |
| 6/4/13 | 8.3 | 3.974 | 2.638 |
| 6/5/13 | 8.3 | 3.956 | 2.62 |
| 6/6/13 | 8.3 | 3.956 | 2.616 |
| 6/7/13 | 8.3 | 4.069 | 2.718 |
| 6/10/13 | 8.3 | 4.097 | 2.753 |
| 6/11/13 | 8.3 | 4.067 | 2.723 |
| 6/12/13 | 8.3 | 4.087 | 2.749 |
| 6/13/13 | 8.3 | 4.039 | 2.692 |
| 6/14/13 | 8.3 | 4.038 | 2.678 |
| 6/17/13 | 8.3 | 4.064 | 2.701 |
| 6/18/13 | 8.3 | 4.057 | 2.704 |
| 6/19/13 | 8.3 | 4.108 | 2.749 |
| 6/20/13 | 8.3 | 4.175 | 2.809 |
| 6/21/13 | 8.3 | 4.297 | 2.905 |
| 6/24/13 | 8.3 | 4.313 | 2.931 |
| 6/25/13 | 8.3 | 4.371 | 2.982 |
| 6/26/13 | 8.3 | 4.336 | 2.957 |
| 6/27/13 | 8.3 | 4.288 | 2.893 |
| 6/28/13 | 8.3 | 4.298 | 2.896 |
| 7/2/13 | 8.3 | 4.258 | 2.853 |
| 7/3/13 | 8.3 | 4.259 | 2.859 |
| 7/4/13 | 8.3 | 4.263 | 2.863 |
| 7/5/13 | 8.3 | 4.367 | 2.973 |
| 7/8/13 | 8.3 | 4.306 | 2.923 |
| 7/9/13 | 8.3 | 4.319 | 2.93 |
| 7/10/13 | 8.3 | 4.325 | 2.946 |
| 7/11/13 | 8.3 | 4.323 | 2.926 |
| 7/12/13 | 8.3 | 4.311 | 2.929 |
| 7/15/13 | 8.3 | 4.303 | 2.921 |
| 7/16/13 | 8.3 | 4.31 | 2.924 |
| 7/17/13 | 8.3 | 4.28 | 2.906 |
| 7/18/13 | 8.3 | 4.306 | 2.919 |
| 7/19/13 | 8.3 | 4.284 | 2.886 |
| 7/22/13 | 8.3 | 4.271 | 2.877 |
| 7/23/13 | 8.3 | 4.314 | 2.926 |
| 7/24/13 | 8.3 | 4.356 | 2.982 |
| 7/25/13 | 8.3 | 4.347 | 2.967 |
| 7/26/13 | 8.3 | 4.34 | 2.954 |
| 7/29/13 | 8.3 | 4.368 | 3 |
| 7/30/13 | 8.3 | 4.386 | 3.028 |
| 7/31/13 | 8.3 | 4.328 | 2.971 |
| 8/1/13 | 8.3 | 4.414 | 3.043 |
| 8/2/13 | 8.3 | 4.381 | 3.001 |
| 8/6/13 | 8.3 | 4.402 | 3.028 |
| 8/7/13 | 8.3 | 4.379 | 3.013 |
| 8/8/13 | 8.3 | 4.366 | 3.003 |
| 8/9/13 | 8.3 | 4.351 | 2.985 |
| 8/12/13 | 8.3 | 4.393 | 3.029 |
| 8/13/13 | 8.3 | 4.459 | 3.097 |
| 8/14/13 | 8.3 | 4.464 | 3.104 |
| 8/15/13 | 8.3 | 4.516 | 3.14 |
| 8/16/13 | 8.3 | 4.568 | 3.175 |
| 8/19/13 | 8.3 | 4.603 | 3.209 |
| 8/20/13 | 8.3 | 4.544 | 3.161 |
| 8/21/13 | 8.3 | 4.593 | 3.216 |
| 8/22/13 | 8.3 | 4.627 | 3.208 |
| 8/23/13 | 8.3 | 4.583 | 3.162 |
| 8/26/13 | 8.3 | 4.541 | 3.122 |
| 8/27/13 | 8.3 | 4.461 | 3.04 |
| 8/28/13 | 8.3 | 4.51 | 3.083 |
| 8/29/13 | 8.3 | 4.517 | 3.067 |
| 8/30/13 | 8.3 | 4.513 | 3.071 |
| 9/3/13 | 8.3 | 4.606 | 3.15 |
| 9/4/13 | 8.3 | 4.628 | 3.182 |
| 9/5/13 | 8.3 | 4.715 | 3.258 |
| 9/6/13 | 8.3 | 4.696 | 3.241 |
| 9/9/13 | 8.3 | 4.687 | 3.221 |
| 9/10/13 | 8.3 | 4.749 | 3.283 |
| 9/11/13 | 8.3 | 4.729 | 3.263 |
| 9/12/13 | 8.3 | 4.726 | 3.262 |
| 9/13/13 | 8.3 | 4.728 | 3.247 |
| 9/16/13 | 8.3 | 4.76 | 3.274 |
| 9/17/13 | 8.3 | 4.767 | 3.253 |
| 9/18/13 | 8.3 | 4.693 | 3.192 |
| 9/19/13 | 8.3 | 4.737 | 3.229 |
| 9/20/13 | 8.3 | 4.694 | 3.206 |
| 9/23/13 | 8.3 | 4.666 | 3.165 |
| 9/24/13 | 8.3 | 4.63 | 3.124 |
| 9/25/13 | 8.3 | 4.597 | 3.1 |
| 9/26/13 | 8.3 | 4.608 | 3.109 |
| 9/27/13 | 8.3 | 4.563 | 3.082 |
| 9/30/13 | 8.3 | 4.56 | 3.072 |
| 10/1/13 | 8.3 | 4.575 | 3.094 |
| 10/2/13 | 8.3 | 4.56 | 3.089 |
| 10/3/13 | 8.3 | 4.583 | 3.097 |
| 10/4/13 | 8.3 | 4.598 | 3.12 |
| 10/7/13 | 8.3 | 4.589 | 3.11 |
| 10/8/13 | 8.3 | 4.582 | 3.11 |
| 10/9/13 | 8.3 | 4.605 | 3.127 |
| 10/10/13 | 8.3 | 4.627 | 3.152 |
| 10/11/13 | 8.3 | 4.629 | 3.148 |
| 10/15/13 | 8.3 | 4.65 | 3.181 |
| 10/16/13 | 8.3 | 4.624 | 3.156 |
| 10/17/13 | 8.3 | 4.583 | 3.118 |
| 10/18/13 | 8.3 | 4.575 | 3.101 |
| 10/21/13 | 8.3 | 4.586 | 3.118 |
| 10/22/13 | 8.3 | 4.532 | 3.068 |
| 10/23/13 | 8.3 | 4.49 | 3.032 |
| 10/24/13 | 8.3 | 4.486 | 3.028 |
| 10/25/13 | 8.3 | 4.495 | 3.025 |
| 10/28/13 | 8.3 | 4.481 | 3.027 |
| 10/29/13 | 8.3 | 4.453 | 3.007 |
| 10/30/13 | 8.3 | 4.47 | 3.018 |
| 10/31/13 | 8.3 | 4.468 | 3.014 |
| 11/1/13 | 8.3 | 4.52 | 3.071 |
| 11/4/13 | 8.3 | 4.522 | 3.069 |
| 11/5/13 | 8.3 | 4.542 | 3.103 |
| 11/6/13 | 8.3 | 4.534 | 3.109 |
| 11/7/13 | 8.3 | 4.517 | 3.085 |
| 11/8/13 | 8.3 | 4.598 | 3.163 |
| 11/12/13 | 8.3 | 4.616 | 3.196 |
| 11/13/13 | 8.3 | 4.564 | 3.141 |
| 11/14/13 | 8.3 | 4.546 | 3.109 |
| 11/15/13 | 8.3 | 4.538 | 3.12 |
| 11/18/13 | 8.3 | 4.486 | 3.079 |
| 11/19/13 | 8.3 | 4.518 | 3.103 |
| 11/20/13 | 8.3 | 4.619 | 3.203 |
| 11/21/13 | 8.3 | 4.587 | 3.196 |
| 11/22/13 | 8.3 | 4.552 | 3.147 |
| 11/25/13 | 8.3 | 4.535 | 3.124 |
| 11/26/13 | 8.3 | 4.517 | 3.111 |
| 11/27/13 | 8.3 | 4.54 | 3.145 |
| 11/28/13 | 8.3 | 4.536 | 3.14 |
| 11/29/13 | 8.3 | 4.561 | 3.15 |
| 12/2/13 | 8.3 | 4.595 | 3.186 |
| 12/3/13 | 8.3 | 4.592 | 3.18 |
| 12/4/13 | 8.3 | 4.672 | 3.261 |
| 12/5/13 | 8.3 | 4.692 | 3.281 |
| 12/6/13 | 8.3 | 4.685 | 3.28 |
| 12/9/13 | 8.3 | 4.648 | 3.254 |
| 12/10/13 | 8.3 | 4.582 | 3.183 |
| 12/11/13 | 8.3 | 4.6 | 3.21 |
| 12/12/13 | 8.3 | 4.622 | 3.217 |
| 12/13/13 | 8.3 | 4.618 | 3.212 |
| 12/16/13 | 8.3 | 4.617 | 3.216 |
| 12/17/13 | 8.3 | 4.579 | 3.189 |
| 12/18/13 | 8.3 | 4.609 | 3.218 |
| 12/19/13 | 8.3 | 4.605 | 3.218 |
| 12/20/13 | 8.3 | 4.568 | 3.18 |
| 12/23/13 | 8.3 | 4.545 | 3.174 |
| 12/24/13 | 8.3 | 4.586 | 3.207 |
| 12/27/13 | 8.3 | 4.628 | 3.251 |
| 12/30/13 | 8.3 | 4.592 | 3.213 |
| 12/31/13 | 8.3 | 4.598 | 3.229 |
| 1/2/14 | 8.3 | 4.606 | 3.214 |
| 1/3/14 | 8.3 | 4.587 | 3.214 |
| 1/6/14 | 8.3 | 4.572 | 3.191 |
| 1/7/14 | 8.3 | 4.538 | 3.168 |
| 1/8/14 | 8.3 | 4.57 | 3.213 |
| 1/9/14 | 8.3 | 4.56 | 3.191 |
| 1/10/14 | 8.3 | 4.481 | 3.111 |
| 1/13/14 | 8.3 | 4.437 | 3.094 |
| 1/14/14 | 8.3 | 4.482 | 3.13 |
| 1/15/14 | 8.3 | 4.461 | 3.124 |
| 1/16/14 | 8.3 | 4.427 | 3.083 |
| 1/17/14 | 8.3 | 4.398 | 3.066 |
| 1/20/14 | 8.3 | 4.397 | 3.056 |
| 1/21/14 | 8.3 | 4.395 | 3.058 |
| 1/22/14 | 8.3 | 4.38 | 3.054 |
| 1/23/14 | 8.3 | 4.306 | 2.985 |
| 1/24/14 | 8.3 | 4.306 | 2.97 |
| 1/27/14 | 8.3 | 4.333 | 2.993 |
| 1/28/14 | 8.3 | 4.333 | 2.989 |
| 1/29/14 | 8.3 | 4.274 | 2.945 |
| 1/30/14 | 8.3 | 4.292 | 2.95 |
| 1/31/14 | 8.3 | 4.269 | 2.925 |
| 2/3/14 | 8.3 | 4.233 | 2.887 |
| 2/4/14 | 8.3 | 4.293 | 2.935 |
| 2/5/14 | 8.3 | 4.342 | 2.989 |
| 2/6/14 | 8.3 | 4.379 | 3.026 |
| 2/7/14 | 8.3 | 4.375 | 3.011 |
| 2/10/14 | 8.3 | 4.361 | 3.007 |
| 2/11/14 | 8.3 | 4.42 | 3.056 |
| 2/12/14 | 8.3 | 4.423 | 3.07 |
| 2/13/14 | 8.3 | 4.405 | 3.051 |
| 2/14/14 | 8.3 | 4.403 | 3.049 |
| 2/18/14 | 8.3 | 4.395 | 3.042 |
| 2/19/14 | 8.3 | 4.402 | 3.049 |
| 2/20/14 | 8.3 | 4.4 | 3.046 |
| 2/21/14 | 8.3 | 4.376 | 3.018 |
| 2/24/14 | 8.3 | 4.376 | 3.02 |
| 2/25/14 | 8.3 | 4.35 | 2.995 |
| 2/26/14 | 8.3 | 4.308 | 2.964 |
| 2/27/14 | 8.3 | 4.293 | 2.939 |
| 2/28/14 | 8.3 | 4.29 | 2.941 |
| 3/3/14 | 8.3 | 4.276 | 2.929 |
| 3/4/14 | 8.3 | 4.336 | 2.989 |
| 3/5/14 | 8.3 | 4.334 | 2.99 |
| 3/6/14 | 8.3 | 4.355 | 3.025 |
| 3/7/14 | 8.3 | 4.374 | 3.043 |
| 3/10/14 | 8.3 | 4.356 | 3.029 |
| 3/11/14 | 8.3 | 4.348 | 3.019 |
| 3/12/14 | 8.3 | 4.313 | 2.99 |
| 3/13/14 | 8.3 | 4.231 | 2.931 |
| 3/14/14 | 8.3 | 4.231 | 2.927 |
| 3/17/14 | 8.3 | 4.256 | 2.949 |
| 3/18/14 | 8.3 | 4.264 | 2.94 |
| 3/19/14 | 8.3 | 4.294 | 2.976 |
| 3/20/14 | 8.3 | 4.306 | 2.992 |
| 3/21/14 | 8.3 | 4.265 | 2.955 |
| 3/24/14 | 8.3 | 4.25 | 2.94 |
| 3/25/14 | 8.3 | 4.297 | 2.979 |
| 3/26/14 | 8.3 | 4.264 | 2.962 |
| 3/27/14 | 8.3 | 4.236 | 2.934 |
| 3/28/14 | 8.3 | 4.244 | 2.945 |
| 3/31/14 | 8.3 | 4.262 | 2.964 |
| 4/1/14 | 8.3 | 4.285 | 3.009 |
| 4/2/14 | 8.3 | 4.294 | 3.04 |
| 4/3/14 | 8.3 | 4.288 | 3.034 |
| 4/4/14 | 8.3 | 4.251 | 2.998 |
| 4/7/14 | 8.3 | 4.227 | 2.973 |
| 4/8/14 | 8.3 | 4.219 | 2.966 |
| 4/9/14 | 8.3 | 4.24 | 2.988 |
| 4/10/14 | 8.3 | 4.222 | 2.971 |
| 4/11/14 | 8.3 | 4.192 | 2.94 |
| 4/14/14 | 8.3 | 4.191 | 2.939 |
| 4/15/14 | 8.3 | 4.201 | 2.92 |
| 4/16/14 | 8.3 | 4.189 | 2.907 |
| 4/17/14 | 8.3 | 4.23 | 2.948 |
| 4/21/14 | 8.3 | 4.208 | 2.945 |
| 4/22/14 | 8.3 | 4.19 | 2.938 |
| 4/23/14 | 8.3 | 4.185 | 2.934 |
| 4/24/14 | 8.3 | 4.183 | 2.932 |
| 4/25/14 | 8.3 | 4.176 | 2.925 |
| 4/28/14 | 8.3 | 4.244 | 2.972 |
| 4/29/14 | 8.3 | 4.235 | 2.963 |
| 4/30/14 | 8.3 | 4.263 | 2.927 |
| 5/1/14 | 8.3 | 4.232 | 2.902 |
| 5/2/14 | 8.3 | 4.212 | 2.879 |
| 5/5/14 | 8.3 | 4.234 | 2.899 |
| 5/6/14 | 8.3 | 4.222 | 2.893 |
| 5/7/14 | 8.3 | 4.233 | 2.901 |
| 5/8/14 | 8.3 | 4.227 | 2.897 |
| 5/9/14 | 8.3 | 4.223 | 2.896 |
| 5/12/14 | 8.3 | 4.252 | 2.924 |
| 5/13/14 | 8.3 | 4.218 | 2.891 |
| 5/14/14 | 8.3 | 4.158 | 2.833 |
| 5/15/14 | 8.3 | 4.126 | 2.794 |
| 5/16/14 | 8.3 | 4.127 | 2.799 |
| 5/20/14 | 8.3 | 4.147 | 2.82 |
| 5/21/14 | 8.3 | 4.179 | 2.846 |
| 5/22/14 | 8.3 | 4.198 | 2.869 |
| 5/23/14 | 8.3 | 4.174 | 2.839 |
| 5/26/14 | 8.3 | 4.186 | 2.849 |
| 5/27/14 | 8.3 | 4.171 | 2.837 |
| 5/28/14 | 8.3 | 4.102 | 2.765 |
| 5/29/14 | 8.3 | 4.13 | 2.793 |
| 5/30/14 | 8.3 | 4.119 | 2.78 |
| 6/2/14 | 8.3 | 4.151 | 2.804 |
| 6/3/14 | 8.3 | 4.188 | 2.851 |
| 6/4/14 | 8.3 | 4.206 | 2.862 |
| 6/5/14 | 8.3 | 4.197 | 2.854 |
| 6/6/14 | 8.3 | 4.184 | 2.84 |
| 6/9/14 | 8.3 | 4.187 | 2.841 |
| 6/10/14 | 8.3 | 4.202 | 2.864 |
| 6/11/14 | 8.3 | 4.198 | 2.867 |
| 6/12/14 | 8.3 | 4.171 | 2.837 |
| 6/13/14 | 8.3 | 4.179 | 2.832 |
| 6/16/14 | 8.3 | 4.16 | 2.812 |
| 6/17/14 | 8.3 | 4.186 | 2.837 |
| 6/18/14 | 8.3 | 4.157 | 2.801 |
| 6/19/14 | 8.3 | 4.175 | 2.825 |
| 6/20/14 | 8.3 | 4.196 | 2.835 |
| 6/23/14 | 8.3 | 4.208 | 2.865 |
| 6/24/14 | 8.3 | 4.169 | 2.826 |
| 6/25/14 | 8.3 | 4.162 | 2.822 |
| 6/26/14 | 8.3 | 4.137 | 2.799 |
| 6/27/14 | 8.3 | 4.142 | 2.801 |
| 6/30/14 | 8.3 | 4.122 | 2.78 |
| 7/2/14 | 8.3 | 4.186 | 2.844 |
| 7/3/14 | 8.3 | 4.184 | 2.842 |
| 7/4/14 | 8.3 | 4.182 | 2.846 |
| 7/7/14 | 8.3 | 4.17 | 2.827 |
| 7/8/14 | 8.3 | 4.123 | 2.785 |
| 7/9/14 | 8.3 | 4.121 | 2.788 |
| 7/10/14 | 8.3 | 4.127 | 2.788 |
| 7/11/14 | 8.3 | 4.11 | 2.769 |
| 7/14/14 | 8.3 | 4.103 | 2.77 |
| 7/15/14 | 8.3 | 4.109 | 2.767 |
| 7/16/14 | 8.3 | 4.089 | 2.749 |
| 7/17/14 | 8.3 | 4.031 | 2.691 |
| 7/18/14 | 8.3 | 4.056 | 2.711 |
| 7/21/14 | 8.3 | 4.013 | 2.671 |
| 7/22/14 | 8.3 | 4.008 | 2.665 |
| 7/23/14 | 8.3 | 4.021 | 2.676 |
| 7/24/14 | 8.3 | 4.064 | 2.705 |
| 7/25/14 | 8.3 | 4.02 | 2.669 |
| 7/28/14 | 8.3 | 4.022 | 2.671 |
| 7/29/14 | 8.3 | 3.992 | 2.643 |
| 7/30/14 | 8.3 | 4.057 | 2.706 |
| 7/31/14 | 8.3 | 4.058 | 2.694 |
| 8/1/14 | 8.3 | 4.017 | 2.656 |
| 8/5/14 | 8.3 | 4.024 | 2.653 |
| 8/6/14 | 8.3 | 4.018 | 2.647 |
| 8/7/14 | 8.3 | 3.992 | 2.621 |
| 8/8/14 | 8.3 | 3.994 | 2.627 |
| 8/11/14 | 8.3 | 4.011 | 2.638 |
| 8/12/14 | 8.3 | 4.049 | 2.67 |
| 8/13/14 | 8.3 | 4.031 | 2.642 |
| 8/14/14 | 8.3 | 4.016 | 2.623 |
| 8/15/14 | 8.3 | 3.977 | 2.582 |
| 8/18/14 | 8.3 | 4.02 | 2.621 |
| 8/19/14 | 8.3 | 4.022 | 2.628 |
| 8/20/14 | 8.3 | 4.055 | 2.653 |
| 8/21/14 | 8.3 | 4.043 | 2.638 |
| 8/22/14 | 8.3 | 4.028 | 2.628 |
| 8/25/14 | 8.3 | 3.998 | 2.597 |
| 8/26/14 | 8.3 | 4 | 2.603 |
| 8/27/14 | 8.3 | 3.966 | 2.569 |
| 8/28/14 | 8.3 | 3.957 | 2.559 |
| 8/29/14 | 8.3 | 3.953 | 2.556 |
| 9/2/14 | 8.3 | 4.037 | 2.641 |
| 9/3/14 | 8.3 | 4.028 | 2.63 |
| 9/4/14 | 8.3 | 4.059 | 2.667 |
| 9/5/14 | 8.3 | 4.06 | 2.669 |
| 9/8/14 | 8.3 | 4.07 | 2.68 |
| 9/9/14 | 8.3 | 4.09 | 2.702 |
| 9/10/14 | 8.3 | 4.113 | 2.727 |
| 9/11/14 | 8.3 | 4.11 | 2.717 |
| 9/12/14 | 8.3 | 4.146 | 2.76 |
| 9/15/14 | 8.3 | 4.146 | 2.759 |
| 9/16/14 | 8.3 | 4.157 | 2.767 |
| 9/17/14 | 8.3 | 4.177 | 2.786 |
| 9/18/14 | 8.3 | 4.179 | 2.791 |
| 9/19/14 | 8.3 | 4.136 | 2.755 |
| 9/22/14 | 8.3 | 4.114 | 2.755 |
| 9/23/14 | 8.3 | 4.087 | 2.719 |
| 9/24/14 | 8.3 | 4.103 | 2.736 |
| 9/25/14 | 8.3 | 4.054 | 2.678 |
| 9/26/14 | 8.3 | 4.064 | 2.682 |
| 9/29/14 | 8.3 | 4.037 | 2.647 |
| 9/30/14 | 8.3 | 4.059 | 2.671 |
| 10/1/14 | 8.3 | 3.991 | 2.596 |
| 10/2/14 | 8.3 | 4.013 | 2.624 |
| 10/3/14 | 8.3 | 4.002 | 2.608 |
| 10/6/14 | 8.3 | 3.981 | 2.597 |
| 10/7/14 | 8.3 | 3.938 | 2.551 |
| 10/8/14 | 8.3 | 3.931 | 2.555 |
| 10/9/14 | 8.3 | 3.957 | 2.563 |
| 10/10/14 | 8.3 | 3.942 | 2.547 |
| 10/14/14 | 8.3 | 3.894 | 2.491 |
| 10/15/14 | 8.3 | 3.891 | 2.467 |
| 10/16/14 | 8.3 | 3.94 | 2.494 |
| 10/17/14 | 8.3 | 3.974 | 2.52 |
| 10/20/14 | 8.3 | 3.975 | 2.523 |
| 10/21/14 | 8.3 | 3.991 | 2.541 |
| 10/22/14 | 8.3 | 3.985 | 2.531 |
| 10/23/14 | 8.3 | 4.013 | 2.561 |
| 10/24/14 | 8.3 | 4.01 | 2.563 |
| 10/27/14 | 8.3 | 4.004 | 2.561 |
| 10/28/14 | 8.3 | 4.029 | 2.581 |
| 10/29/14 | 8.3 | 4.039 | 2.588 |
| 10/30/14 | 8.3 | 4.034 | 2.587 |
| 10/31/14 | 8.3 | 4.032 | 2.59 |
| 11/3/14 | 8.3 | 4.031 | 2.589 |
| 11/4/14 | 8.3 | 4.024 | 2.573 |
| 11/5/14 | 8.3 | 4.036 | 2.599 |
| 11/6/14 | 8.3 | 4.085 | 2.639 |
| 11/7/14 | 8.3 | 4.043 | 2.594 |
| 11/10/14 | 8.3 | 4.064 | 2.615 |
| 11/12/14 | 8.3 | 4.063 | 2.627 |
| 11/13/14 | 8.3 | 4.053 | 2.608 |
| 11/14/14 | 8.3 | 4.042 | 2.593 |
| 11/17/14 | 8.3 | 4.03 | 2.584 |
| 11/18/14 | 8.3 | 4.005 | 2.558 |
| 11/19/14 | 8.3 | 4.046 | 2.605 |
| 11/20/14 | 8.3 | 4.024 | 2.573 |
| 11/21/14 | 8.3 | 4.001 | 2.553 |
| 11/24/14 | 8.3 | 3.969 | 2.528 |
| 11/25/14 | 8.3 | 3.932 | 2.489 |
| 11/26/14 | 8.3 | 3.925 | 2.484 |
| 11/27/14 | 8.3 | 3.899 | 2.457 |
| 11/28/14 | 8.3 | 3.853 | 2.424 |
| 12/1/14 | 8.3 | 3.886 | 2.453 |
| 12/2/14 | 8.3 | 3.949 | 2.512 |
| 12/3/14 | 8.3 | 3.932 | 2.487 |
| 12/4/14 | 8.3 | 3.906 | 2.455 |
| 12/5/14 | 8.3 | 3.934 | 2.481 |
| 12/8/14 | 8.3 | 3.873 | 2.424 |
| 12/9/14 | 8.3 | 3.866 | 2.41 |
| 12/10/14 | 8.3 | 3.833 | 2.38 |
| 12/11/14 | 8.3 | 3.84 | 2.364 |
| 12/12/14 | 8.3 | 3.779 | 2.303 |
| 12/15/14 | 8.3 | 3.81 | 2.322 |
| 12/16/14 | 8.3 | 3.772 | 2.293 |
| 12/17/14 | 8.3 | 3.823 | 2.334 |
| 12/18/14 | 8.3 | 3.871 | 2.391 |
| 12/19/14 | 8.3 | 3.818 | 2.335 |
| 12/22/14 | 8.3 | 3.817 | 2.329 |
| 12/23/14 | 8.3 | 3.902 | 2.426 |
| 12/24/14 | 8.3 | 3.918 | 2.439 |
| 12/29/14 | 8.3 | 3.862 | 2.382 |
| 12/30/14 | 8.3 | 3.838 | 2.359 |
| 12/31/14 | 8.3 | 3.807 | 2.335 |
| 1/2/15 | 8.3 | 3.767 | 2.296 |
| 1/5/15 | 8.3 | 3.721 | 2.246 |
| 1/6/15 | 8.3 | 3.681 | 2.201 |
| 1/7/15 | 8.3 | 3.689 | 2.216 |
| 1/8/15 | 8.3 | 3.748 | 2.274 |
| 1/9/15 | 8.3 | 3.705 | 2.221 |
| 1/12/15 | 8.3 | 3.655 | 2.172 |
| 1/13/15 | 8.3 | 3.643 | 2.165 |
| 1/14/15 | 8.3 | 3.611 | 2.14 |
| 1/15/15 | 8.3 | 3.539 | 2.047 |
| 1/16/15 | 8.3 | 3.587 | 2.108 |
| 1/19/15 | 8.3 | 3.568 | 2.084 |
| 1/20/15 | 8.3 | 3.542 | 2.054 |
| 1/21/15 | 8.3 | 3.528 | 2.051 |
| 1/22/15 | 8.3 | 3.559 | 2.072 |
| 1/23/15 | 8.3 | 3.515 | 2.022 |
| 1/26/15 | 8.3 | 3.527 | 2.028 |
| 1/27/15 | 8.3 | 3.477 | 1.994 |
| 1/28/15 | 8.3 | 3.428 | 1.928 |
| 1/29/15 | 8.3 | 3.436 | 1.939 |
| 1/30/15 | 8.3 | 3.337 | 1.834 |
| 2/2/15 | 8.3 | 3.332 | 1.833 |
| 2/3/15 | 8.3 | 3.39 | 1.903 |
| 2/4/15 | 8.3 | 3.346 | 1.867 |
| 2/5/15 | 8.3 | 3.431 | 1.958 |
| 2/6/15 | 8.3 | 3.498 | 2.032 |
| 2/9/15 | 8.3 | 3.493 | 2.031 |
| 2/10/15 | 8.3 | 3.522 | 2.039 |
| 2/11/15 | 8.3 | 3.516 | 2.064 |
| 2/12/15 | 8.3 | 3.49 | 2.04 |
| 2/13/15 | 8.3 | 3.523 | 2.07 |
| 2/17/15 | 8.3 | 3.563 | 2.129 |
| 2/18/15 | 8.3 | 3.564 | 2.113 |
| 2/19/15 | 8.3 | 3.533 | 2.106 |
| 2/20/15 | 8.3 | 3.524 | 2.061 |
| 2/23/15 | 8.3 | 3.463 | 2.012 |
| 2/24/15 | 8.3 | 3.409 | 1.965 |
| 2/25/15 | 8.3 | 3.391 | 1.951 |
| 2/26/15 | 8.3 | 3.404 | 1.962 |
| 2/27/15 | 8.3 | 3.354 | 1.919 |
| 3/2/15 | 8.3 | 3.423 | 1.98 |
| 3/3/15 | 8.3 | 3.46 | 2.037 |
| 3/4/15 | 8.3 | 3.522 | 2.102 |
| 3/5/15 | 8.3 | 3.543 | 2.129 |
| 3/6/15 | 8.3 | 3.636 | 2.23 |
| 3/9/15 | 8.3 | 3.625 | 2.204 |
| 3/10/15 | 8.3 | 3.583 | 2.169 |
| 3/11/15 | 8.3 | 3.542 | 2.135 |
| 3/12/15 | 8.3 | 3.538 | 2.131 |
| 3/13/15 | 8.3 | 3.522 | 2.111 |
| 3/16/15 | 8.3 | 3.49 | 2.07 |
| 3/17/15 | 8.3 | 3.451 | 2.045 |
| 3/18/15 | 8.3 | 3.374 | 1.971 |
| 3/19/15 | 8.3 | 3.353 | 1.951 |
| 3/20/15 | 8.3 | 3.346 | 1.939 |
| 3/23/15 | 8.3 | 3.353 | 1.949 |
| 3/24/15 | 8.3 | 3.333 | 1.94 |
| 3/25/15 | 8.3 | 3.375 | 1.984 |
| 3/26/15 | 8.3 | 3.449 | 2.039 |
| 3/27/15 | 8.3 | 3.398 | 1.997 |
| 3/30/15 | 8.3 | 3.396 | 1.991 |
| 3/31/15 | 8.3 | 3.394 | 1.984 |
| 4/1/15 | 8.3 | 3.351 | 1.947 |
| 4/2/15 | 8.3 | 3.372 | 1.959 |
| 4/6/15 | 8.3 | 3.409 | 1.995 |
| 4/7/15 | 8.3 | 3.391 | 1.988 |
| 4/8/15 | 8.3 | 3.384 | 1.991 |
| 4/9/15 | 8.3 | 3.434 | 2.034 |
| 4/10/15 | 8.3 | 3.442 | 2.04 |
| 4/13/15 | 8.3 | 3.433 | 2.022 |
| 4/14/15 | 8.3 | 3.385 | 1.985 |
| 4/15/15 | 8.3 | 3.393 | 1.985 |
| 4/16/15 | 8.3 | 3.431 | 2.025 |
| 4/17/15 | 8.3 | 3.436 | 2.021 |
| 4/20/15 | 8.3 | 3.449 | 2.035 |
| 4/21/15 | 8.3 | 3.46 | 2.036 |
| 4/22/15 | 8.3 | 3.504 | 2.091 |
| 4/23/15 | 8.3 | 3.496 | 2.078 |
| 4/24/15 | 8.3 | 3.456 | 2.051 |
| 4/27/15 | 8.3 | 3.478 | 2.074 |
| 4/28/15 | 8.3 | 3.572 | 2.161 |
| 4/29/15 | 8.3 | 3.605 | 2.189 |
| 4/30/15 | 8.3 | 3.6 | 2.178 |
| 5/1/15 | 8.3 | 3.659 | 2.241 |
| 5/4/15 | 8.3 | 3.708 | 2.294 |
| 5/5/15 | 8.3 | 3.731 | 2.324 |
| 5/6/15 | 8.3 | 3.818 | 2.404 |
| 5/7/15 | 8.3 | 3.754 | 2.331 |
| 5/8/15 | 8.3 | 3.72 | 2.298 |
| 5/11/15 | 8.3 | 3.835 | 2.408 |
| 5/12/15 | 8.3 | 3.823 | 2.394 |
| 5/13/15 | 8.3 | 3.861 | 2.437 |
| 5/14/15 | 8.3 | 3.859 | 2.416 |
| 5/15/15 | 8.3 | 3.784 | 2.336 |
| 5/19/15 | 8.3 | 3.882 | 2.433 |
| 5/20/15 | 8.3 | 3.856 | 2.403 |
| 5/21/15 | 8.3 | 3.8 | 2.346 |
| 5/22/15 | 8.3 | 3.813 | 2.355 |
| 5/25/15 | 8.3 | 3.83 | 2.357 |
| 5/26/15 | 8.3 | 3.75 | 2.287 |
| 5/27/15 | 8.3 | 3.725 | 2.247 |
| 5/28/15 | 8.3 | 3.71 | 2.257 |
| 5/29/15 | 8.3 | 3.674 | 2.213 |
| 6/1/15 | 8.3 | 3.703 | 2.231 |
| 6/2/15 | 8.3 | 3.775 | 2.297 |
| 6/3/15 | 8.3 | 3.851 | 2.369 |
| 6/4/15 | 8.3 | 3.805 | 2.333 |
| 6/5/15 | 8.3 | 3.866 | 2.391 |
| 6/8/15 | 8.3 | 3.867 | 2.389 |
| 6/9/15 | 8.3 | 3.92 | 2.444 |
| 6/10/15 | 8.3 | 3.958 | 2.482 |
| 6/11/15 | 8.3 | 3.893 | 2.404 |
| 6/12/15 | 8.3 | 3.882 | 2.396 |
| 6/15/15 | 8.3 | 3.859 | 2.361 |
| 6/16/15 | 8.3 | 3.843 | 2.337 |
| 6/17/15 | 8.3 | 3.873 | 2.358 |
| 6/18/15 | 8.3 | 3.9 | 2.394 |
| 6/19/15 | 8.3 | 3.853 | 2.332 |
| 6/22/15 | 8.3 | 3.927 | 2.401 |
| 6/23/15 | 8.3 | 3.949 | 2.425 |
| 6/24/15 | 8.3 | 3.933 | 2.384 |
| 6/25/15 | 8.3 | 3.985 | 2.411 |
| 6/26/15 | 8.3 | 4.034 | 2.462 |
| 6/29/15 | 8.3 | 3.953 | 2.356 |
| 6/30/15 | 8.3 | 3.922 | 2.303 |
| 7/2/15 | 8.3 | 3.984 | 2.375 |
| 7/3/15 | 8.3 | 3.958 | 2.345 |
| 7/6/15 | 8.3 | 3.898 | 2.277 |
| 7/7/15 | 8.3 | 3.839 | 2.223 |
| 7/8/15 | 8.3 | 3.795 | 2.166 |
| 7/9/15 | 8.3 | 3.865 | 2.245 |
| 7/10/15 | 8.3 | 3.953 | 2.339 |
| 7/13/15 | 8.3 | 3.958 | 2.354 |
| 7/14/15 | 8.3 | 3.944 | 2.32 |
| 7/15/15 | 8.3 | 3.897 | 2.281 |
| 7/16/15 | 8.3 | 3.89 | 2.271 |
| 7/17/15 | 8.3 | 3.874 | 2.244 |
| 7/20/15 | 8.3 | 3.893 | 2.26 |
| 7/21/15 | 8.3 | 3.92 | 2.249 |
| 7/22/15 | 8.3 | 3.898 | 2.222 |
| 7/23/15 | 8.3 | 3.852 | 2.169 |
| 7/24/15 | 8.3 | 3.838 | 2.152 |
| 7/27/15 | 8.3 | 3.815 | 2.128 |
| 7/28/15 | 8.3 | 3.87 | 2.172 |
| 7/29/15 | 8.3 | 3.898 | 2.203 |
| 7/30/15 | 8.3 | 3.872 | 2.159 |
| 7/31/15 | 8.3 | 3.842 | 2.126 |
| 8/4/15 | 8.3 | 3.814 | 2.108 |
| 8/5/15 | 8.3 | 3.848 | 2.154 |
| 8/6/15 | 8.3 | 3.835 | 2.129 |
| 8/7/15 | 8.3 | 3.804 | 2.09 |
| 8/10/15 | 8.3 | 3.852 | 2.142 |
| 8/11/15 | 8.3 | 3.801 | 2.087 |
| 8/12/15 | 8.3 | 3.816 | 2.096 |
| 8/13/15 | 8.3 | 3.826 | 2.097 |
| 8/14/15 | 8.3 | 3.816 | 2.088 |
| 8/17/15 | 8.3 | 3.875 | 2.078 |
| 8/18/15 | 8.3 | 3.895 | 2.097 |
| 8/19/15 | 8.3 | 3.843 | 2.051 |
| 8/20/15 | 8.3 | 3.815 | 2.013 |
| 8/21/15 | 8.3 | 3.849 | 2.009 |
| 8/24/15 | 8.3 | 3.859 | 2.008 |
| 8/25/15 | 8.3 | 3.929 | 2.084 |
| 8/26/15 | 8.3 | 4.063 | 2.196 |
| 8/27/15 | 8.3 | 4.084 | 2.211 |
| 8/28/15 | 8.3 | 4.06 | 2.19 |
| 8/31/15 | 8.3 | 4.103 | 2.235 |
| 9/1/15 | 8.3 | 4.059 | 2.179 |
| 9/2/15 | 8.3 | 4.084 | 2.207 |
| 9/3/15 | 8.3 | 4.088 | 2.22 |
| 9/4/15 | 8.3 | 4.068 | 2.197 |
| 9/8/15 | 8.3 | 4.094 | 2.233 |
| 9/9/15 | 8.3 | 4.093 | 2.259 |
| 9/10/15 | 8.3 | 4.086 | 2.263 |
| 9/11/15 | 8.3 | 4.055 | 2.237 |
| 9/14/15 | 8.3 | 4.034 | 2.234 |
| 9/15/15 | 8.3 | 4.12 | 2.321 |
| 9/16/15 | 8.3 | 4.135 | 2.339 |
| 9/17/15 | 8.3 | 4.081 | 2.29 |
| 9/18/15 | 8.3 | 4.019 | 2.226 |
| 9/21/15 | 8.3 | 4.088 | 2.293 |
| 9/22/15 | 8.3 | 4.032 | 2.231 |
| 9/23/15 | 8.3 | 4.041 | 2.242 |
| 9/24/15 | 8.3 | 4.034 | 2.22 |
| 9/25/15 | 8.3 | 4.107 | 2.27 |
| 9/28/15 | 8.3 | 4.028 | 2.197 |
| 9/29/15 | 8.3 | 4.032 | 2.189 |
| 9/30/15 | 8.3 | 4.063 | 2.199 |
| 10/1/15 | 8.3 | 4.06 | 2.2 |
| 10/2/15 | 8.3 | 4.052 | 2.186 |
| 10/5/15 | 8.3 | 4.107 | 2.232 |
| 10/6/15 | 8.3 | 4.1 | 2.219 |
| 10/7/15 | 8.3 | 4.131 | 2.252 |
| 10/8/15 | 8.3 | 4.185 | 2.3 |
| 10/9/15 | 8.3 | 4.202 | 2.314 |
| 10/13/15 | 8.3 | 4.143 | 2.25 |
| 10/14/15 | 8.3 | 4.105 | 2.215 |
| 10/15/15 | 8.3 | 4.137 | 2.244 |
| 10/16/15 | 8.3 | 4.151 | 2.264 |
| 10/19/15 | 8.3 | 4.162 | 2.26 |
| 10/20/15 | 8.3 | 4.226 | 2.332 |
| 10/21/15 | 8.3 | 4.16 | 2.267 |
| 10/22/15 | 8.3 | 4.154 | 2.262 |
| 10/23/15 | 8.3 | 4.186 | 2.303 |
| 10/26/15 | 8.3 | 4.123 | 2.246 |
| 10/27/15 | 8.3 | 4.11 | 2.233 |
| 10/28/15 | 8.3 | 4.138 | 2.272 |
| 10/29/15 | 8.3 | 4.189 | 2.322 |
| 10/30/15 | 8.3 | 4.159 | 2.304 |
| 11/2/15 | 8.3 | 4.181 | 2.326 |
| 11/3/15 | 8.3 | 4.21 | 2.354 |
| 11/4/15 | 8.3 | 4.212 | 2.365 |
| 11/5/15 | 8.3 | 4.218 | 2.375 |
| 11/6/15 | 8.3 | 4.251 | 2.416 |
| 11/9/15 | 8.3 | 4.253 | 2.418 |
| 11/10/15 | 8.3 | 4.234 | 2.401 |
| 11/12/15 | 8.3 | 4.213 | 2.389 |
| 11/13/15 | 8.3 | 4.172 | 2.345 |
| 11/16/15 | 8.3 | 4.168 | 2.345 |
| 11/17/15 | 8.3 | 4.171 | 2.349 |
| 11/18/15 | 8.3 | 4.17 | 2.354 |
| 11/19/15 | 8.3 | 4.137 | 2.325 |
| 11/20/15 | 8.3 | 4.136 | 2.328 |
| 11/23/15 | 8.3 | 4.14 | 2.325 |
| 11/24/15 | 8.3 | 4.132 | 2.322 |
| 11/25/15 | 8.3 | 4.1 | 2.296 |
| 11/26/15 | 8.3 | 4.087 | 2.281 |
| 11/27/15 | 8.3 | 4.088 | 2.292 |
| 11/30/15 | 8.3 | 4.085 | 2.286 |
| 12/1/15 | 8.3 | 4.028 | 2.226 |
| 12/2/15 | 8.3 | 4.022 | 2.228 |
| 12/3/15 | 8.3 | 4.13 | 2.325 |
| 12/4/15 | 8.3 | 4.101 | 2.298 |
| 12/7/15 | 8.3 | 4.038 | 2.238 |
| 12/8/15 | 8.3 | 4.059 | 2.238 |
| 12/9/15 | 8.3 | 4.065 | 2.238 |
| 12/10/15 | 8.3 | 4.059 | 2.237 |
| 12/11/15 | 8.3 | 4.004 | 2.162 |
| 12/14/15 | 8.3 | 4.051 | 2.212 |
| 12/15/15 | 8.3 | 4.075 | 2.223 |
| 12/16/15 | 8.3 | 4.077 | 2.225 |
| 12/17/15 | 8.3 | 4.029 | 2.156 |
| 12/18/15 | 8.3 | 3.998 | 2.122 |
| 12/21/15 | 8.3 | 4.006 | 2.109 |
| 12/22/15 | 8.3 | 4.027 | 2.14 |
| 12/23/15 | 8.3 | 4.059 | 2.166 |
| 12/24/15 | 8.3 | 4.029 | 2.137 |
| 12/29/15 | 8.3 | 4.063 | 2.172 |
| 12/30/15 | 8.3 | 4.054 | 2.157 |
| 12/31/15 | 8.3 | 4.05 | 2.149 |
| 1/4/16 | 8.3 | 4.034 | 2.137 |
| 1/5/16 | 8.3 | 4.037 | 2.132 |
| 1/6/16 | 8.3 | 3.986 | 2.085 |
| 1/7/16 | 8.3 | 3.983 | 2.072 |
| 1/8/16 | 8.3 | 3.98 | 2.061 |
| 1/11/16 | 8.3 | 4.016 | 2.094 |
| 1/12/16 | 8.3 | 3.986 | 2.044 |
| 1/13/16 | 8.3 | 3.948 | 2.038 |
| 1/14/16 | 8.3 | 3.984 | 2.053 |
| 1/15/16 | 8.3 | 3.945 | 1.984 |
| 1/18/16 | 8.3 | 3.967 | 1.984 |
| 1/19/16 | 8.3 | 3.974 | 1.991 |
| 1/20/16 | 8.3 | 3.946 | 1.937 |
| 1/21/16 | 8.3 | 4.028 | 2.026 |
| 1/22/16 | 8.3 | 4.109 | 2.099 |
| 1/25/16 | 8.3 | 4.076 | 2.059 |
| 1/26/16 | 8.3 | 4.1 | 2.071 |
| 1/27/16 | 8.3 | 4.075 | 2.056 |
| 1/28/16 | 8.3 | 4.079 | 2.047 |
| 1/29/16 | 8.3 | 4.071 | 2.035 |
| 2/1/16 | 8.3 | 4.095 | 2.046 |
| 2/2/16 | 8.3 | 3.996 | 1.944 |
| 2/3/16 | 8.3 | 4.03 | 1.974 |
| 2/4/16 | 8.3 | 4.029 | 1.966 |
| 2/5/16 | 8.3 | 4.013 | 1.948 |
| 2/8/16 | 8.3 | 3.937 | 1.872 |
| 2/9/16 | 8.3 | 3.946 | 1.86 |
| 2/10/16 | 8.3 | 3.896 | 1.818 |
| 2/11/16 | 8.3 | 3.911 | 1.846 |
| 2/12/16 | 8.3 | 4.025 | 1.931 |
| 2/16/16 | 8.3 | 4.056 | 1.962 |
| 2/17/16 | 8.3 | 4.071 | 1.974 |
| 2/18/16 | 8.3 | 4.019 | 1.914 |
| 2/19/16 | 8.3 | 3.998 | 1.92 |
| 2/22/16 | 8.3 | 3.998 | 1.921 |
| 2/23/16 | 8.3 | 3.989 | 1.916 |
| 2/24/16 | 8.3 | 3.994 | 1.939 |
| 2/25/16 | 8.3 | 3.977 | 1.938 |
| 2/26/16 | 8.3 | 4.012 | 1.964 |
| 2/29/16 | 8.3 | 4.015 | 1.975 |
| 3/1/16 | 8.3 | 4.071 | 2.031 |
| 3/2/16 | 8.3 | 4.067 | 2.046 |
| 3/3/16 | 8.3 | 4.026 | 2.034 |
| 3/4/16 | 8.3 | 4.044 | 2.066 |
| 3/7/16 | 8.3 | 4.052 | 2.075 |
| 3/8/16 | 8.3 | 3.95 | 1.992 |
| 3/9/16 | 8.3 | 3.999 | 2.036 |
| 3/10/16 | 8.3 | 4.005 | 2.068 |
| 3/11/16 | 8.3 | 4.035 | 2.116 |
| 3/14/16 | 8.3 | 3.95 | 2.092 |
| 3/15/16 | 8.3 | 3.935 | 2.085 |
| 3/16/16 | 8.3 | 3.922 | 2.07 |
| 3/17/16 | 8.3 | 3.898 | 2.075 |
| 3/18/16 | 8.3 | 3.877 | 2.078 |
| 3/21/16 | 8.3 | 3.87 | 2.096 |
| 3/22/16 | 8.3 | 3.866 | 2.099 |
| 3/23/16 | 8.3 | 3.782 | 2.035 |
| 3/24/16 | 8.3 | 3.79 | 2.052 |
| 3/28/16 | 8.3 | 3.776 | 2.04 |
| 3/29/16 | 8.3 | 3.707 | 1.976 |
| 3/30/16 | 8.3 | 3.733 | 2.009 |
| 3/31/16 | 8.3 | 3.731 | 2.008 |
| 4/1/16 | 8.3 | 3.74 | 2.007 |
| 4/4/16 | 8.3 | 3.715 | 1.986 |
| 4/5/16 | 8.3 | 3.65 | 1.937 |
| 4/6/16 | 8.3 | 3.676 | 1.97 |
| 4/7/16 | 8.3 | 3.634 | 1.92 |
| 4/8/16 | 8.3 | 3.667 | 1.954 |
| 4/11/16 | 8.3 | 3.673 | 1.955 |
| 4/12/16 | 8.3 | 3.705 | 1.992 |
| 4/13/16 | 8.3 | 3.679 | 1.973 |
| 4/14/16 | 8.3 | 3.706 | 1.999 |
| 4/15/16 | 8.3 | 3.674 | 1.975 |
| 4/18/16 | 8.3 | 3.701 | 1.994 |
| 4/19/16 | 8.3 | 3.714 | 2.013 |
| 4/20/16 | 8.3 | 3.722 | 2.033 |
| 4/21/16 | 8.3 | 3.737 | 2.05 |
| 4/22/16 | 8.3 | 3.749 | 2.08 |
| 4/25/16 | 8.3 | 3.766 | 2.1 |
| 4/26/16 | 8.3 | 3.726 | 2.094 |
| 4/27/16 | 8.3 | 3.684 | 2.059 |
| 4/28/16 | 8.3 | 3.661 | 2.055 |
| 4/29/16 | 8.3 | 3.663 | 2.084 |
| 5/2/16 | 8.3 | 3.688 | 2.124 |
| 5/3/16 | 8.3 | 3.635 | 2.072 |
| 5/4/16 | 8.3 | 3.6 | 2.035 |
| 5/5/16 | 8.3 | 3.566 | 1.988 |
| 5/6/16 | 8.3 | 3.586 | 1.99 |
| 5/9/16 | 8.3 | 3.584 | 1.968 |
| 5/10/16 | 8.3 | 3.584 | 1.964 |
| 5/11/16 | 8.3 | 3.59 | 1.966 |
| 5/12/16 | 8.3 | 3.618 | 1.985 |
| 5/13/16 | 8.3 | 3.587 | 1.95 |
| 5/16/16 | 8.3 | 3.636 | 1.988 |
| 5/17/16 | 8.3 | 3.629 | 1.98 |
| 5/18/16 | 8.3 | 3.673 | 2.005 |
| 5/19/16 | 8.3 | 3.655 | 1.984 |
| 5/20/16 | 8.3 | 3.675 | 1.989 |
| 5/24/16 | 8.3 | 3.693 | 2.002 |
| 5/25/16 | 8.3 | 3.706 | 2.012 |
| 5/26/16 | 8.3 | 3.672 | 1.977 |
| 5/27/16 | 8.3 | 3.688 | 1.985 |
| 5/30/16 | 8.3 | 3.687 | 1.982 |
| 5/31/16 | 8.3 | 3.659 | 1.961 |
| 6/1/16 | 8.3 | 3.658 | 1.948 |
| 6/2/16 | 8.3 | 3.613 | 1.895 |
| 6/3/16 | 8.3 | 3.566 | 1.841 |
| 6/6/16 | 8.3 | 3.623 | 1.885 |
| 6/7/16 | 8.3 | 3.619 | 1.881 |
| 6/8/16 | 8.3 | 3.608 | 1.867 |
| 6/9/16 | 8.3 | 3.587 | 1.845 |
| 6/10/16 | 8.3 | 3.537 | 1.799 |
| 6/13/16 | 8.3 | 3.536 | 1.785 |
| 6/14/16 | 8.3 | 3.544 | 1.782 |
| 6/15/16 | 8.3 | 3.522 | 1.759 |
| 6/16/16 | 8.3 | 3.521 | 1.76 |
| 6/17/16 | 8.3 | 3.533 | 1.768 |
| 6/20/16 | 8.3 | 3.606 | 1.842 |
| 6/21/16 | 8.3 | 3.649 | 1.886 |
| 6/22/16 | 8.3 | 3.633 | 1.872 |
| 6/23/16 | 8.3 | 3.67 | 1.917 |
| 6/24/16 | 8.3 | 3.597 | 1.798 |
| 6/27/16 | 8.3 | 3.515 | 1.72 |
| 6/28/16 | 8.3 | 3.52 | 1.728 |
| 6/29/16 | 8.3 | 3.547 | 1.765 |
| 6/30/16 | 8.3 | 3.501 | 1.716 |
| 7/4/16 | 8.3 | 3.455 | 1.674 |
| 7/5/16 | 8.3 | 3.38 | 1.601 |
| 7/6/16 | 8.3 | 3.342 | 1.554 |
| 7/7/16 | 8.3 | 3.34 | 1.556 |
| 7/8/16 | 8.3 | 3.325 | 1.548 |
| 7/11/16 | 8.3 | 3.337 | 1.559 |
| 7/12/16 | 8.3 | 3.428 | 1.651 |
| 7/13/16 | 8.3 | 3.377 | 1.613 |
| 7/14/16 | 8.3 | 3.425 | 1.678 |
| 7/15/16 | 8.3 | 3.496 | 1.709 |
| 7/18/16 | 8.3 | 3.486 | 1.733 |
| 7/19/16 | 8.3 | 3.462 | 1.708 |
| 7/20/16 | 8.3 | 3.491 | 1.749 |
| 7/21/16 | 8.3 | 3.486 | 1.744 |
| 7/22/16 | 8.3 | 3.447 | 1.73 |
| 7/25/16 | 8.3 | 3.444 | 1.727 |
| 7/26/16 | 8.3 | 3.438 | 1.731 |
| 7/27/16 | 8.3 | 3.4 | 1.688 |
| 7/28/16 | 8.3 | 3.395 | 1.685 |
| 7/29/16 | 8.3 | 3.358 | 1.641 |
| 8/2/16 | 8.3 | 3.383 | 1.674 |
| 8/3/16 | 8.3 | 3.391 | 1.674 |
| 8/4/16 | 8.3 | 3.36 | 1.636 |
| 8/5/16 | 8.3 | 3.4 | 1.682 |
| 8/8/16 | 8.3 | 3.399 | 1.677 |
| 8/9/16 | 8.3 | 3.342 | 1.632 |
| 8/10/16 | 8.3 | 3.326 | 1.608 |
| 8/11/16 | 8.3 | 3.368 | 1.64 |
| 8/12/16 | 8.3 | 3.344 | 1.617 |
| 8/15/16 | 8.3 | 3.365 | 1.646 |
| 8/16/16 | 8.3 | 3.39 | 1.66 |
| 8/17/16 | 8.3 | 3.394 | 1.664 |
| 8/18/16 | 8.3 | 3.389 | 1.661 |
| 8/19/16 | 8.3 | 3.408 | 1.688 |
| 8/22/16 | 8.3 | 3.359 | 1.639 |
| 8/23/16 | 8.3 | 3.354 | 1.639 |
| 8/24/16 | 8.3 | 3.354 | 1.647 |
| 8/25/16 | 8.3 | 3.38 | 1.672 |
| 8/26/16 | 8.3 | 3.387 | 1.688 |
| 8/29/16 | 8.3 | 3.327 | 1.629 |
| 8/30/16 | 8.3 | 3.322 | 1.628 |
| 8/31/16 | 8.3 | 3.317 | 1.628 |
| 9/1/16 | 8.3 | 3.309 | 1.62 |
| 9/2/16 | 8.3 | 3.344 | 1.658 |
| 9/6/16 | 8.3 | 3.321 | 1.626 |
| 9/7/16 | 8.3 | 3.297 | 1.617 |
| 9/8/16 | 8.3 | 3.376 | 1.697 |
| 9/9/16 | 8.3 | 3.451 | 1.771 |
| 9/12/16 | 8.3 | 3.467 | 1.786 |
| 9/13/16 | 8.3 | 3.537 | 1.862 |
| 9/14/16 | 8.3 | 3.505 | 1.827 |
| 9/15/16 | 8.3 | 3.52 | 1.839 |
| 9/16/16 | 8.3 | 3.508 | 1.824 |
| 9/19/16 | 8.3 | 3.505 | 1.825 |
| 9/20/16 | 8.3 | 3.472 | 1.788 |
| 9/21/16 | 8.3 | 3.46 | 1.776 |
| 9/22/16 | 8.3 | 3.409 | 1.732 |
| 9/23/16 | 8.3 | 3.368 | 1.698 |
| 9/26/16 | 8.3 | 3.33 | 1.66 |
| 9/27/16 | 8.3 | 3.308 | 1.635 |
| 9/28/16 | 8.3 | 3.316 | 1.644 |
| 9/29/16 | 8.3 | 3.301 | 1.625 |
| 9/30/16 | 8.3 | 3.35 | 1.661 |
| 10/3/16 | 8.3 | 3.35 | 1.673 |
| 10/4/16 | 8.3 | 3.417 | 1.733 |
| 10/5/16 | 8.3 | 3.451 | 1.759 |
| 10/6/16 | 8.3 | 3.482 | 1.796 |
| 10/7/16 | 8.3 | 3.506 | 1.818 |
| 10/11/16 | 8.3 | 3.526 | 1.835 |
| 10/12/16 | 8.3 | 3.526 | 1.831 |
| 10/13/16 | 8.3 | 3.481 | 1.806 |
| 10/14/16 | 8.3 | 3.559 | 1.87 |
| 10/17/16 | 8.3 | 3.527 | 1.846 |
| 10/18/16 | 8.3 | 3.516 | 1.834 |
| 10/19/16 | 8.3 | 3.527 | 1.846 |
| 10/20/16 | 8.3 | 3.507 | 1.829 |
| 10/21/16 | 8.3 | 3.47 | 1.797 |
| 10/24/16 | 8.3 | 3.489 | 1.825 |
| 10/25/16 | 8.3 | 3.482 | 1.812 |
| 10/26/16 | 8.3 | 3.498 | 1.829 |
| 10/27/16 | 8.3 | 3.564 | 1.893 |
| 10/28/16 | 8.3 | 3.563 | 1.891 |
| 10/31/16 | 8.3 | 3.524 | 1.849 |
| 11/1/16 | 8.3 | 3.526 | 1.852 |
| 11/2/16 | 8.3 | 3.496 | 1.828 |
| 11/3/16 | 8.3 | 3.517 | 1.847 |
| 11/4/16 | 8.3 | 3.479 | 1.816 |
| 11/7/16 | 8.3 | 3.541 | 1.871 |
| 11/8/16 | 8.3 | 3.588 | 1.912 |
| 11/9/16 | 8.3 | 3.699 | 2.018 |
| 11/10/16 | 8.3 | 3.728 | 2.07 |
| 11/14/16 | 8.3 | 3.85 | 2.194 |
| 11/15/16 | 8.3 | 3.819 | 2.164 |
| 11/16/16 | 8.3 | 3.758 | 2.126 |
| 11/17/16 | 8.3 | 3.803 | 2.181 |
| 11/18/16 | 8.3 | 3.842 | 2.212 |
| 11/21/16 | 8.3 | 3.828 | 2.202 |
| 11/22/16 | 8.3 | 3.803 | 2.18 |
| 11/23/16 | 8.3 | 3.802 | 2.168 |
| 11/24/16 | 8.3 | 3.818 | 2.181 |
| 11/25/16 | 8.3 | 3.78 | 2.147 |
| 11/28/16 | 8.3 | 3.743 | 2.115 |
| 11/29/16 | 8.3 | 3.72 | 2.092 |
| 11/30/16 | 8.3 | 3.782 | 2.166 |
| 12/1/16 | 8.3 | 3.859 | 2.262 |
| 12/2/16 | 8.3 | 3.812 | 2.224 |
| 12/5/16 | 8.3 | 3.796 | 2.221 |
| 12/6/16 | 8.3 | 3.802 | 2.238 |
| 12/7/16 | 8.3 | 3.768 | 2.207 |
| 12/8/16 | 8.3 | 3.838 | 2.278 |
| 12/9/16 | 8.3 | 3.904 | 2.342 |
| 12/12/16 | 8.3 | 3.941 | 2.377 |
| 12/13/16 | 8.3 | 3.92 | 2.376 |
| 12/14/16 | 8.3 | 3.928 | 2.391 |
| 12/15/16 | 8.3 | 3.956 | 2.412 |
| 12/16/16 | 8.3 | 3.961 | 2.425 |
| 12/19/16 | 8.3 | 3.93 | 2.386 |
| 12/20/16 | 8.3 | 3.938 | 2.399 |
| 12/21/16 | 8.3 | 3.93 | 2.398 |
| 12/22/16 | 8.3 | 3.937 | 2.408 |
| 12/23/16 | 8.3 | 3.916 | 2.388 |
| 12/28/16 | 8.3 | 3.865 | 2.333 |
| 12/29/16 | 8.3 | 3.847 | 2.318 |
| 12/30/16 | 8.3 | 3.835 | 2.312 |
| 1/3/17 | 8.5 | 3.85 | 2.329 |
| 1/4/17 | 8.5 | 3.803 | 2.296 |
| 1/5/17 | 8.5 | 3.759 | 2.26 |
| 1/6/17 | 8.5 | 3.803 | 2.317 |
| 1/9/17 | 8.5 | 3.772 | 2.278 |
| 1/10/17 | 8.5 | 3.769 | 2.282 |
| 1/11/17 | 8.5 | 3.756 | 2.281 |
| 1/12/17 | 8.5 | 3.738 | 2.266 |
| 1/13/17 | 8.5 | 3.796 | 2.316 |
| 1/16/17 | 8.5 | 3.772 | 2.3 |
| 1/17/17 | 8.5 | 3.759 | 2.286 |
| 1/18/17 | 8.5 | 3.8 | 2.321 |
| 1/19/17 | 8.5 | 3.849 | 2.372 |
| 1/20/17 | 8.5 | 3.857 | 2.383 |
| 1/23/17 | 8.5 | 3.808 | 2.327 |
| 1/24/17 | 8.5 | 3.868 | 2.392 |
| 1/25/17 | 8.5 | 3.943 | 2.457 |
| 1/26/17 | 8.5 | 3.942 | 2.459 |
| 1/27/17 | 8.5 | 3.911 | 2.428 |
| 1/30/17 | 8.5 | 3.912 | 2.435 |
| 1/31/17 | 8.5 | 3.885 | 2.408 |
| 2/1/17 | 8.5 | 3.886 | 2.405 |
| 2/2/17 | 8.5 | 3.883 | 2.411 |
| 2/3/17 | 8.5 | 3.898 | 2.421 |
| 2/6/17 | 8.5 | 3.852 | 2.377 |
| 2/7/17 | 8.5 | 3.829 | 2.358 |
| 2/8/17 | 8.5 | 3.76 | 2.293 |
| 2/9/17 | 8.5 | 3.825 | 2.351 |
| 2/10/17 | 8.5 | 3.836 | 2.367 |
| 2/13/17 | 8.5 | 3.876 | 2.408 |
| 2/14/17 | 8.5 | 3.904 | 2.433 |
| 2/15/17 | 8.5 | 3.923 | 2.461 |
| 2/16/17 | 8.5 | 3.884 | 2.435 |
| 2/17/17 | 8.5 | 3.861 | 2.409 |
| 2/21/17 | 8.5 | 3.879 | 2.424 |
| 2/22/17 | 8.5 | 3.869 | 2.43 |
| 2/23/17 | 8.5 | 3.839 | 2.393 |
| 2/24/17 | 8.5 | 3.773 | 2.328 |
| 2/27/17 | 8.5 | 3.803 | 2.364 |
| 2/28/17 | 8.5 | 3.783 | 2.342 |
| 3/1/17 | 8.5 | 3.84 | 2.394 |
| 3/2/17 | 8.5 | 3.842 | 2.398 |
| 3/3/17 | 8.5 | 3.847 | 2.407 |
| 3/6/17 | 8.5 | 3.84 | 2.415 |
| 3/7/17 | 8.5 | 3.855 | 2.43 |
| 3/8/17 | 8.5 | 3.897 | 2.467 |
| 3/9/17 | 8.5 | 3.927 | 2.493 |
| 3/10/17 | 8.5 | 3.921 | 2.481 |
| 3/13/17 | 8.5 | 3.962 | 2.524 |
| 3/14/17 | 8.5 | 3.919 | 2.489 |
| 3/15/17 | 8.5 | 3.858 | 2.417 |
| 3/16/17 | 8.5 | 3.898 | 2.45 |
| 3/17/17 | 8.5 | 3.857 | 2.411 |
| 3/20/17 | 8.5 | 3.832 | 2.389 |
| 3/21/17 | 8.5 | 3.81 | 2.363 |
| 3/22/17 | 8.5 | 3.786 | 2.342 |
| 3/23/17 | 8.5 | 3.781 | 2.347 |
| 3/24/17 | 8.5 | 3.739 | 2.308 |
| 3/27/17 | 8.5 | 3.719 | 2.284 |
| 3/28/17 | 8.5 | 3.747 | 2.313 |
| 3/29/17 | 8.5 | 3.721 | 2.285 |
| 3/30/17 | 8.5 | 3.755 | 2.328 |
| 3/31/17 | 8.5 | 3.737 | 2.302 |
| 4/3/17 | 8.5 | 3.684 | 2.253 |
| 4/4/17 | 8.5 | 3.69 | 2.263 |
| 4/5/17 | 8.5 | 3.663 | 2.244 |
| 4/6/17 | 8.5 | 3.643 | 2.229 |
| 4/7/17 | 8.5 | 3.674 | 2.26 |
| 4/10/17 | 8.5 | 3.671 | 2.263 |
| 4/11/17 | 8.5 | 3.627 | 2.221 |
| 4/12/17 | 8.5 | 3.595 | 2.183 |
| 4/13/17 | 8.5 | 3.554 | 2.163 |
| 4/17/17 | 8.5 | 3.566 | 2.182 |
| 4/18/17 | 8.5 | 3.493 | 2.113 |
| 4/19/17 | 8.5 | 3.51 | 2.139 |
| 4/20/17 | 8.5 | 3.53 | 2.15 |
| 4/21/17 | 8.5 | 3.501 | 2.141 |
| 4/24/17 | 8.5 | 3.511 | 2.153 |
| 4/25/17 | 8.5 | 3.528 | 2.192 |
| 4/26/17 | 8.5 | 3.492 | 2.165 |
| 4/27/17 | 8.5 | 3.501 | 2.182 |
| 4/28/17 | 8.5 | 3.474 | 2.162 |
| 5/1/17 | 8.5 | 3.483 | 2.187 |
| 5/2/17 | 8.5 | 3.426 | 2.136 |
| 5/3/17 | 8.5 | 3.439 | 2.145 |
| 5/4/17 | 8.5 | 3.437 | 2.146 |
| 5/5/17 | 8.5 | 3.448 | 2.152 |
| 5/8/17 | 8.5 | 3.492 | 2.205 |
| 5/9/17 | 8.5 | 3.535 | 2.241 |
| 5/10/17 | 8.5 | 3.571 | 2.265 |
| 5/11/17 | 8.5 | 3.564 | 2.246 |
| 5/12/17 | 8.5 | 3.578 | 2.234 |
| 5/15/17 | 8.5 | 3.604 | 2.249 |
| 5/16/17 | 8.5 | 3.59 | 2.224 |
| 5/17/17 | 8.5 | 3.481 | 2.105 |
| 5/18/17 | 8.5 | 3.475 | 2.079 |
| 5/19/17 | 8.5 | 3.501 | 2.105 |
| 5/23/17 | 8.5 | 3.525 | 2.14 |
| 5/24/17 | 8.5 | 3.51 | 2.11 |
| 5/25/17 | 8.5 | 3.492 | 2.092 |
| 5/26/17 | 8.5 | 3.478 | 2.079 |
| 5/29/17 | 8.5 | 3.459 | 2.047 |
| 5/30/17 | 8.5 | 3.474 | 2.06 |
| 5/31/17 | 8.5 | 3.464 | 2.052 |
| 6/1/17 | 8.5 | 3.467 | 2.05 |
| 6/2/17 | 8.5 | 3.427 | 2.015 |
| 6/5/17 | 8.5 | 3.438 | 2.024 |
| 6/6/17 | 8.5 | 3.414 | 1.999 |
| 6/7/17 | 8.5 | 3.434 | 2.02 |
| 6/8/17 | 8.5 | 3.451 | 2.033 |
| 6/9/17 | 8.5 | 3.447 | 2.034 |
| 6/12/17 | 8.5 | 3.476 | 2.074 |
| 6/13/17 | 8.5 | 3.51 | 2.112 |
| 6/14/17 | 8.5 | 3.433 | 2.035 |
| 6/15/17 | 8.5 | 3.438 | 2.051 |
| 6/16/17 | 8.5 | 3.424 | 2.035 |
| 6/19/17 | 8.5 | 3.427 | 2.042 |
| 6/20/17 | 8.5 | 3.394 | 2.008 |
| 6/21/17 | 8.5 | 3.384 | 1.999 |
| 6/22/17 | 8.5 | 3.375 | 1.993 |
| 6/23/17 | 8.5 | 3.353 | 1.975 |
| 6/26/17 | 8.5 | 3.331 | 1.957 |
| 6/27/17 | 8.5 | 3.39 | 2.031 |
| 6/28/17 | 8.5 | 3.412 | 2.065 |
| 6/29/17 | 8.5 | 3.453 | 2.118 |
| 6/30/17 | 8.5 | 3.478 | 2.148 |
| 7/4/17 | 8.5 | 3.525 | 2.193 |
| 7/5/17 | 8.5 | 3.502 | 2.154 |
| 7/6/17 | 8.5 | 3.539 | 2.211 |
| 7/7/17 | 8.5 | 3.584 | 2.258 |
| 7/10/17 | 8.5 | 3.586 | 2.265 |
| 7/11/17 | 8.5 | 3.567 | 2.242 |
| 7/12/17 | 8.5 | 3.553 | 2.228 |
| 7/13/17 | 8.5 | 3.574 | 2.25 |
| 7/14/17 | 8.5 | 3.56 | 2.24 |
| 7/17/17 | 8.5 | 3.567 | 2.262 |
| 7/18/17 | 8.5 | 3.543 | 2.235 |
| 7/19/17 | 8.5 | 3.562 | 2.263 |
| 7/20/17 | 8.5 | 3.572 | 2.248 |
| 7/21/17 | 8.5 | 3.57 | 2.25 |
| 7/24/17 | 8.5 | 3.59 | 2.271 |
| 7/25/17 | 8.5 | 3.684 | 2.361 |
| 7/26/17 | 8.5 | 3.668 | 2.353 |
| 7/27/17 | 8.5 | 3.738 | 2.42 |
| 7/28/17 | 8.5 | 3.761 | 2.451 |
| 7/31/17 | 8.5 | 3.788 | 2.465 |
| 8/1/17 | 8.5 | 3.7 | 2.378 |
| 8/2/17 | 8.5 | 3.678 | 2.366 |
| 8/3/17 | 8.5 | 3.64 | 2.324 |
| 8/4/17 | 8.5 | 3.674 | 2.352 |
| 8/8/17 | 8.5 | 3.694 | 2.365 |
| 8/9/17 | 8.5 | 3.668 | 2.342 |
| 8/10/17 | 8.5 | 3.623 | 2.294 |
| 8/11/17 | 8.5 | 3.632 | 2.295 |
| 8/14/17 | 8.5 | 3.654 | 2.319 |
| 8/15/17 | 8.5 | 3.682 | 2.349 |
| 8/16/17 | 8.5 | 3.661 | 2.311 |
| 8/17/17 | 8.5 | 3.644 | 2.29 |
| 8/18/17 | 8.5 | 3.661 | 2.288 |
| 8/21/17 | 8.5 | 3.674 | 2.297 |
| 8/22/17 | 8.5 | 3.701 | 2.319 |
| 8/23/17 | 8.5 | 3.678 | 2.293 |
| 8/24/17 | 8.5 | 3.681 | 2.307 |
| 8/25/17 | 8.5 | 3.679 | 2.298 |
| 8/28/17 | 8.5 | 3.682 | 2.303 |
| 8/29/17 | 8.5 | 3.652 | 2.276 |
| 8/30/17 | 8.5 | 3.655 | 2.269 |
| 8/31/17 | 8.5 | 3.646 | 2.263 |
| 9/1/17 | 8.5 | 3.689 | 2.304 |
| 9/5/17 | 8.5 | 3.656 | 2.275 |
| 9/6/17 | 8.5 | 3.725 | 2.34 |
| 9/7/17 | 8.5 | 3.713 | 2.327 |
| 9/8/17 | 8.5 | 3.739 | 2.344 |
| 9/11/17 | 8.5 | 3.777 | 2.377 |
| 9/12/17 | 8.5 | 3.799 | 2.398 |
| 9/13/17 | 8.5 | 3.818 | 2.42 |
| 9/14/17 | 8.5 | 3.821 | 2.413 |
| 9/15/17 | 8.5 | 3.838 | 2.437 |
| 9/18/17 | 8.5 | 3.838 | 2.435 |
| 9/19/17 | 8.5 | 3.841 | 2.448 |
| 9/20/17 | 8.5 | 3.853 | 2.449 |
| 9/21/17 | 8.5 | 3.861 | 2.459 |
| 9/22/17 | 8.5 | 3.853 | 2.451 |
| 9/25/17 | 8.5 | 3.829 | 2.435 |
| 9/26/17 | 8.5 | 3.846 | 2.452 |
| 9/27/17 | 8.5 | 3.878 | 2.497 |
| 9/28/17 | 8.5 | 3.898 | 2.504 |
| 9/29/17 | 8.5 | 3.854 | 2.472 |
| 10/2/17 | 8.5 | 3.881 | 2.5 |
| 10/3/17 | 8.5 | 3.881 | 2.493 |
| 10/4/17 | 8.5 | 3.87 | 2.488 |
| 10/5/17 | 8.5 | 3.862 | 2.479 |
| 10/6/17 | 8.5 | 3.872 | 2.494 |
| 10/10/17 | 8.5 | 3.859 | 2.482 |
| 10/11/17 | 8.5 | 3.836 | 2.461 |
| 10/12/17 | 8.5 | 3.816 | 2.434 |
| 10/13/17 | 8.5 | 3.773 | 2.392 |
| 10/16/17 | 8.5 | 3.758 | 2.383 |
| 10/17/17 | 8.5 | 3.735 | 2.358 |
| 10/18/17 | 8.5 | 3.732 | 2.372 |
| 10/19/17 | 8.5 | 3.727 | 2.352 |
| 10/20/17 | 8.5 | 3.745 | 2.373 |
| 10/23/17 | 8.5 | 3.738 | 2.37 |
| 10/24/17 | 8.5 | 3.752 | 2.396 |
| 10/25/17 | 8.5 | 3.741 | 2.39 |
| 10/26/17 | 8.5 | 3.714 | 2.379 |
| 10/27/17 | 8.5 | 3.663 | 2.339 |
| 10/30/17 | 8.5 | 3.632 | 2.314 |
| 10/31/17 | 8.5 | 3.616 | 2.302 |
| 11/1/17 | 8.5 | 3.598 | 2.302 |
| 11/2/17 | 8.5 | 3.58 | 2.286 |
| 11/3/17 | 8.5 | 3.562 | 2.269 |
| 11/6/17 | 8.5 | 3.517 | 2.246 |
| 11/7/17 | 8.5 | 3.484 | 2.224 |
| 11/8/17 | 8.5 | 3.504 | 2.254 |
| 11/9/17 | 8.5 | 3.529 | 2.271 |
| 11/10/17 | 8.5 | 3.567 | 2.307 |
| 11/14/17 | 8.5 | 3.544 | 2.278 |
| 11/15/17 | 8.5 | 3.505 | 2.246 |
| 11/16/17 | 8.5 | 3.559 | 2.296 |
| 11/17/17 | 8.5 | 3.539 | 2.276 |
| 11/20/17 | 8.5 | 3.567 | 2.294 |
| 11/21/17 | 8.5 | 3.53 | 2.262 |
| 11/22/17 | 8.5 | 3.515 | 2.25 |
| 11/23/17 | 8.5 | 3.504 | 2.239 |
| 11/24/17 | 8.5 | 3.501 | 2.233 |
| 11/27/17 | 8.5 | 3.494 | 2.224 |
| 11/28/17 | 8.5 | 3.484 | 2.203 |
| 11/29/17 | 8.5 | 3.51 | 2.235 |
| 11/30/17 | 8.5 | 3.511 | 2.23 |
| 12/1/17 | 8.5 | 3.484 | 2.205 |
| 12/4/17 | 8.5 | 3.498 | 2.216 |
| 12/5/17 | 8.5 | 3.473 | 2.19 |
| 12/6/17 | 8.5 | 3.437 | 2.166 |
| 12/7/17 | 8.5 | 3.453 | 2.168 |
| 12/8/17 | 8.5 | 3.449 | 2.167 |
| 12/11/17 | 8.5 | 3.444 | 2.162 |
| 12/12/17 | 8.5 | 3.449 | 2.167 |
| 12/13/17 | 8.5 | 3.437 | 2.155 |
| 12/14/17 | 8.5 | 3.436 | 2.148 |
| 12/15/17 | 8.5 | 3.386 | 2.114 |
| 12/18/17 | 8.5 | 3.414 | 2.135 |
| 12/19/17 | 8.5 | 3.468 | 2.198 |
| 12/20/17 | 8.5 | 3.515 | 2.248 |
| 12/21/17 | 8.5 | 3.521 | 2.25 |
| 12/22/17 | 8.5 | 3.516 | 2.248 |
| 12/27/17 | 8.5 | 3.465 | 2.196 |
| 12/28/17 | 8.5 | 3.502 | 2.239 |
| 12/29/17 | 8.5 | 3.536 | 2.266 |
| 1/2/18 | 8.5 | 3.584 | 2.318 |
| 1/3/18 | 8.5 | 3.558 | 2.294 |
| 1/4/18 | 8.5 | 3.584 | 2.32 |
| 1/5/18 | 8.5 | 3.619 | 2.359 |
| 1/8/18 | 8.5 | 3.614 | 2.354 |
| 1/9/18 | 8.5 | 3.648 | 2.41 |
| 1/10/18 | 8.5 | 3.626 | 2.39 |
| 1/11/18 | 8.5 | 3.616 | 2.377 |
| 1/12/18 | 8.5 | 3.607 | 2.37 |
| 1/15/18 | 8.5 | 3.594 | 2.371 |
| 1/16/18 | 8.5 | 3.568 | 2.344 |
| 1/17/18 | 8.5 | 3.562 | 2.347 |
| 1/18/18 | 8.5 | 3.567 | 2.35 |
| 1/19/18 | 8.5 | 3.593 | 2.375 |
| 1/22/18 | 8.5 | 3.585 | 2.366 |
| 1/23/18 | 8.5 | 3.567 | 2.353 |
| 1/24/18 | 8.5 | 3.58 | 2.372 |
| 1/25/18 | 8.5 | 3.547 | 2.342 |
| 1/26/18 | 8.5 | 3.539 | 2.33 |
| 1/29/18 | 8.5 | 3.552 | 2.343 |
| 1/30/18 | 8.5 | 3.588 | 2.376 |
| 1/31/18 | 8.5 | 3.578 | 2.36 |
| 2/1/18 | 8.5 | 3.63 | 2.416 |
| 2/2/18 | 8.5 | 3.65 | 2.438 |
| 2/5/18 | 8.5 | 3.664 | 2.417 |
| 2/6/18 | 8.5 | 3.717 | 2.46 |
| 2/7/18 | 8.5 | 3.727 | 2.475 |
| 2/8/18 | 8.5 | 3.742 | 2.497 |
| 2/9/18 | 8.5 | 3.766 | 2.499 |
| 2/12/18 | 8.5 | 3.754 | 2.489 |
| 2/13/18 | 8.5 | 3.743 | 2.476 |
| 2/14/18 | 8.5 | 3.782 | 2.507 |
| 2/15/18 | 8.5 | 3.779 | 2.507 |
| 2/16/18 | 8.5 | 3.737 | 2.464 |
| 2/20/18 | 8.5 | 3.743 | 2.463 |
| 2/21/18 | 8.5 | 3.76 | 2.491 |
| 2/22/18 | 8.5 | 3.734 | 2.453 |
| 2/23/18 | 8.5 | 3.684 | 2.399 |
| 2/26/18 | 8.5 | 3.691 | 2.41 |
| 2/27/18 | 8.5 | 3.714 | 2.434 |
| 2/28/18 | 8.5 | 3.651 | 2.375 |
| 3/1/18 | 8.5 | 3.617 | 2.33 |
| 3/2/18 | 8.5 | 3.653 | 2.362 |
| 3/5/18 | 8.5 | 3.664 | 2.373 |
| 3/6/18 | 8.5 | 3.691 | 2.396 |
| 3/7/18 | 8.5 | 3.715 | 2.413 |
| 3/8/18 | 8.5 | 3.709 | 2.401 |
| 3/9/18 | 8.5 | 3.753 | 2.443 |
| 3/12/18 | 8.5 | 3.724 | 2.413 |
| 3/13/18 | 8.5 | 3.693 | 2.384 |
| 3/14/18 | 8.5 | 3.631 | 2.324 |
| 3/15/18 | 8.5 | 3.594 | 2.295 |
| 3/16/18 | 8.5 | 3.601 | 2.287 |
| 3/19/18 | 8.5 | 3.608 | 2.305 |
| 3/20/18 | 8.5 | 3.638 | 2.341 |
| 3/21/18 | 8.5 | 3.683 | 2.372 |
| 3/22/18 | 8.5 | 3.607 | 2.299 |
| 3/23/18 | 8.5 | 3.625 | 2.313 |
| 3/26/18 | 8.5 | 3.68 | 2.349 |
| 3/27/18 | 8.5 | 3.605 | 2.285 |
| 3/28/18 | 8.5 | 3.611 | 2.257 |
| 3/29/18 | 8.5 | 3.606 | 2.228 |
| 4/2/18 | 8.5 | 3.622 | 2.25 |
| 4/3/18 | 8.5 | 3.669 | 2.293 |
| 4/4/18 | 8.5 | 3.709 | 2.329 |
| 4/5/18 | 8.5 | 3.731 | 2.341 |
| 4/6/18 | 8.5 | 3.693 | 2.307 |
| 4/9/18 | 8.5 | 3.671 | 2.291 |
| 4/10/18 | 8.5 | 3.675 | 2.318 |
| 4/11/18 | 8.5 | 3.678 | 2.321 |
| 4/12/18 | 8.5 | 3.727 | 2.392 |
| 4/13/18 | 8.5 | 3.688 | 2.35 |
| 4/16/18 | 8.5 | 3.717 | 2.374 |
| 4/17/18 | 8.5 | 3.672 | 2.345 |
| 4/18/18 | 8.5 | 3.716 | 2.388 |
| 4/19/18 | 8.5 | 3.758 | 2.426 |
| 4/20/18 | 8.5 | 3.772 | 2.445 |
| 4/23/18 | 8.5 | 3.772 | 2.444 |
| 4/24/18 | 8.5 | 3.765 | 2.451 |
| 4/25/18 | 8.5 | 3.804 | 2.475 |
| 4/26/18 | 8.5 | 3.772 | 2.443 |
| 4/27/18 | 8.5 | 3.737 | 2.412 |
| 4/30/18 | 8.5 | 3.727 | 2.401 |
| 5/1/18 | 8.5 | 3.758 | 2.41 |
| 5/2/18 | 8.5 | 3.775 | 2.433 |
| 5/3/18 | 8.5 | 3.748 | 2.406 |
| 5/4/18 | 8.5 | 3.753 | 2.408 |
| 5/7/18 | 8.5 | 3.761 | 2.411 |
| 5/8/18 | 8.5 | 3.771 | 2.421 |
| 5/9/18 | 8.5 | 3.8 | 2.448 |
| 5/10/18 | 8.5 | 3.789 | 2.431 |
| 5/11/18 | 8.5 | 3.762 | 2.407 |
| 5/14/18 | 8.5 | 3.809 | 2.46 |
| 5/15/18 | 8.5 | 3.868 | 2.514 |
| 5/16/18 | 8.5 | 3.865 | 2.514 |
| 5/17/18 | 8.5 | 3.878 | 2.529 |
| 5/18/18 | 8.5 | 3.845 | 2.496 |
| 5/22/18 | 8.5 | 3.842 | 2.497 |
| 5/23/18 | 8.5 | 3.801 | 2.449 |
| 5/24/18 | 8.5 | 3.765 | 2.423 |
| 5/25/18 | 8.5 | 3.73 | 2.383 |
| 5/28/18 | 8.5 | 3.684 | 2.344 |
| 5/29/18 | 8.5 | 3.59 | 2.249 |
| 5/30/18 | 8.5 | 3.638 | 2.297 |
| 5/31/18 | 8.5 | 3.615 | 2.264 |
| 6/1/18 | 8.5 | 3.629 | 2.281 |
| 6/4/18 | 8.5 | 3.668 | 2.315 |
| 6/5/18 | 8.5 | 3.655 | 2.305 |
| 6/6/18 | 8.5 | 3.702 | 2.356 |
| 6/7/18 | 8.5 | 3.68 | 2.335 |
| 6/8/18 | 8.5 | 3.708 | 2.364 |
| 6/11/18 | 8.5 | 3.703 | 2.354 |
| 6/12/18 | 8.5 | 3.683 | 2.335 |
| 6/13/18 | 8.5 | 3.674 | 2.328 |
| 6/14/18 | 8.5 | 3.636 | 2.29 |
| 6/15/18 | 8.5 | 3.591 | 2.245 |
| 6/18/18 | 8.5 | 3.579 | 2.24 |
| 6/19/18 | 8.5 | 3.54 | 2.201 |
| 6/20/18 | 8.5 | 3.57 | 2.228 |
| 6/21/18 | 8.5 | 3.551 | 2.203 |
| 6/22/18 | 8.5 | 3.563 | 2.206 |
| 6/25/18 | 8.5 | 3.548 | 2.182 |
| 6/26/18 | 8.5 | 3.545 | 2.187 |
| 6/27/18 | 8.5 | 3.534 | 2.179 |
| 6/28/18 | 8.5 | 3.586 | 2.205 |
| 6/29/18 | 8.5 | 3.588 | 2.205 |
| 7/3/18 | 8.5 | 3.566 | 2.183 |
| 7/4/18 | 8.5 | 3.589 | 2.203 |
| 7/5/18 | 8.5 | 3.57 | 2.187 |
| 7/6/18 | 8.5 | 3.544 | 2.168 |
| 7/9/18 | 8.5 | 3.591 | 2.218 |
| 7/10/18 | 8.5 | 3.593 | 2.203 |
| 7/11/18 | 8.5 | 3.579 | 2.191 |
| 7/12/18 | 8.5 | 3.598 | 2.201 |
| 7/13/18 | 8.5 | 3.586 | 2.19 |
| 7/16/18 | 8.5 | 3.578 | 2.189 |
| 7/17/18 | 8.5 | 3.565 | 2.173 |
| 7/18/18 | 8.5 | 3.587 | 2.198 |
| 7/19/18 | 8.5 | 3.555 | 2.164 |
| 7/20/18 | 8.5 | 3.613 | 2.219 |
| 7/23/18 | 8.5 | 3.664 | 2.266 |
| 7/24/18 | 8.5 | 3.658 | 2.265 |
| 7/25/18 | 8.5 | 3.692 | 2.32 |
| 7/26/18 | 8.5 | 3.709 | 2.327 |
| 7/27/18 | 8.5 | 3.721 | 2.332 |
| 7/30/18 | 8.5 | 3.721 | 2.339 |
| 7/31/18 | 8.5 | 3.721 | 2.329 |
| 8/1/18 | 8.5 | 3.754 | 2.378 |
| 8/2/18 | 8.5 | 3.764 | 2.382 |
| 8/3/18 | 8.5 | 3.742 | 2.365 |
| 8/7/18 | 8.5 | 3.759 | 2.384 |
| 8/8/18 | 8.5 | 3.748 | 2.371 |
| 8/9/18 | 8.5 | 3.727 | 2.348 |
| 8/10/18 | 8.5 | 3.691 | 2.317 |
| 8/13/18 | 8.5 | 3.699 | 2.322 |
| 8/14/18 | 8.5 | 3.728 | 2.344 |
| 8/15/18 | 8.5 | 3.671 | 2.286 |
| 8/16/18 | 8.5 | 3.655 | 2.271 |
| 8/17/18 | 8.5 | 3.655 | 2.277 |
| 8/20/18 | 8.5 | 3.648 | 2.258 |
| 8/21/18 | 8.5 | 3.654 | 2.266 |
| 8/22/18 | 8.5 | 3.644 | 2.261 |
| 8/23/18 | 8.5 | 3.642 | 2.264 |
| 8/24/18 | 8.5 | 3.647 | 2.258 |
| 8/27/18 | 8.5 | 3.678 | 2.295 |
| 8/28/18 | 8.5 | 3.698 | 2.32 |
| 8/29/18 | 8.5 | 3.709 | 2.323 |
| 8/30/18 | 8.5 | 3.685 | 2.293 |
| 8/31/18 | 8.5 | 3.644 | 2.252 |
| 9/4/18 | 8.5 | 3.649 | 2.256 |
| 9/5/18 | 8.5 | 3.664 | 2.259 |
| 9/6/18 | 8.5 | 3.657 | 2.25 |
| 9/7/18 | 8.5 | 3.71 | 2.299 |
| 9/10/18 | 8.5 | 3.709 | 2.3 |
| 9/11/18 | 8.5 | 3.751 | 2.351 |
| 9/12/18 | 8.5 | 3.755 | 2.352 |
| 9/13/18 | 8.5 | 3.757 | 2.347 |
| 9/14/18 | 8.5 | 3.77 | 2.361 |
| 9/17/18 | 8.5 | 3.775 | 2.356 |
| 9/18/18 | 8.5 | 3.816 | 2.406 |
| 9/19/18 | 8.5 | 3.852 | 2.43 |
| 9/20/18 | 8.5 | 3.856 | 2.427 |
| 9/21/18 | 8.5 | 3.862 | 2.44 |
| 9/24/18 | 8.5 | 3.877 | 2.457 |
| 9/25/18 | 8.5 | 3.889 | 2.467 |
| 9/26/18 | 8.5 | 3.844 | 2.418 |
| 9/27/18 | 8.5 | 3.839 | 2.421 |
| 9/28/18 | 8.5 | 3.843 | 2.422 |
| 10/1/18 | 8.5 | 3.913 | 2.484 |
| 10/2/18 | 8.5 | 3.874 | 2.452 |
| 10/3/18 | 8.5 | 3.937 | 2.536 |
| 10/4/18 | 8.5 | 3.963 | 2.542 |
| 10/5/18 | 8.5 | 4.004 | 2.585 |
| 10/9/18 | 8.5 | 3.979 | 2.559 |
| 10/10/18 | 8.5 | 3.974 | 2.532 |
| 10/11/18 | 8.5 | 3.925 | 2.509 |
| 10/12/18 | 8.5 | 3.929 | 2.513 |
| 10/15/18 | 8.5 | 3.949 | 2.524 |
| 10/16/18 | 8.5 | 3.943 | 2.521 |
| 10/17/18 | 8.5 | 3.956 | 2.541 |
| 10/18/18 | 8.5 | 3.948 | 2.525 |
| 10/19/18 | 8.5 | 3.95 | 2.529 |
| 10/22/18 | 8.5 | 3.944 | 2.519 |
| 10/23/18 | 8.5 | 3.924 | 2.488 |
| 10/24/18 | 8.5 | 3.906 | 2.471 |
| 10/25/18 | 8.5 | 3.931 | 2.474 |
| 10/26/18 | 8.5 | 3.875 | 2.429 |
| 10/29/18 | 8.5 | 3.879 | 2.438 |
| 10/30/18 | 8.5 | 3.94 | 2.494 |
| 10/31/18 | 8.5 | 3.984 | 2.533 |
| 11/1/18 | 8.5 | 3.983 | 2.521 |
| 11/2/18 | 8.5 | 4.03 | 2.571 |
| 11/5/18 | 8.5 | 4.011 | 2.549 |
| 11/6/18 | 8.5 | 4.021 | 2.559 |
| 11/7/18 | 8.5 | 4.005 | 2.559 |
| 11/8/18 | 8.5 | 4.02 | 2.562 |
| 11/9/18 | 8.5 | 3.986 | 2.527 |
| 11/13/18 | 8.5 | 3.955 | 2.491 |
| 11/14/18 | 8.5 | 3.937 | 2.469 |
| 11/15/18 | 8.5 | 3.908 | 2.439 |
| 11/16/18 | 8.5 | 3.903 | 2.42 |
| 11/19/18 | 8.5 | 3.908 | 2.422 |
| 11/20/18 | 8.5 | 3.931 | 2.409 |
| 11/21/18 | 8.5 | 3.947 | 2.419 |
| 11/22/18 | 8.5 | 3.953 | 2.419 |
| 11/23/18 | 8.5 | 3.941 | 2.388 |
| 11/26/18 | 8.5 | 3.961 | 2.404 |
| 11/27/18 | 8.5 | 3.944 | 2.395 |
| 11/28/18 | 8.5 | 3.96 | 2.415 |
| 11/29/18 | 8.5 | 3.965 | 2.412 |
| 11/30/18 | 8.5 | 3.97 | 2.39 |
| 12/3/18 | 8.5 | 3.926 | 2.351 |
| 12/4/18 | 8.5 | 3.859 | 2.262 |
| 12/5/18 | 8.5 | 3.859 | 2.256 |
| 12/6/18 | 8.5 | 3.855 | 2.235 |
| 12/7/18 | 8.5 | 3.865 | 2.234 |
| 12/10/18 | 8.5 | 3.865 | 2.214 |
| 12/11/18 | 8.5 | 3.874 | 2.228 |
| 12/12/18 | 8.5 | 3.919 | 2.28 |
| 12/13/18 | 8.5 | 3.959 | 2.327 |
| 12/14/18 | 8.5 | 3.907 | 2.276 |
| 12/17/18 | 8.5 | 3.86 | 2.219 |
| 12/18/18 | 8.5 | 3.819 | 2.183 |
| 12/19/18 | 8.5 | 3.772 | 2.123 |
| 12/20/18 | 8.5 | 3.797 | 2.165 |
| 12/21/18 | 8.5 | 3.846 | 2.181 |
| 12/24/18 | 8.5 | 3.819 | 2.152 |
| 12/27/18 | 8.5 | 3.835 | 2.169 |
| 12/28/18 | 8.5 | 3.836 | 2.146 |
| 12/31/18 | 8.5 | 3.877 | 2.184 |
| 1/2/19 | 8.5 | 3.822 | 2.12 |
| 1/3/19 | 8.5 | 3.755 | 2.063 |
| 1/4/19 | 8.5 | 3.828 | 2.136 |
| 1/7/19 | 8.5 | 3.844 | 2.159 |
| 1/8/19 | 8.5 | 3.844 | 2.175 |
| 1/9/19 | 8.5 | 3.838 | 2.177 |
| 1/10/19 | 8.5 | 3.843 | 2.191 |
| 1/11/19 | 8.5 | 3.812 | 2.162 |
| 1/14/19 | 8.5 | 3.826 | 2.172 |
| 1/15/19 | 8.5 | 3.846 | 2.194 |
| 1/16/19 | 8.5 | 3.859 | 2.222 |
| 1/17/19 | 8.5 | 3.842 | 2.226 |
| 1/18/19 | 8.5 | 3.848 | 2.257 |
| 1/21/19 | 8.5 | 3.815 | 2.237 |
| 1/22/19 | 8.5 | 3.769 | 2.187 |
| 1/23/19 | 8.5 | 3.77 | 2.188 |
| 1/24/19 | 8.5 | 3.74 | 2.159 |
| 1/25/19 | 8.5 | 3.774 | 2.197 |
| 1/28/19 | 8.5 | 3.751 | 2.181 |
| 1/29/19 | 8.5 | 3.737 | 2.17 |
| 1/30/19 | 8.5 | 3.732 | 2.162 |
| 1/31/19 | 8.5 | 3.68 | 2.138 |
| 2/1/19 | 8.5 | 3.719 | 2.184 |
| 2/4/19 | 8.5 | 3.732 | 2.198 |
| 2/5/19 | 8.5 | 3.708 | 2.18 |
| 2/6/19 | 8.5 | 3.708 | 2.176 |
| 2/7/19 | 8.5 | 3.681 | 2.142 |
| 2/8/19 | 8.5 | 3.678 | 2.138 |
| 2/11/19 | 8.5 | 3.696 | 2.151 |
| 2/12/19 | 8.5 | 3.709 | 2.165 |
| 2/13/19 | 8.5 | 3.716 | 2.177 |
| 2/14/19 | 8.5 | 3.682 | 2.14 |
| 2/15/19 | 8.5 | 3.696 | 2.152 |
| 2/19/19 | 8.5 | 3.685 | 2.142 |
| 2/20/19 | 8.5 | 3.689 | 2.146 |
| 2/21/19 | 8.5 | 3.717 | 2.174 |
| 2/22/19 | 8.5 | 3.686 | 2.141 |
| 2/25/19 | 8.5 | 3.689 | 2.141 |
| 2/26/19 | 8.5 | 3.662 | 2.121 |
| 2/27/19 | 8.5 | 3.7 | 2.162 |
| 2/28/19 | 8.5 | 3.726 | 2.19 |
| 3/1/19 | 8.5 | 3.738 | 2.204 |
| 3/4/19 | 8.5 | 3.704 | 2.168 |
| 3/5/19 | 8.5 | 3.69 | 2.158 |
| 3/6/19 | 8.5 | 3.649 | 2.119 |
| 3/7/19 | 8.5 | 3.611 | 2.068 |
| 3/8/19 | 8.5 | 3.611 | 2.056 |
| 3/11/19 | 8.5 | 3.603 | 2.049 |
| 3/12/19 | 8.5 | 3.575 | 2.027 |
| 3/13/19 | 8.5 | 3.591 | 2.044 |
| 3/14/19 | 8.5 | 3.593 | 2.049 |
| 3/15/19 | 8.5 | 3.566 | 2.021 |
| 3/18/19 | 8.5 | 3.552 | 2.016 |
| 3/19/19 | 8.5 | 3.547 | 2.013 |
| 3/20/19 | 8.5 | 3.525 | 1.985 |
| 3/21/19 | 8.5 | 3.504 | 1.969 |
| 3/22/19 | 8.5 | 3.425 | 1.892 |
| 3/25/19 | 8.5 | 3.389 | 1.847 |
| 3/26/19 | 8.5 | 3.398 | 1.861 |
| 3/27/19 | 8.5 | 3.382 | 1.836 |
| 3/28/19 | 8.5 | 3.392 | 1.858 |
| 3/29/19 | 8.5 | 3.446 | 1.892 |
| 4/1/19 | 8.5 | 3.521 | 1.976 |
| 4/2/19 | 8.5 | 3.511 | 1.953 |
| 4/3/19 | 8.5 | 3.547 | 1.993 |
| 4/4/19 | 8.5 | 3.54 | 1.979 |
| 4/5/19 | 8.5 | 3.537 | 1.971 |
| 4/8/19 | 8.5 | 3.566 | 2.004 |
| 4/9/19 | 8.5 | 3.568 | 2.01 |
| 4/10/19 | 8.5 | 3.541 | 1.978 |
| 4/11/19 | 8.5 | 3.564 | 2.017 |
| 4/12/19 | 8.5 | 3.591 | 2.064 |
| 4/15/19 | 8.5 | 3.561 | 2.058 |
| 4/16/19 | 8.5 | 3.59 | 2.084 |
| 4/17/19 | 8.5 | 3.6 | 2.091 |
| 4/18/19 | 8.5 | 3.56 | 2.051 |
| 4/22/19 | 8.5 | 3.591 | 2.081 |
| 4/23/19 | 8.5 | 3.561 | 2.054 |
| 4/24/19 | 8.5 | 3.501 | 1.996 |
| 4/25/19 | 8.5 | 3.504 | 1.995 |
| 4/26/19 | 8.5 | 3.487 | 1.979 |
| 4/29/19 | 8.5 | 3.513 | 2.005 |
| 4/30/19 | 8.5 | 3.498 | 1.99 |
| 5/1/19 | 8.5 | 3.468 | 1.963 |
| 5/2/19 | 8.5 | 3.518 | 2.008 |
| 5/3/19 | 8.5 | 3.522 | 2.003 |
| 5/6/19 | 8.5 | 3.493 | 1.982 |
| 5/7/19 | 8.5 | 3.453 | 1.942 |
| 5/8/19 | 8.5 | 3.463 | 1.957 |
| 5/9/19 | 8.5 | 3.454 | 1.927 |
| 5/10/19 | 8.5 | 3.478 | 1.958 |
| 5/13/19 | 8.5 | 3.419 | 1.902 |
| 5/14/19 | 8.5 | 3.445 | 1.918 |
| 5/15/19 | 8.5 | 3.423 | 1.904 |
| 5/16/19 | 8.5 | 3.434 | 1.913 |
| 5/17/19 | 8.5 | 3.441 | 1.916 |
| 5/21/19 | 8.5 | 3.488 | 1.974 |
| 5/22/19 | 8.5 | 3.474 | 1.952 |
| 5/23/19 | 8.5 | 3.403 | 1.886 |
| 5/24/19 | 8.5 | 3.394 | 1.866 |
| 5/27/19 | 8.5 | 3.362 | 1.851 |
| 5/28/19 | 8.5 | 3.341 | 1.831 |
| 5/29/19 | 8.5 | 3.352 | 1.827 |
| 5/30/19 | 8.5 | 3.335 | 1.807 |
| 5/31/19 | 8.5 | 3.314 | 1.767 |
| 6/3/19 | 8.5 | 3.267 | 1.701 |
| 6/4/19 | 8.5 | 3.301 | 1.744 |
| 6/5/19 | 8.5 | 3.282 | 1.746 |
| 6/6/19 | 8.5 | 3.28 | 1.742 |
| 6/7/19 | 8.5 | 3.254 | 1.723 |
| 6/10/19 | 8.5 | 3.28 | 1.767 |
| 6/11/19 | 8.5 | 3.275 | 1.775 |
| 6/12/19 | 8.5 | 3.25 | 1.751 |
| 6/13/19 | 8.5 | 3.219 | 1.715 |
| 6/14/19 | 8.5 | 3.197 | 1.697 |
| 6/17/19 | 8.5 | 3.19 | 1.703 |
| 6/18/19 | 8.5 | 3.157 | 1.668 |
| 6/19/19 | 8.5 | 3.159 | 1.673 |
| 6/20/19 | 8.5 | 3.158 | 1.705 |
| 6/21/19 | 8.5 | 3.176 | 1.725 |
| 6/24/19 | 8.5 | 3.158 | 1.71 |
| 6/25/19 | 8.5 | 3.134 | 1.688 |
| 6/26/19 | 8.5 | 3.167 | 1.735 |
| 6/27/19 | 8.5 | 3.139 | 1.712 |
| 6/28/19 | 8.5 | 3.112 | 1.685 |
| 7/2/19 | 8.5 | 3.107 | 1.678 |
| 7/3/19 | 8.5 | 3.079 | 1.658 |
| 7/4/19 | 8.5 | 3.073 | 1.662 |
| 7/5/19 | 8.5 | 3.155 | 1.741 |
| 7/8/19 | 8.5 | 3.145 | 1.728 |
| 7/9/19 | 8.5 | 3.135 | 1.728 |
| 7/10/19 | 8.5 | 3.154 | 1.755 |
| 7/11/19 | 8.5 | 3.193 | 1.803 |
| 7/12/19 | 8.5 | 3.18 | 1.793 |
| 7/15/19 | 8.5 | 3.173 | 1.789 |
| 7/16/19 | 8.5 | 3.172 | 1.783 |
| 7/17/19 | 8.5 | 3.118 | 1.733 |
| 7/18/19 | 8.5 | 3.109 | 1.737 |
| 7/19/19 | 8.5 | 3.103 | 1.731 |
| 7/22/19 | 8.5 | 3.097 | 1.721 |
| 7/23/19 | 8.5 | 3.106 | 1.741 |
| 7/24/19 | 8.5 | 3.072 | 1.704 |
| 7/25/19 | 8.5 | 3.093 | 1.731 |
| 7/26/19 | 8.5 | 3.1 | 1.727 |
| 7/29/19 | 8.5 | 3.113 | 1.739 |
| 7/30/19 | 8.5 | 3.117 | 1.742 |
| 7/31/19 | 8.5 | 3.076 | 1.696 |
| 8/1/19 | 8.5 | 3.006 | 1.631 |
| 8/2/19 | 8.5 | 3.005 | 1.614 |
| 8/6/19 | 8.5 | 2.901 | 1.501 |
| 8/7/19 | 8.5 | 2.922 | 1.485 |
| 8/8/19 | 8.5 | 2.962 | 1.492 |
| 8/9/19 | 8.5 | 3.002 | 1.521 |
| 8/12/19 | 8.5 | 2.93 | 1.448 |
| 8/13/19 | 8.5 | 2.946 | 1.465 |
| 8/14/19 | 8.5 | 2.849 | 1.353 |
| 8/15/19 | 8.5 | 2.8 | 1.299 |
| 8/16/19 | 8.5 | 2.862 | 1.377 |
| 8/19/19 | 8.5 | 2.933 | 1.412 |
| 8/20/19 | 8.5 | 2.92 | 1.394 |
| 8/21/19 | 8.5 | 2.974 | 1.458 |
| 8/22/19 | 8.5 | 3.033 | 1.519 |
| 8/23/19 | 8.5 | 2.962 | 1.432 |
| 8/26/19 | 8.5 | 2.99 | 1.467 |
| 8/27/19 | 8.5 | 2.913 | 1.386 |
| 8/28/19 | 8.5 | 2.895 | 1.372 |
| 8/29/19 | 8.5 | 2.926 | 1.399 |
| 8/30/19 | 8.5 | 2.953 | 1.428 |
| 9/3/19 | 8.5 | 2.935 | 1.39 |
| 9/4/19 | 8.5 | 2.957 | 1.41 |
| 9/5/19 | 8.5 | 3.056 | 1.507 |
| 9/6/19 | 8.5 | 3.038 | 1.499 |
| 9/9/19 | 8.5 | 3.086 | 1.555 |
| 9/10/19 | 8.5 | 3.154 | 1.618 |
| 9/11/19 | 8.5 | 3.172 | 1.635 |
| 9/12/19 | 8.5 | 3.201 | 1.671 |
| 9/13/19 | 8.5 | 3.245 | 1.713 |
| 9/16/19 | 8.5 | 3.201 | 1.67 |
| 9/17/19 | 8.5 | 3.154 | 1.623 |
| 9/18/19 | 8.5 | 3.117 | 1.589 |
| 9/19/19 | 8.5 | 3.092 | 1.579 |
| 9/20/19 | 8.5 | 3.037 | 1.537 |
| 9/23/19 | 8.5 | 3.008 | 1.528 |
| 9/24/19 | 8.5 | 2.96 | 1.479 |
| 9/25/19 | 8.5 | 3.048 | 1.57 |
| 9/26/19 | 8.5 | 3.019 | 1.544 |
| 9/27/19 | 8.5 | 3.022 | 1.545 |
| 9/30/19 | 8.5 | 3.012 | 1.529 |
| 10/1/19 | 8.5 | 2.994 | 1.51 |
| 10/2/19 | 8.5 | 2.985 | 1.488 |
| 10/3/19 | 8.5 | 2.928 | 1.442 |
| 10/4/19 | 8.5 | 2.918 | 1.422 |
| 10/7/19 | 8.5 | 2.974 | 1.487 |
| 10/8/19 | 8.5 | 2.983 | 1.477 |
| 10/9/19 | 8.5 | 3.029 | 1.51 |
| 10/10/19 | 8.5 | 3.098 | 1.588 |
| 10/11/19 | 8.5 | 3.152 | 1.645 |
| 10/15/19 | 8.5 | 3.179 | 1.67 |
| 10/16/19 | 8.5 | 3.182 | 1.668 |
| 10/17/19 | 8.5 | 3.185 | 1.671 |
| 10/18/19 | 8.5 | 3.156 | 1.648 |
| 10/21/19 | 8.5 | 3.169 | 1.669 |
| 10/22/19 | 8.5 | 3.127 | 1.627 |
| 10/23/19 | 8.5 | 3.115 | 1.622 |
| 10/24/19 | 8.5 | 3.129 | 1.635 |
| 10/25/19 | 8.5 | 3.158 | 1.665 |
| 10/28/19 | 8.5 | 3.24 | 1.757 |
| 10/29/19 | 8.5 | 3.224 | 1.739 |
| 10/30/19 | 8.5 | 3.117 | 1.627 |
| 10/31/19 | 8.5 | 3.077 | 1.576 |
| 11/1/19 | 8.5 | 3.1 | 1.606 |
| 11/4/19 | 8.5 | 3.173 | 1.687 |
| 11/5/19 | 8.5 | 3.227 | 1.747 |
| 11/6/19 | 8.5 | 3.167 | 1.686 |
| 11/7/19 | 8.5 | 3.205 | 1.744 |
| 11/8/19 | 8.5 | 3.192 | 1.735 |
| 11/12/19 | 8.5 | 3.188 | 1.742 |
| 11/13/19 | 8.5 | 3.147 | 1.702 |
| 11/14/19 | 8.5 | 3.072 | 1.617 |
| 11/15/19 | 8.5 | 3.077 | 1.623 |
| 11/18/19 | 8.5 | 3.078 | 1.622 |
| 11/19/19 | 8.5 | 3.018 | 1.58 |
| 11/20/19 | 8.5 | 2.975 | 1.554 |
| 11/21/19 | 8.5 | 3.014 | 1.585 |
| 11/22/19 | 8.5 | 3.001 | 1.581 |
| 11/25/19 | 8.5 | 2.991 | 1.572 |
| 11/26/19 | 8.5 | 2.948 | 1.548 |
| 11/27/19 | 8.5 | 2.972 | 1.578 |
| 11/28/19 | 8.5 | 2.966 | 1.574 |
| 11/29/19 | 8.5 | 2.961 | 1.557 |
| 12/2/19 | 8.5 | 2.998 | 1.619 |
| 12/3/19 | 8.5 | 2.939 | 1.55 |
| 12/4/19 | 8.5 | 3.007 | 1.623 |
| 12/5/19 | 8.5 | 3.061 | 1.69 |
| 12/6/19 | 8.5 | 3.053 | 1.683 |
| 12/9/19 | 8.5 | 3.078 | 1.699 |
| 12/10/19 | 8.5 | 3.073 | 1.703 |
| 12/11/19 | 8.5 | 3.042 | 1.681 |
| 12/12/19 | 8.5 | 3.108 | 1.754 |
| 12/13/19 | 8.5 | 3.033 | 1.682 |
| 12/16/19 | 8.5 | 3.077 | 1.724 |
| 12/17/19 | 8.5 | 3.062 | 1.718 |
| 12/18/19 | 8.5 | 3.084 | 1.75 |
| 12/19/19 | 8.5 | 3.035 | 1.717 |
| 12/20/19 | 8.5 | 2.985 | 1.666 |
| 12/23/19 | 8.5 | 2.994 | 1.672 |
| 12/24/19 | 8.5 | 2.984 | 1.668 |
| 12/27/19 | 8.5 | 2.971 | 1.661 |
| 12/30/19 | 8.5 | 3.031 | 1.711 |
| 12/31/19 | 8.5 | 3.075 | 1.763 |
| 1/2/20 | 8.5 | 3.016 | 1.702 |
| 1/3/20 | 8.5 | 2.937 | 1.624 |
| 1/6/20 | 8.5 | 3.002 | 1.688 |
| 1/7/20 | 8.5 | 3.009 | 1.692 |
| 1/8/20 | 8.5 | 3.06 | 1.749 |
| 1/9/20 | 8.5 | 3.04 | 1.723 |
| 1/10/20 | 8.5 | 3.006 | 1.693 |
| 1/13/20 | 8.5 | 3.017 | 1.71 |
| 1/14/20 | 8.5 | 3.002 | 1.686 |
| 1/15/20 | 8.5 | 2.961 | 1.644 |
| 1/16/20 | 8.5 | 2.981 | 1.672 |
| 1/17/20 | 8.5 | 2.98 | 1.673 |
| 1/20/20 | 8.5 | 2.978 | 1.673 |
| 1/21/20 | 8.5 | 2.924 | 1.618 |
| 1/22/20 | 8.5 | 2.889 | 1.573 |
| 1/23/20 | 8.5 | 2.874 | 1.542 |
| 1/24/20 | 8.5 | 2.831 | 1.489 |
| 1/27/20 | 8.5 | 2.794 | 1.428 |
| 1/28/20 | 8.5 | 2.844 | 1.481 |
| 1/29/20 | 8.5 | 2.79 | 1.436 |
| 1/30/20 | 8.5 | 2.814 | 1.45 |
| 1/31/20 | 8.5 | 2.794 | 1.419 |
| 2/3/20 | 8.5 | 2.771 | 1.403 |
| 2/4/20 | 8.5 | 2.817 | 1.454 |
| 2/5/20 | 8.5 | 2.858 | 1.496 |
| 2/6/20 | 8.5 | 2.838 | 1.474 |
| 2/7/20 | 8.5 | 2.788 | 1.424 |
| 2/10/20 | 8.5 | 2.771 | 1.404 |
| 2/11/20 | 8.5 | 2.819 | 1.456 |
| 2/12/20 | 8.5 | 2.861 | 1.499 |
| 2/13/20 | 8.5 | 2.862 | 1.496 |
| 2/14/20 | 8.5 | 2.841 | 1.474 |
| 2/18/20 | 8.5 | 2.806 | 1.439 |
| 2/19/20 | 8.5 | 2.815 | 1.452 |
| 2/20/20 | 8.5 | 2.772 | 1.408 |
| 2/21/20 | 8.5 | 2.732 | 1.37 |
| 2/24/20 | 8.5 | 2.691 | 1.299 |
| 2/25/20 | 8.5 | 2.721 | 1.308 |
| 2/26/20 | 8.5 | 2.771 | 1.343 |
| 2/27/20 | 8.5 | 2.77 | 1.305 |
| 2/28/20 | 8.5 | 2.825 | 1.294 |
| 3/2/20 | 8.5 | 2.877 | 1.337 |
| 3/3/20 | 8.5 | 2.77 | 1.22 |
| 3/4/20 | 8.5 | 2.83 | 1.276 |
| 3/5/20 | 8.5 | 2.729 | 1.172 |
| 3/6/20 | 8.5 | 2.619 | 0.964 |
| 3/9/20 | 8.5 | 2.555 | 0.706 |
| 3/10/20 | 8.5 | 2.701 | 0.886 |
| 3/11/20 | 8.5 | 2.877 | 1.018 |
| 3/12/20 | 8.5 | 3.133 | 1.15 |
| 3/13/20 | 8.5 | 3.291 | 1.292 |
| 3/16/20 | 8.5 | 3.287 | 1.273 |
| 3/17/20 | 8.5 | 3.415 | 1.39 |
| 3/18/20 | 8.5 | 3.59 | 1.487 |
| 3/19/20 | 8.5 | 3.623 | 1.427 |
| 3/20/20 | 8.5 | 3.564 | 1.298 |
| 3/23/20 | 8.5 | 3.523 | 1.266 |
| 3/24/20 | 8.5 | 3.569 | 1.324 |
| 3/25/20 | 8.5 | 3.586 | 1.371 |
| 3/26/20 | 8.5 | 3.572 | 1.356 |
| 3/27/20 | 8.5 | 3.454 | 1.291 |
| 3/30/20 | 8.5 | 3.472 | 1.334 |
| 3/31/20 | 8.5 | 3.434 | 1.333 |
| 4/1/20 | 8.5 | 3.324 | 1.237 |
| 4/2/20 | 8.5 | 3.316 | 1.241 |
| 4/3/20 | 8.5 | 3.334 | 1.239 |
| 4/6/20 | 8.5 | 3.348 | 1.284 |
| 4/7/20 | 8.5 | 3.407 | 1.349 |
| 4/8/20 | 8.5 | 3.406 | 1.364 |
| 4/9/20 | 8.5 | 3.275 | 1.351 |
| 4/13/20 | 8.5 | 3.176 | 1.343 |
| 4/14/20 | 8.5 | 3.198 | 1.421 |
| 4/15/20 | 8.5 | 2.979 | 1.341 |
| 4/16/20 | 8.5 | 2.906 | 1.279 |
| 4/17/20 | 8.5 | 2.962 | 1.313 |
| 4/20/20 | 8.5 | 2.967 | 1.307 |
| 4/21/20 | 8.5 | 2.957 | 1.246 |
| 4/22/20 | 8.5 | 3.006 | 1.252 |
| 4/23/20 | 8.5 | 2.993 | 1.218 |
| 4/24/20 | 8.5 | 2.979 | 1.205 |
| 4/27/20 | 8.5 | 3.001 | 1.23 |
| 4/28/20 | 8.5 | 2.95 | 1.188 |
| 4/29/20 | 8.5 | 2.932 | 1.172 |
| 4/30/20 | 8.5 | 2.891 | 1.144 |
| 5/1/20 | 8.5 | 2.842 | 1.097 |
| 5/4/20 | 8.5 | 2.883 | 1.137 |
| 5/5/20 | 8.5 | 2.869 | 1.126 |
| 5/6/20 | 8.5 | 2.907 | 1.18 |
| 5/7/20 | 8.5 | 2.882 | 1.142 |
| 5/8/20 | 8.5 | 2.918 | 1.188 |
| 5/11/20 | 8.5 | 2.958 | 1.213 |
| 5/12/20 | 8.5 | 2.952 | 1.172 |
| 5/13/20 | 8.5 | 2.964 | 1.14 |
| 5/14/20 | 8.5 | 3.006 | 1.092 |
| 5/15/20 | 8.5 | 3.027 | 1.1 |
| 5/19/20 | 8.5 | 3.072 | 1.168 |
| 5/20/20 | 8.5 | 3.011 | 1.13 |
| 5/21/20 | 8.5 | 2.99 | 1.122 |
| 5/22/20 | 8.5 | 2.951 | 1.092 |
| 5/25/20 | 8.5 | 2.899 | 1.06 |
| 5/26/20 | 8.5 | 2.928 | 1.106 |
| 5/27/20 | 8.5 | 2.929 | 1.121 |
| 5/28/20 | 8.5 | 2.954 | 1.162 |
| 5/29/20 | 8.5 | 2.901 | 1.136 |
| 6/1/20 | 8.5 | 2.854 | 1.143 |
| 6/2/20 | 8.5 | 2.815 | 1.158 |
| 6/3/20 | 8.5 | 2.816 | 1.227 |
| 6/4/20 | 8.5 | 2.835 | 1.278 |
| 6/5/20 | 8.5 | 2.858 | 1.331 |
| 6/8/20 | 8.5 | 2.79 | 1.274 |
| 6/9/20 | 8.5 | 2.746 | 1.218 |
| 6/10/20 | 8.5 | 2.691 | 1.138 |
| 6/11/20 | 8.5 | 2.729 | 1.084 |
| 6/12/20 | 8.5 | 2.725 | 1.078 |
| 6/15/20 | 8.5 | 2.657 | 1.031 |
| 6/16/20 | 8.5 | 2.662 | 1.076 |
| 6/17/20 | 8.5 | 2.633 | 1.048 |
| 6/18/20 | 8.5 | 2.613 | 1.022 |
| 6/19/20 | 8.5 | 2.61 | 1.02 |
| 6/22/20 | 8.5 | 2.593 | 1.011 |
| 6/23/20 | 8.5 | 2.605 | 1.03 |
| 6/24/20 | 8.5 | 2.629 | 1.045 |
| 6/25/20 | 8.5 | 2.622 | 1.031 |
| 6/26/20 | 8.5 | 2.594 | 1.006 |
| 6/29/20 | 8.5 | 2.586 | 1.002 |
| 6/30/20 | 8.5 | 2.583 | 1.005 |
| 7/2/20 | 8.5 | 2.588 | 1.028 |
| 7/3/20 | 8.5 | 2.575 | 1.023 |
| 7/6/20 | 8.5 | 2.569 | 1.033 |
| 7/7/20 | 8.5 | 2.536 | 1.009 |
| 7/8/20 | 8.5 | 2.637 | 1.12 |
| 7/9/20 | 8.5 | 2.586 | 1.084 |
| 7/10/20 | 8.5 | 2.606 | 1.088 |
| 7/13/20 | 8.5 | 2.594 | 1.077 |
| 7/14/20 | 8.5 | 2.576 | 1.061 |
| 7/15/20 | 8.5 | 2.554 | 1.055 |
| 7/16/20 | 8.5 | 2.503 | 1.007 |
| 7/17/20 | 8.5 | 2.504 | 1.016 |
| 7/20/20 | 8.5 | 2.468 | 0.991 |
| 7/21/20 | 8.5 | 2.464 | 0.999 |
| 7/22/20 | 8.5 | 2.478 | 1.016 |
| 7/23/20 | 8.5 | 2.453 | 1.009 |
| 7/24/20 | 8.5 | 2.418 | 0.985 |
| 7/27/20 | 8.5 | 2.436 | 1.003 |
| 7/28/20 | 8.5 | 2.396 | 0.956 |
| 7/29/20 | 8.5 | 2.408 | 0.97 |
| 7/30/20 | 8.5 | 2.382 | 0.936 |
| 7/31/20 | 8.5 | 2.382 | 0.94 |
| 8/4/20 | 8.5 | 2.345 | 0.902 |
| 8/5/20 | 8.5 | 2.376 | 0.958 |
| 8/6/20 | 8.5 | 2.348 | 0.934 |
| 8/7/20 | 8.5 | 2.377 | 0.963 |
| 8/10/20 | 8.5 | 2.399 | 0.992 |
| 8/11/20 | 8.5 | 2.47 | 1.074 |
| 8/12/20 | 8.5 | 2.509 | 1.11 |
| 8/13/20 | 8.5 | 2.563 | 1.158 |
| 8/14/20 | 8.5 | 2.56 | 1.145 |
| 8/17/20 | 8.5 | 2.531 | 1.11 |
| 8/18/20 | 8.5 | 2.508 | 1.082 |
| 8/19/20 | 8.5 | 2.535 | 1.111 |
| 8/20/20 | 8.5 | 2.522 | 1.095 |
| 8/21/20 | 8.5 | 2.511 | 1.086 |
| 8/24/20 | 8.5 | 2.532 | 1.091 |
| 8/25/20 | 8.5 | 2.548 | 1.113 |
| 8/26/20 | 8.5 | 2.579 | 1.138 |
| 8/27/20 | 8.5 | 2.648 | 1.204 |
| 8/28/20 | 8.5 | 2.645 | 1.206 |
| 8/31/20 | 8.5 | 2.623 | 1.18 |
| 9/1/20 | 8.5 | 2.552 | 1.119 |
| 9/2/20 | 8.5 | 2.5 | 1.072 |
| 9/3/20 | 8.5 | 2.495 | 1.059 |
| 9/4/20 | 8.5 | 2.548 | 1.117 |
| 9/8/20 | 8.5 | 2.548 | 1.095 |
| 9/9/20 | 8.5 | 2.564 | 1.119 |
| 9/10/20 | 8.5 | 2.54 | 1.094 |
| 9/11/20 | 8.5 | 2.521 | 1.075 |
| 9/14/20 | 8.5 | 2.52 | 1.079 |
| 9/15/20 | 8.5 | 2.534 | 1.1 |
| 9/16/20 | 8.5 | 2.559 | 1.124 |
| 9/17/20 | 8.5 | 2.55 | 1.103 |
| 9/18/20 | 8.5 | 2.562 | 1.115 |
| 9/21/20 | 8.5 | 2.554 | 1.094 |
| 9/22/20 | 8.5 | 2.574 | 1.101 |
| 9/23/20 | 8.5 | 2.569 | 1.097 |
| 9/24/20 | 8.5 | 2.586 | 1.094 |
| 9/25/20 | 8.5 | 2.594 | 1.088 |
| 9/28/20 | 8.5 | 2.622 | 1.107 |
| 9/29/20 | 8.5 | 2.611 | 1.098 |
| 9/30/20 | 8.5 | 2.665 | 1.127 |
| 10/1/20 | 8.5 | 2.655 | 1.118 |
| 10/2/20 | 8.5 | 2.654 | 1.128 |
| 10/5/20 | 8.5 | 2.718 | 1.195 |
| 10/6/20 | 8.5 | 2.672 | 1.159 |
| 10/7/20 | 8.5 | 2.722 | 1.215 |
| 10/8/20 | 8.5 | 2.711 | 1.215 |
| 10/9/20 | 8.5 | 2.732 | 1.246 |
| 10/13/20 | 8.5 | 2.694 | 1.208 |
| 10/14/20 | 8.5 | 2.679 | 1.193 |
| 10/15/20 | 8.5 | 2.666 | 1.169 |
| 10/16/20 | 8.5 | 2.675 | 1.179 |
| 10/19/20 | 8.5 | 2.687 | 1.188 |
| 10/20/20 | 8.5 | 2.736 | 1.233 |
| 10/21/20 | 8.5 | 2.738 | 1.23 |
| 10/22/20 | 8.5 | 2.775 | 1.27 |
| 10/23/20 | 8.5 | 2.762 | 1.254 |
| 10/26/20 | 8.5 | 2.75 | 1.23 |
| 10/27/20 | 8.5 | 2.734 | 1.211 |
| 10/28/20 | 8.5 | 2.722 | 1.193 |
| 10/29/20 | 8.5 | 2.774 | 1.233 |
| 10/30/20 | 8.5 | 2.816 | 1.271 |
| 11/2/20 | 8.5 | 2.795 | 1.246 |
| 11/3/20 | 8.5 | 2.832 | 1.288 |
| 11/4/20 | 8.5 | 2.737 | 1.206 |
| 11/5/20 | 8.5 | 2.701 | 1.213 |
| 11/6/20 | 8.5 | 2.715 | 1.238 |
| 11/9/20 | 8.5 | 2.756 | 1.338 |
| 11/10/20 | 8.5 | 2.761 | 1.343 |
| 11/12/20 | 8.5 | 2.713 | 1.295 |
| 11/13/20 | 8.5 | 2.719 | 1.296 |
| 11/16/20 | 8.5 | 2.733 | 1.309 |
| 11/17/20 | 8.5 | 2.69 | 1.264 |
| 11/18/20 | 8.5 | 2.69 | 1.265 |
| 11/19/20 | 8.5 | 2.657 | 1.231 |
| 11/20/20 | 8.5 | 2.612 | 1.186 |
| 11/23/20 | 8.5 | 2.632 | 1.206 |
| 11/24/20 | 8.5 | 2.642 | 1.235 |
| 11/25/20 | 8.5 | 2.634 | 1.237 |
| 11/26/20 | 8.5 | 2.614 | 1.224 |
| 11/27/20 | 8.5 | 2.596 | 1.205 |
| 11/30/20 | 8.5 | 2.568 | 1.188 |
| 12/1/20 | 8.5 | 2.614 | 1.243 |
| 12/2/20 | 8.5 | 2.644 | 1.294 |
| 12/3/20 | 8.5 | 2.597 | 1.275 |
| 12/4/20 | 8.5 | 2.67 | 1.356 |
| 12/7/20 | 8.5 | 2.637 | 1.322 |
| 12/8/20 | 8.5 | 2.627 | 1.307 |
| 12/9/20 | 8.5 | 2.641 | 1.314 |
| 12/10/20 | 8.5 | 2.63 | 1.289 |
| 12/11/20 | 8.5 | 2.635 | 1.282 |
| 12/14/20 | 8.5 | 2.657 | 1.298 |
| 12/15/20 | 8.5 | 2.677 | 1.306 |
| 12/16/20 | 8.5 | 2.679 | 1.313 |
| 12/17/20 | 8.5 | 2.664 | 1.316 |
| 12/18/20 | 8.5 | 2.645 | 1.306 |
| 12/21/20 | 8.5 | 2.644 | 1.295 |
| 12/22/20 | 8.5 | 2.615 | 1.265 |
| 12/23/20 | 8.5 | 2.64 | 1.294 |
| 12/24/20 | 8.5 | 2.623 | 1.277 |
| 12/29/20 | 8.5 | 2.602 | 1.265 |
| 12/30/20 | 8.5 | 2.59 | 1.26 |
| 12/31/20 | 8.5 | 2.554 | 1.226 |
| 1/4/21 | 8.5 | 2.55 | 1.238 |
| 1/5/21 | 8.5 | 2.61 | 1.296 |
| 1/6/21 | 8.5 | 2.687 | 1.379 |
| 1/7/21 | 8.5 | 2.701 | 1.412 |
| 1/8/21 | 8.5 | 2.694 | 1.439 |
| 1/11/21 | 8.5 | 2.718 | 1.468 |
| 1/12/21 | 8.5 | 2.732 | 1.483 |
| 1/13/21 | 8.5 | 2.701 | 1.447 |
| 1/14/21 | 8.5 | 2.743 | 1.496 |
| 1/15/21 | 8.5 | 2.697 | 1.45 |
| 1/18/21 | 8.5 | 2.699 | 1.45 |
| 1/19/21 | 8.5 | 2.689 | 1.456 |
| 1/20/21 | 8.5 | 2.702 | 1.478 |
| 1/21/21 | 8.5 | 2.724 | 1.507 |
| 1/22/21 | 8.5 | 2.719 | 1.479 |
| 1/25/21 | 8.5 | 2.703 | 1.456 |
| 1/26/21 | 8.5 | 2.726 | 1.474 |
| 1/27/21 | 8.5 | 2.735 | 1.464 |
| 1/28/21 | 8.5 | 2.759 | 1.485 |
| 1/29/21 | 8.5 | 2.756 | 1.481 |
| 2/1/21 | 8.5 | 2.745 | 1.48 |
| 2/2/21 | 8.5 | 2.756 | 1.497 |
| 2/3/21 | 8.5 | 2.788 | 1.53 |
| 2/4/21 | 8.5 | 2.811 | 1.557 |
| 2/5/21 | 8.5 | 2.841 | 1.596 |
| 2/8/21 | 8.5 | 2.835 | 1.597 |
| 2/9/21 | 8.5 | 2.827 | 1.588 |
| 2/10/21 | 8.5 | 2.823 | 1.587 |
| 2/11/21 | 8.5 | 2.835 | 1.598 |
| 2/12/21 | 8.5 | 2.88 | 1.642 |
| 2/16/21 | 8.5 | 2.94 | 1.717 |
| 2/17/21 | 8.5 | 2.938 | 1.696 |
| 2/18/21 | 8.5 | 2.97 | 1.729 |
| 2/19/21 | 8.5 | 3.035 | 1.798 |
| 2/22/21 | 8.5 | 3.061 | 1.82 |
| 2/23/21 | 8.5 | 3.102 | 1.862 |
| 2/24/21 | 8.5 | 3.125 | 1.89 |
| 2/25/21 | 8.5 | 3.156 | 1.912 |
| 2/26/21 | 8.5 | 3.016 | 1.748 |
| 3/1/21 | 8.5 | 3.029 | 1.759 |
| 3/2/21 | 8.5 | 3.044 | 1.783 |
| 3/3/21 | 8.5 | 3.094 | 1.815 |
| 3/4/21 | 8.5 | 3.183 | 1.899 |
| 3/5/21 | 8.5 | 3.184 | 1.874 |
| 3/8/21 | 8.5 | 3.206 | 1.907 |
| 3/9/21 | 8.5 | 3.136 | 1.835 |
| 3/10/21 | 8.5 | 3.134 | 1.839 |
| 3/11/21 | 8.5 | 3.173 | 1.883 |
| 3/12/21 | 8.5 | 3.328 | 2.023 |
| 3/15/21 | 8.5 | 3.308 | 1.995 |
| 3/16/21 | 8.5 | 3.357 | 2.023 |
| 3/17/21 | 8.5 | 3.414 | 2.073 |
| 3/18/21 | 8.5 | 3.411 | 2.079 |
| 3/19/21 | 8.5 | 3.395 | 2.046 |
| 3/22/21 | 8.5 | 3.352 | 2.015 |
| 3/23/21 | 8.5 | 3.282 | 1.954 |
| 3/24/21 | 8.5 | 3.232 | 1.915 |
| 3/25/21 | 8.5 | 3.231 | 1.918 |
| 3/26/21 | 8.5 | 3.261 | 1.949 |
| 3/29/21 | 8.5 | 3.308 | 1.993 |
| 3/30/21 | 8.5 | 3.28 | 1.954 |
| 3/31/21 | 8.5 | 3.287 | 1.97 |
| 4/1/21 | 8.5 | 3.251 | 1.948 |
| 4/5/21 | 8.5 | 3.27 | 1.973 |
| 4/6/21 | 8.5 | 3.213 | 1.912 |
| 4/7/21 | 8.5 | 3.235 | 1.939 |
| 4/8/21 | 8.5 | 3.2 | 1.903 |
| 4/9/21 | 8.5 | 3.213 | 1.918 |
| 4/12/21 | 8.5 | 3.223 | 1.932 |
| 4/13/21 | 8.5 | 3.218 | 1.924 |
| 4/14/21 | 8.5 | 3.248 | 1.956 |
| 4/15/21 | 8.5 | 3.187 | 1.887 |
| 4/16/21 | 8.5 | 3.268 | 1.978 |
| 4/19/21 | 8.5 | 3.296 | 2.021 |
| 4/20/21 | 8.5 | 3.301 | 2.005 |
| 4/21/21 | 8.5 | 3.337 | 2.006 |
| 4/22/21 | 8.5 | 3.346 | 2.027 |
| 4/23/21 | 8.5 | 3.362 | 2.049 |
| 4/26/21 | 8.5 | 3.368 | 2.063 |
| 4/27/21 | 8.5 | 3.42 | 2.099 |
| 4/28/21 | 8.5 | 3.391 | 2.066 |
| 4/29/21 | 8.5 | 3.403 | 2.087 |
| 4/30/21 | 8.5 | 3.398 | 2.072 |
| 5/3/21 | 8.5 | 3.388 | 2.062 |
| 5/4/21 | 8.5 | 3.393 | 2.063 |
| 5/5/21 | 8.5 | 3.372 | 2.041 |
| 5/6/21 | 8.5 | 3.392 | 2.07 |
| 5/7/21 | 8.5 | 3.382 | 2.057 |
| 5/10/21 | 8.5 | 3.433 | 2.111 |
| 5/11/21 | 8.5 | 3.461 | 2.137 |
| 5/12/21 | 8.5 | 3.511 | 2.184 |
| 5/13/21 | 8.5 | 3.518 | 2.169 |
| 5/14/21 | 8.5 | 3.507 | 2.172 |
| 5/17/21 | 8.5 | 3.516 | 2.182 |
| 5/18/21 | 8.5 | 3.515 | 2.173 |
| 5/19/21 | 8.5 | 3.521 | 2.176 |
| 5/20/21 | 8.5 | 3.483 | 2.142 |
| 5/21/21 | 8.5 | 3.482 | 2.148 |
| 5/25/21 | 8.5 | 3.396 | 2.062 |
| 5/26/21 | 8.5 | 3.365 | 2.035 |
| 5/27/21 | 8.5 | 3.375 | 2.047 |
| 5/28/21 | 8.5 | 3.35 | 2.024 |
| 5/31/21 | 8.5 | 3.354 | 2.03 |
| 6/1/21 | 8.5 | 3.351 | 2.031 |
| 6/2/21 | 8.5 | 3.338 | 2.02 |
| 6/3/21 | 8.5 | 3.352 | 2.036 |
| 6/4/21 | 8.5 | 3.296 | 1.978 |
| 6/7/21 | 8.5 | 3.307 | 1.995 |
| 6/8/21 | 8.5 | 3.29 | 1.976 |
| 6/9/21 | 8.5 | 3.264 | 1.946 |
| 6/10/21 | 8.5 | 3.26 | 1.944 |
| 6/11/21 | 8.5 | 3.256 | 1.936 |
| 6/14/21 | 8.5 | 3.269 | 1.953 |
| 6/15/21 | 8.5 | 3.26 | 1.938 |
| 6/16/21 | 8.5 | 3.281 | 1.947 |
| 6/17/21 | 8.5 | 3.21 | 1.874 |
| 6/18/21 | 8.5 | 3.136 | 1.803 |
| 6/21/21 | 8.5 | 3.179 | 1.855 |
| 6/22/21 | 8.5 | 3.185 | 1.857 |
| 6/23/21 | 8.5 | 3.183 | 1.847 |
| 6/24/21 | 8.5 | 3.174 | 1.837 |
| 6/25/21 | 8.5 | 3.231 | 1.894 |
| 6/28/21 | 8.5 | 3.206 | 1.87 |
| 6/29/21 | 8.5 | 3.203 | 1.874 |
| 6/30/21 | 8.5 | 3.172 | 1.843 |
| 7/2/21 | 8.5 | 3.165 | 1.839 |
| 7/5/21 | 8.5 | 3.166 | 1.84 |
| 7/6/21 | 8.5 | 3.108 | 1.786 |
| 7/7/21 | 8.5 | 3.087 | 1.764 |
| 7/8/21 | 8.5 | 3.053 | 1.738 |
| 7/9/21 | 8.5 | 3.141 | 1.82 |
| 7/12/21 | 8.5 | 3.143 | 1.826 |
| 7/13/21 | 8.5 | 3.167 | 1.851 |
| 7/14/21 | 8.5 | 3.128 | 1.806 |
| 7/15/21 | 8.5 | 3.1 | 1.782 |
| 7/16/21 | 8.5 | 3.09 | 1.777 |
| 7/19/21 | 8.5 | 3.026 | 1.692 |
| 7/20/21 | 8.5 | 3.085 | 1.755 |
| 7/21/21 | 8.5 | 3.134 | 1.807 |
| 7/22/21 | 8.5 | 3.093 | 1.766 |
| 7/23/21 | 8.5 | 3.108 | 1.788 |
| 7/26/21 | 8.5 | 3.115 | 1.798 |
| 7/27/21 | 8.5 | 3.067 | 1.742 |
| 7/28/21 | 8.5 | 3.056 | 1.732 |
| 7/29/21 | 8.5 | 3.075 | 1.75 |
| 7/30/21 | 8.5 | 3.094 | 1.767 |
| 8/3/21 | 8.5 | 3.027 | 1.702 |
| 8/4/21 | 8.5 | 3.035 | 1.707 |
| 8/5/21 | 8.5 | 3.037 | 1.709 |
| 8/6/21 | 8.5 | 3.096 | 1.767 |
| 8/9/21 | 8.5 | 3.127 | 1.796 |
| 8/10/21 | 8.5 | 3.136 | 1.81 |
| 8/11/21 | 8.5 | 3.156 | 1.826 |
| 8/12/21 | 8.5 | 3.15 | 1.822 |
| 8/13/21 | 8.5 | 3.096 | 1.761 |
| 8/16/21 | 8.5 | 3.076 | 1.746 |
| 8/17/21 | 8.5 | 3.077 | 1.753 |
| 8/18/21 | 8.5 | 3.079 | 1.748 |
| 8/19/21 | 8.5 | 3.053 | 1.721 |
| 8/20/21 | 8.5 | 3.063 | 1.73 |
| 8/23/21 | 8.5 | 3.077 | 1.752 |
| 8/24/21 | 8.5 | 3.106 | 1.775 |
| 8/25/21 | 8.5 | 3.16 | 1.823 |
| 8/26/21 | 8.5 | 3.124 | 1.783 |
| 8/27/21 | 8.5 | 3.089 | 1.755 |
| 8/30/21 | 8.5 | 3.081 | 1.748 |
| 8/31/21 | 8.5 | 3.136 | 1.802 |
| 9/1/21 | 8.5 | 3.079 | 1.743 |
| 9/2/21 | 8.5 | 3.059 | 1.723 |
| 9/3/21 | 8.5 | 3.095 | 1.758 |
| 9/7/21 | 8.5 | 3.131 | 1.799 |
| 9/8/21 | 8.5 | 3.12 | 1.781 |
| 9/9/21 | 8.5 | 3.08 | 1.743 |
| 9/10/21 | 8.5 | 3.154 | 1.807 |
| 9/13/21 | 8.5 | 3.14 | 1.791 |
| 9/14/21 | 8.5 | 3.09 | 1.742 |
| 9/15/21 | 8.5 | 3.121 | 1.775 |
| 9/16/21 | 8.5 | 3.132 | 1.779 |
| 9/17/21 | 8.5 | 3.176 | 1.829 |
| 9/20/21 | 8.5 | 3.128 | 1.766 |
| 9/21/21 | 8.5 | 3.148 | 1.79 |
| 9/22/21 | 8.5 | 3.116 | 1.759 |
| 9/23/21 | 8.5 | 3.183 | 1.834 |
| 9/24/21 | 8.5 | 3.259 | 1.905 |
| 9/27/21 | 8.5 | 3.269 | 1.917 |
| 9/28/21 | 8.5 | 3.327 | 1.969 |
| 9/29/21 | 8.5 | 3.338 | 1.988 |
| 10/1/21 | 8.5 | 3.314 | 1.957 |
| 10/4/21 | 8.5 | 3.314 | 1.968 |
| 10/5/21 | 8.5 | 3.356 | 2.011 |
| 10/6/21 | 8.5 | 3.34 | 1.99 |
| 10/7/21 | 8.5 | 3.385 | 2.039 |
| 10/8/21 | 8.5 | 3.436 | 2.089 |
| 10/12/21 | 8.5 | 3.404 | 2.053 |
| 10/13/21 | 8.5 | 3.37 | 2.018 |
| 10/14/21 | 8.5 | 3.312 | 1.968 |
| 10/15/21 | 8.5 | 3.322 | 1.99 |
| 10/18/21 | 8.5 | 3.299 | 1.963 |
| 10/19/21 | 8.5 | 3.337 | 2.006 |
| 10/20/21 | 8.5 | 3.362 | 2.033 |
| 10/21/21 | 8.5 | 3.404 | 2.078 |
| 10/22/21 | 8.5 | 3.373 | 2.047 |
| 10/25/21 | 8.5 | 3.38 | 2.055 |
| 10/26/21 | 8.5 | 3.334 | 2.01 |
| 10/27/21 | 8.5 | 3.243 | 1.924 |
| 10/28/21 | 8.5 | 3.277 | 1.949 |
| 10/29/21 | 8.5 | 3.352 | 2.027 |
| 11/1/21 | 8.5 | 3.355 | 2.033 |
| 11/2/21 | 8.5 | 3.376 | 2.05 |
| 11/3/21 | 8.5 | 3.376 | 2.048 |
| 11/4/21 | 8.5 | 3.33 | 2.008 |
| 11/5/21 | 8.5 | 3.272 | 1.957 |
| 11/8/21 | 8.5 | 3.295 | 1.98 |
| 11/9/21 | 8.5 | 3.262 | 1.947 |
| 11/10/21 | 8.5 | 3.33 | 2.018 |
| 11/12/21 | 8.5 | 3.342 | 2.03 |
| 11/15/21 | 8.5 | 3.392 | 2.072 |
| 11/16/21 | 8.5 | 3.431 | 2.113 |
| 11/17/21 | 8.5 | 3.375 | 2.054 |
| 11/18/21 | 8.5 | 3.372 | 2.047 |
| 11/19/21 | 8.5 | 3.332 | 2.001 |
| 11/22/21 | 8.5 | 3.398 | 2.099 |
| 11/23/21 | 8.5 | 3.454 | 2.142 |
| 11/24/21 | 8.5 | 3.402 | 2.066 |
| 11/25/21 | 8.5 | 3.415 | 2.071 |
| 11/26/21 | 8.5 | 3.296 | 1.947 |
| 11/29/21 | 8.5 | 3.306 | 1.943 |
| 11/30/21 | 8.5 | 3.288 | 1.902 |
| 12/1/21 | 8.5 | 3.209 | 1.823 |
| 12/2/21 | 8.5 | 3.188 | 1.798 |
| 12/3/21 | 8.5 | 3.132 | 1.742 |
| 12/6/21 | 8.5 | 3.188 | 1.793 |
| 12/7/21 | 8.5 | 3.202 | 1.828 |
| 12/8/21 | 8.5 | 3.222 | 1.845 |
| 12/9/21 | 8.5 | 3.197 | 1.822 |
| 12/10/21 | 8.5 | 3.176 | 1.805 |
| 12/13/21 | 8.5 | 3.126 | 1.751 |
| 12/14/21 | 8.5 | 3.16 | 1.796 |
| 12/15/21 | 8.5 | 3.119 | 1.746 |
| 12/16/21 | 8.5 | 3.07 | 1.7 |
| 12/17/21 | 8.5 | 3.045 | 1.668 |
| 12/20/21 | 8.5 | 3.133 | 1.741 |
| 12/21/21 | 8.5 | 3.154 | 1.767 |
| 12/22/21 | 8.5 | 3.115 | 1.732 |
| 12/23/21 | 8.5 | 3.143 | 1.764 |
| 12/24/21 | 8.5 | 3.146 | 1.768 |
| 12/29/21 | 8.5 | 3.139 | 1.765 |
| 12/30/21 | 8.5 | 3.09 | 1.717 |
| 12/31/21 | 8.5 | 3.051 | 1.681 |
| 1/4/22 | 8.5 | 3.182 | 1.832 |
| 1/5/22 | 8.5 | 3.221 | 1.856 |
| 1/6/22 | 8.5 | 3.298 | 1.933 |
| 1/7/22 | 8.5 | 3.345 | 1.975 |
| 1/10/22 | 8.5 | 3.336 | 1.961 |
| 1/11/22 | 8.5 | 3.34 | 1.958 |
| 1/12/22 | 8.5 | 3.368 | 1.988 |
| 1/13/22 | 8.5 | 3.344 | 1.966 |
| 1/14/22 | 8.5 | 3.398 | 2.015 |
| 1/17/22 | 8.5 | 3.424 | 2.039 |
| 1/18/22 | 8.5 | 3.503 | 2.102 |
| 1/19/22 | 8.5 | 3.478 | 2.083 |
| 1/20/22 | 8.5 | 3.463 | 2.058 |
| 1/21/22 | 8.5 | 3.402 | 1.995 |
| 1/24/22 | 8.5 | 3.464 | 2.047 |
| 1/25/22 | 8.5 | 3.483 | 2.057 |
| 1/26/22 | 8.5 | 3.503 | 2.072 |
| 1/27/22 | 8.5 | 3.446 | 1.995 |
| 1/28/22 | 8.5 | 3.469 | 2.005 |
| 1/31/22 | 8.5 | 3.539 | 2.055 |
| 2/1/22 | 8.5 | 3.567 | 2.084 |
| 2/2/22 | 8.5 | 3.526 | 2.047 |
| 2/3/22 | 8.5 | 3.558 | 2.075 |
| 2/4/22 | 8.5 | 3.598 | 2.102 |
| 2/7/22 | 8.5 | 3.6 | 2.099 |
| 2/8/22 | 8.5 | 3.648 | 2.135 |
| 2/9/22 | 8.5 | 3.654 | 2.143 |
| 2/10/22 | 8.5 | 3.725 | 2.214 |
| 2/11/22 | 8.5 | 3.669 | 2.136 |
| 2/14/22 | 8.5 | 3.735 | 2.194 |
| 2/15/22 | 8.5 | 3.764 | 2.232 |
| 2/16/22 | 8.5 | 3.74 | 2.207 |
| 2/17/22 | 8.5 | 3.713 | 2.176 |
| 2/18/22 | 8.5 | 3.702 | 2.157 |
| 2/22/22 | 8.5 | 3.733 | 2.187 |
| 2/23/22 | 8.5 | 3.788 | 2.24 |
| 2/24/22 | 8.5 | 3.771 | 2.2 |
| 2/25/22 | 8.5 | 3.738 | 2.168 |
| 2/28/22 | 8.5 | 3.691 | 2.124 |
| 3/1/22 | 8.5 | 3.565 | 1.995 |
| 3/2/22 | 8.5 | 3.642 | 2.071 |
| 3/3/22 | 8.5 | 3.628 | 2.029 |
| 3/4/22 | 8.5 | 3.588 | 1.962 |
| 3/7/22 | 8.5 | 3.67 | 2.031 |
| 3/8/22 | 8.5 | 3.785 | 2.126 |
| 3/9/22 | 8.5 | 3.857 | 2.197 |
| 3/10/22 | 8.5 | 3.896 | 2.243 |
| 3/11/22 | 8.5 | 3.943 | 2.288 |
| 3/14/22 | 8.5 | 4.089 | 2.431 |
| 3/15/22 | 8.5 | 4.152 | 2.49 |
| 3/16/22 | 8.5 | 4.02 | 2.378 |
| 3/17/22 | 8.5 | 4.009 | 2.402 |
| 3/18/22 | 8.5 | 3.969 | 2.382 |
| 3/21/22 | 8.5 | 4.049 | 2.469 |
| 3/22/22 | 8.5 | 4.141 | 2.566 |
| 3/23/22 | 8.5 | 4.007 | 2.437 |
| 3/24/22 | 8.5 | 4.028 | 2.466 |
| 3/25/22 | 8.5 | 4.11 | 2.554 |
| 3/28/22 | 8.5 | 4.029 | 2.481 |
| 3/29/22 | 8.5 | 3.987 | 2.458 |
| 3/30/22 | 8.5 | 3.944 | 2.411 |
| 3/31/22 | 8.5 | 3.908 | 2.384 |
| 4/1/22 | 8.5 | 3.904 | 2.376 |
| 4/4/22 | 8.5 | 3.897 | 2.367 |
| 4/5/22 | 8.5 | 3.979 | 2.451 |
| 4/6/22 | 8.5 | 3.99 | 2.453 |
| 4/7/22 | 8.5 | 4.056 | 2.517 |
| 4/8/22 | 8.5 | 4.116 | 2.574 |
| 4/11/22 | 8.5 | 4.212 | 2.651 |
| 4/12/22 | 8.5 | 4.182 | 2.613 |
| 4/13/22 | 8.5 | 4.191 | 2.612 |
| 4/14/22 | 8.5 | 4.327 | 2.714 |
| 4/18/22 | 8.5 | 4.368 | 2.742 |
| 4/19/22 | 8.5 | 4.403 | 2.774 |
| 4/20/22 | 8.5 | 4.398 | 2.765 |
| 4/21/22 | 8.5 | 4.479 | 2.82 |
| 4/22/22 | 8.5 | 4.497 | 2.82 |
| 4/25/22 | 8.5 | 4.469 | 2.782 |
| 4/26/22 | 8.5 | 4.413 | 2.722 |
| 4/27/22 | 8.5 | 4.505 | 2.787 |
| 4/28/22 | 8.5 | 4.448 | 2.745 |
| 4/29/22 | 8.5 | 4.519 | 2.812 |
| 5/2/22 | 8.5 | 4.588 | 2.867 |
| 5/3/22 | 8.5 | 4.597 | 2.882 |
| 5/4/22 | 8.5 | 4.537 | 2.837 |
| 5/5/22 | 8.5 | 4.658 | 2.947 |
| 5/6/22 | 8.5 | 4.75 | 3.037 |
| 5/9/22 | 8.5 | 4.702 | 2.972 |
| 5/10/22 | 8.5 | 4.696 | 2.969 |
| 5/11/22 | 8.5 | 4.659 | 2.95 |
| 5/12/22 | 8.5 | 4.612 | 2.907 |
| 5/13/22 | 8.5 | 4.645 | 2.934 |
| 5/16/22 | 8.5 | 4.632 | 2.918 |
| 5/17/22 | 8.5 | 4.732 | 3.017 |
| 5/18/22 | 8.5 | 4.638 | 2.918 |
| 5/19/22 | 8.5 | 4.602 | 2.864 |
| 5/20/22 | 8.5 | 4.552 | 2.814 |
| 5/24/22 | 8.5 | 4.531 | 2.788 |
| 5/25/22 | 8.5 | 4.5 | 2.762 |
| 5/26/22 | 8.5 | 4.543 | 2.815 |
| 5/27/22 | 8.5 | 4.526 | 2.797 |
| 5/30/22 | 8.5 | 4.522 | 2.798 |
| 5/31/22 | 8.5 | 4.578 | 2.85 |
| 6/1/22 | 8.5 | 4.591 | 2.877 |
| 6/2/22 | 8.5 | 4.597 | 2.898 |
| 6/3/22 | 8.5 | 4.647 | 2.954 |
| 6/6/22 | 8.5 | 4.766 | 3.09 |
| 6/7/22 | 8.5 | 4.781 | 3.111 |
| 6/8/22 | 8.5 | 4.849 | 3.18 |
| 6/9/22 | 8.5 | 4.804 | 3.142 |
| 6/10/22 | 8.5 | 4.871 | 3.193 |
| 6/13/22 | 8.5 | 5.011 | 3.304 |
| 6/14/22 | 8.5 | 5.111 | 3.4 |
| 6/15/22 | 8.5 | 5.057 | 3.355 |
| 6/16/22 | 8.5 | 5.002 | 3.286 |
| 6/17/22 | 8.5 | 5.018 | 3.307 |
| 6/20/22 | 8.5 | 5.02 | 3.311 |
| 6/21/22 | 8.5 | 5.101 | 3.403 |
| 6/22/22 | 8.5 | 5.032 | 3.337 |
| 6/23/22 | 8.5 | 4.971 | 3.274 |
| 6/24/22 | 8.5 | 4.999 | 3.3 |
| 6/27/22 | 8.5 | 5.049 | 3.349 |
| 6/28/22 | 8.5 | 4.994 | 3.292 |
| 6/29/22 | 8.5 | 4.912 | 3.209 |
| 6/30/22 | 8.5 | 4.85 | 3.14 |
| 7/4/22 | 8.5 | 4.815 | 3.108 |
| 7/5/22 | 8.5 | 4.762 | 3.045 |
| 7/6/22 | 8.5 | 4.825 | 3.11 |
| 7/7/22 | 8.5 | 4.851 | 3.145 |
| 7/8/22 | 8.5 | 4.885 | 3.181 |
| 7/11/22 | 8.5 | 4.837 | 3.146 |
| 7/12/22 | 8.5 | 4.792 | 3.106 |
| 7/13/22 | 8.5 | 4.728 | 3.047 |
| 7/14/22 | 8.5 | 4.745 | 3.065 |
| 7/15/22 | 8.5 | 4.688 | 3.022 |
| 7/18/22 | 8.5 | 4.702 | 3.05 |
| 7/19/22 | 8.5 | 4.676 | 3.041 |
| 7/20/22 | 8.5 | 4.672 | 3.043 |
| 7/21/22 | 8.5 | 4.545 | 2.92 |
| 7/22/22 | 8.5 | 4.444 | 2.823 |
| 7/25/22 | 8.5 | 4.477 | 2.855 |
| 7/26/22 | 8.5 | 4.454 | 2.829 |
| 7/27/22 | 8.5 | 4.461 | 2.838 |
| 7/28/22 | 8.5 | 4.381 | 2.757 |
| 7/29/22 | 8.5 | 4.394 | 2.775 |
| 8/2/22 | 8.5 | 4.457 | 2.832 |
| 8/3/22 | 8.5 | 4.386 | 2.779 |
| 8/4/22 | 8.5 | 4.369 | 2.77 |
| 8/5/22 | 8.5 | 4.419 | 2.818 |
| 8/8/22 | 8.5 | 4.359 | 2.764 |
| 8/9/22 | 8.5 | 4.383 | 2.783 |
| 8/10/22 | 8.5 | 4.356 | 2.774 |
| 8/11/22 | 8.5 | 4.465 | 2.888 |
| 8/12/22 | 8.5 | 4.43 | 2.851 |
| 8/15/22 | 8.5 | 4.434 | 2.849 |
| 8/16/22 | 8.5 | 4.428 | 2.835 |
| 8/17/22 | 8.5 | 4.481 | 2.899 |
| 8/18/22 | 8.5 | 4.474 | 2.891 |
| 8/19/22 | 8.5 | 4.531 | 2.936 |
| 8/22/22 | 8.5 | 4.597 | 3.001 |
| 8/23/22 | 8.5 | 4.625 | 3.026 |
| 8/24/22 | 8.5 | 4.666 | 3.069 |
| 8/25/22 | 8.5 | 4.598 | 3.004 |
| 8/26/22 | 8.5 | 4.583 | 2.983 |
| 8/29/22 | 8.5 | 4.623 | 3.021 |
| 8/30/22 | 8.5 | 4.585 | 2.983 |
| 8/31/22 | 8.5 | 4.627 | 3.028 |
| 9/1/22 | 8.5 | 4.698 | 3.104 |
| 9/2/22 | 8.5 | 4.644 | 3.036 |
| 9/6/22 | 8.5 | 4.753 | 3.155 |
| 9/7/22 | 8.5 | 4.73 | 3.128 |
| 9/8/22 | 8.5 | 4.808 | 3.206 |
| 9/9/22 | 8.5 | 4.754 | 3.15 |
| 9/12/22 | 8.5 | 4.772 | 3.166 |
| 9/13/22 | 8.5 | 4.774 | 3.161 |
| 9/14/22 | 8.5 | 4.718 | 3.105 |
| 9/15/22 | 8.5 | 4.676 | 3.055 |
| 9/16/22 | 8.5 | 4.711 | 3.078 |
| 9/19/22 | 8.5 | 4.68 | 3.05 |
| 9/20/22 | 8.5 | 4.666 | 3.03 |
| 9/21/22 | 8.5 | 4.595 | 2.95 |
| 9/22/22 | 8.5 | 4.65 | 3.007 |
| 9/23/22 | 8.5 | 4.661 | 2.97 |
| 9/26/22 | 8.5 | 4.763 | 3.039 |
| 9/27/22 | 8.5 | 4.926 | 3.184 |
| 9/28/22 | 8.5 | 4.715 | 2.966 |
| 9/29/22 | 8.5 | 4.915 | 3.102 |
| 10/3/22 | 8.5 | 4.94 | 3.152 |
| 10/4/22 | 8.5 | 4.913 | 3.134 |
| 10/5/22 | 8.5 | 5.007 | 3.226 |
| 10/6/22 | 8.5 | 5.009 | 3.235 |
| 10/7/22 | 8.5 | 5.034 | 3.265 |
| 10/11/22 | 8.5 | 5.139 | 3.368 |
| 10/12/22 | 8.5 | 5.162 | 3.392 |
| 10/13/22 | 8.5 | 5.113 | 3.35 |
| 10/14/22 | 8.5 | 5.191 | 3.428 |
| 10/17/22 | 8.5 | 5.202 | 3.431 |
| 10/18/22 | 8.5 | 5.138 | 3.367 |
| 10/19/22 | 8.5 | 5.326 | 3.55 |
| 10/20/22 | 8.5 | 5.445 | 3.666 |
| 10/21/22 | 8.5 | 5.492 | 3.711 |
| 10/24/22 | 8.5 | 5.458 | 3.667 |
| 10/25/22 | 8.5 | 5.391 | 3.597 |
| 10/26/22 | 8.5 | 5.242 | 3.437 |
| 10/27/22 | 8.5 | 5.131 | 3.326 |
| 10/28/22 | 8.5 | 5.115 | 3.315 |
| 10/31/22 | 8.5 | 5.109 | 3.326 |
| 11/1/22 | 8.5 | 5.038 | 3.267 |
| 11/2/22 | 8.5 | 5.084 | 3.347 |
| 11/3/22 | 8.5 | 5.146 | 3.409 |
| 11/4/22 | 8.5 | 5.251 | 3.522 |
| 11/7/22 | 8.5 | 5.382 | 3.643 |
| 11/8/22 | 8.5 | 5.278 | 3.536 |
| 11/9/22 | 8.5 | 5.224 | 3.485 |
| 11/10/22 | 8.5 | 5.024 | 3.284 |
| 11/14/22 | 8.5 | 5.016 | 3.28 |
| 11/15/22 | 8.5 | 4.958 | 3.238 |
| 11/16/22 | 8.5 | 4.858 | 3.137 |
| 11/17/22 | 8.5 | 4.915 | 3.194 |
| 11/18/22 | 8.5 | 4.941 | 3.224 |
| 11/21/22 | 8.5 | 4.86 | 3.152 |
| 11/22/22 | 8.5 | 4.782 | 3.086 |
| 11/23/22 | 8.5 | 4.657 | 2.991 |
| 11/24/22 | 8.5 | 4.61 | 2.954 |
| 11/25/22 | 8.5 | 4.61 | 2.958 |
| 11/28/22 | 8.5 | 4.606 | 2.968 |
| 11/29/22 | 8.5 | 4.651 | 3.024 |
| 11/30/22 | 8.5 | 4.63 | 3.009 |
| 12/1/22 | 8.5 | 4.477 | 2.865 |
| 12/2/22 | 8.5 | 4.403 | 2.795 |
| 12/5/22 | 8.5 | 4.456 | 2.836 |
| 12/6/22 | 8.5 | 4.4 | 2.77 |
| 12/7/22 | 8.5 | 4.361 | 2.747 |
| 12/8/22 | 8.5 | 4.364 | 2.746 |
| 12/9/22 | 8.5 | 4.437 | 2.82 |
| 12/12/22 | 8.5 | 4.492 | 2.885 |
| 12/13/22 | 8.5 | 4.456 | 2.853 |
| 12/14/22 | 8.5 | 4.468 | 2.861 |
| 12/15/22 | 8.5 | 4.443 | 2.818 |
| 12/16/22 | 8.5 | 4.51 | 2.88 |
| 12/19/22 | 8.5 | 4.62 | 2.985 |
| 12/20/22 | 8.5 | 4.692 | 3.039 |
| 12/21/22 | 8.5 | 4.694 | 3.047 |
| 12/22/22 | 8.5 | 4.75 | 3.1 |
| 12/23/22 | 8.5 | 4.823 | 3.172 |
| 12/28/22 | 8.5 | 4.941 | 3.288 |
| 12/29/22 | 8.5 | 4.904 | 3.251 |
| 12/30/22 | 8.5 | 4.928 | 3.261 |
| 1/3/23 | 8.5 | 4.878 | 3.219 |
| 1/4/23 | 8.5 | 4.808 | 3.153 |
| 1/5/23 | 8.5 | 4.814 | 3.157 |
| 1/6/23 | 8.5 | 4.74 | 3.101 |
| 1/9/23 | 8.5 | 4.738 | 3.102 |
| 1/10/23 | 8.5 | 4.772 | 3.135 |
| 1/11/23 | 8.5 | 4.663 | 3.039 |
| 1/12/23 | 8.5 | 4.546 | 2.931 |
| 1/13/23 | 8.5 | 4.53 | 2.928 |
| 1/16/23 | 8.5 | 4.515 | 2.914 |
| 1/17/23 | 8.5 | 4.523 | 2.927 |
| 1/18/23 | 8.5 | 4.424 | 2.848 |
| 1/19/23 | 8.5 | 4.434 | 2.849 |